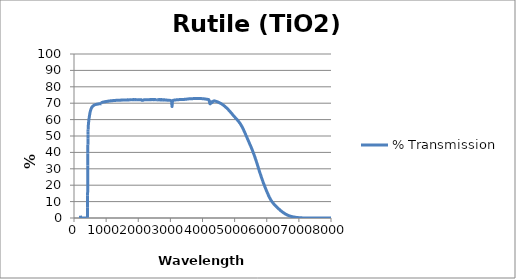
| Category | % Transmission |
|---|---|
| 200.0 | 1.432 |
| 202.0 | 0.986 |
| 204.0 | 0.728 |
| 206.0 | 0.485 |
| 208.0 | 0.356 |
| 210.0 | 0.247 |
| 212.0 | 0.213 |
| 214.0 | 0.172 |
| 216.0 | 0.12 |
| 218.0 | 0.092 |
| 220.0 | 0.074 |
| 222.0 | 0.062 |
| 224.0 | 0.046 |
| 226.0 | 0.031 |
| 228.0 | 0.032 |
| 230.0 | 0.025 |
| 232.0 | 0.013 |
| 234.0 | 0.014 |
| 236.0 | 0.012 |
| 238.0 | 0.01 |
| 240.0 | 0.006 |
| 242.0 | 0.01 |
| 244.0 | 0.007 |
| 246.0 | 0.003 |
| 248.0 | 0.007 |
| 250.0 | 0.006 |
| 252.0 | 0 |
| 254.0 | 0.005 |
| 256.0 | 0.006 |
| 258.0 | 0.005 |
| 260.0 | 0.005 |
| 262.0 | 0.005 |
| 264.0 | 0.001 |
| 266.0 | 0 |
| 268.0 | 0.002 |
| 270.0 | 0.004 |
| 272.0 | 0.002 |
| 274.0 | 0.005 |
| 276.0 | 0.005 |
| 278.0 | 0.005 |
| 280.0 | 0.005 |
| 282.0 | 0.001 |
| 284.0 | 0.004 |
| 286.0 | 0.004 |
| 288.0 | 0 |
| 290.0 | 0.002 |
| 292.0 | 0.003 |
| 294.0 | 0.006 |
| 296.0 | 0.002 |
| 298.0 | 0.004 |
| 300.0 | 0.001 |
| 302.0 | 0.003 |
| 304.0 | 0.005 |
| 306.0 | 0.003 |
| 308.0 | 0.002 |
| 310.0 | 0.002 |
| 312.0 | 0.002 |
| 314.0 | 0.003 |
| 316.0 | 0.002 |
| 318.0 | 0.003 |
| 320.0 | 0.003 |
| 322.0 | 0 |
| 324.0 | 0.002 |
| 326.0 | 0.005 |
| 328.0 | 0.001 |
| 330.0 | 0.004 |
| 332.0 | 0.002 |
| 334.0 | 0.002 |
| 336.0 | 0.001 |
| 338.0 | 0.002 |
| 340.0 | 0.003 |
| 342.0 | 0.001 |
| 344.0 | 0.002 |
| 346.0 | 0.002 |
| 348.0 | 0.002 |
| 350.0 | 0.003 |
| 352.0 | 0.001 |
| 354.0 | 0.002 |
| 356.0 | 0 |
| 358.0 | 0 |
| 360.0 | 0.004 |
| 362.0 | 0.002 |
| 364.0 | 0.001 |
| 366.0 | 0.002 |
| 368.0 | 0 |
| 370.0 | 0 |
| 372.0 | 0.002 |
| 374.0 | 0.003 |
| 376.0 | 0.002 |
| 378.0 | 0.001 |
| 380.0 | 0.001 |
| 382.0 | 0 |
| 384.0 | 0.004 |
| 386.0 | 0.001 |
| 388.0 | 0 |
| 390.0 | 0 |
| 392.0 | 0.002 |
| 394.0 | 0.001 |
| 396.0 | 0.001 |
| 398.0 | 0.004 |
| 400.0 | 0.004 |
| 402.0 | 0.002 |
| 404.0 | 0.005 |
| 406.0 | 0 |
| 408.0 | 0.002 |
| 410.0 | 0.001 |
| 412.0 | 0.003 |
| 414.0 | 0.003 |
| 416.0 | 0.023 |
| 418.0 | 0.297 |
| 420.0 | 1.832 |
| 422.0 | 6.296 |
| 424.0 | 13.903 |
| 426.0 | 23.111 |
| 428.0 | 32.044 |
| 430.0 | 39.349 |
| 432.0 | 44.659 |
| 434.0 | 48.385 |
| 436.0 | 50.975 |
| 438.0 | 52.831 |
| 440.0 | 54.158 |
| 442.0 | 55.135 |
| 444.0 | 55.863 |
| 446.0 | 56.455 |
| 448.0 | 56.992 |
| 450.0 | 57.442 |
| 452.0 | 57.876 |
| 454.0 | 58.243 |
| 456.0 | 58.602 |
| 458.0 | 58.931 |
| 460.0 | 59.29 |
| 462.0 | 59.622 |
| 464.0 | 59.935 |
| 466.0 | 60.234 |
| 468.0 | 60.539 |
| 470.0 | 60.837 |
| 472.0 | 61.133 |
| 474.0 | 61.404 |
| 476.0 | 61.669 |
| 478.0 | 61.948 |
| 480.0 | 62.198 |
| 482.0 | 62.438 |
| 484.0 | 62.661 |
| 486.0 | 62.878 |
| 488.0 | 63.123 |
| 490.0 | 63.337 |
| 492.0 | 63.55 |
| 494.0 | 63.749 |
| 496.0 | 63.918 |
| 498.0 | 64.12 |
| 500.0 | 64.334 |
| 502.0 | 64.513 |
| 504.0 | 64.687 |
| 506.0 | 64.823 |
| 508.0 | 64.968 |
| 510.0 | 65.136 |
| 512.0 | 65.325 |
| 514.0 | 65.462 |
| 516.0 | 65.601 |
| 518.0 | 65.727 |
| 520.0 | 65.842 |
| 522.0 | 65.982 |
| 524.0 | 66.118 |
| 526.0 | 66.231 |
| 528.0 | 66.335 |
| 530.0 | 66.429 |
| 532.0 | 66.52 |
| 534.0 | 66.614 |
| 536.0 | 66.728 |
| 538.0 | 66.821 |
| 540.0 | 66.917 |
| 542.0 | 66.991 |
| 544.0 | 67.04 |
| 546.0 | 67.121 |
| 548.0 | 67.212 |
| 550.0 | 67.283 |
| 552.0 | 67.371 |
| 554.0 | 67.415 |
| 556.0 | 67.451 |
| 558.0 | 67.521 |
| 560.0 | 67.599 |
| 562.0 | 67.662 |
| 564.0 | 67.727 |
| 566.0 | 67.758 |
| 568.0 | 67.813 |
| 570.0 | 67.865 |
| 572.0 | 67.913 |
| 574.0 | 67.962 |
| 576.0 | 68.007 |
| 578.0 | 68.041 |
| 580.0 | 68.087 |
| 582.0 | 68.13 |
| 584.0 | 68.161 |
| 586.0 | 68.194 |
| 588.0 | 68.258 |
| 590.0 | 68.283 |
| 592.0 | 68.287 |
| 594.0 | 68.308 |
| 596.0 | 68.367 |
| 598.0 | 68.399 |
| 600.0 | 68.434 |
| 602.0 | 68.455 |
| 604.0 | 68.49 |
| 606.0 | 68.518 |
| 608.0 | 68.544 |
| 610.0 | 68.577 |
| 612.0 | 68.596 |
| 614.0 | 68.621 |
| 616.0 | 68.659 |
| 618.0 | 68.691 |
| 620.0 | 68.72 |
| 622.0 | 68.738 |
| 624.0 | 68.764 |
| 626.0 | 68.771 |
| 628.0 | 68.799 |
| 630.0 | 68.835 |
| 632.0 | 68.859 |
| 634.0 | 68.88 |
| 636.0 | 68.89 |
| 638.0 | 68.903 |
| 640.0 | 68.949 |
| 642.0 | 68.953 |
| 644.0 | 68.954 |
| 646.0 | 68.978 |
| 648.0 | 69.017 |
| 650.0 | 69.022 |
| 652.0 | 69.038 |
| 654.0 | 69.055 |
| 656.0 | 69.064 |
| 658.0 | 69.099 |
| 660.0 | 69.121 |
| 662.0 | 69.122 |
| 664.0 | 69.128 |
| 666.0 | 69.128 |
| 668.0 | 69.157 |
| 670.0 | 69.185 |
| 672.0 | 69.192 |
| 674.0 | 69.181 |
| 676.0 | 69.198 |
| 678.0 | 69.213 |
| 680.0 | 69.224 |
| 682.0 | 69.252 |
| 684.0 | 69.254 |
| 686.0 | 69.234 |
| 688.0 | 69.259 |
| 690.0 | 69.292 |
| 692.0 | 69.296 |
| 694.0 | 69.308 |
| 696.0 | 69.312 |
| 698.0 | 69.302 |
| 700.0 | 69.325 |
| 702.0 | 69.332 |
| 704.0 | 69.326 |
| 706.0 | 69.358 |
| 708.0 | 69.376 |
| 710.0 | 69.356 |
| 712.0 | 69.367 |
| 714.0 | 69.382 |
| 716.0 | 69.385 |
| 718.0 | 69.408 |
| 720.0 | 69.411 |
| 722.0 | 69.397 |
| 724.0 | 69.402 |
| 726.0 | 69.415 |
| 728.0 | 69.425 |
| 730.0 | 69.456 |
| 732.0 | 69.449 |
| 734.0 | 69.442 |
| 736.0 | 69.473 |
| 738.0 | 69.48 |
| 740.0 | 69.476 |
| 742.0 | 69.492 |
| 744.0 | 69.487 |
| 746.0 | 69.478 |
| 748.0 | 69.501 |
| 750.0 | 69.513 |
| 752.0 | 69.508 |
| 754.0 | 69.52 |
| 756.0 | 69.526 |
| 758.0 | 69.537 |
| 760.0 | 69.553 |
| 762.0 | 69.546 |
| 764.0 | 69.536 |
| 766.0 | 69.571 |
| 768.0 | 69.584 |
| 770.0 | 69.578 |
| 772.0 | 69.581 |
| 774.0 | 69.58 |
| 776.0 | 69.588 |
| 778.0 | 69.624 |
| 780.0 | 69.629 |
| 782.0 | 69.627 |
| 784.0 | 69.636 |
| 786.0 | 69.639 |
| 788.0 | 69.632 |
| 790.0 | 69.648 |
| 792.0 | 69.661 |
| 794.0 | 69.666 |
| 796.0 | 69.672 |
| 798.0 | 69.689 |
| 800.0 | 69.686 |
| 802.0 | 69.701 |
| 804.0 | 69.701 |
| 806.0 | 69.718 |
| 808.0 | 69.72 |
| 810.0 | 69.691 |
| 812.0 | 69.7 |
| 814.0 | 69.702 |
| 816.0 | 69.696 |
| 818.0 | 69.723 |
| 820.0 | 69.702 |
| 822.0 | 69.693 |
| 824.0 | 69.721 |
| 826.0 | 69.742 |
| 828.0 | 69.722 |
| 830.0 | 69.715 |
| 832.0 | 69.683 |
| 834.0 | 69.703 |
| 836.0 | 69.693 |
| 838.0 | 69.678 |
| 840.0 | 69.664 |
| 842.0 | 69.663 |
| 844.0 | 69.666 |
| 846.0 | 69.687 |
| 848.0 | 69.667 |
| 850.0 | 69.643 |
| 852.0 | 69.608 |
| 854.0 | 69.667 |
| 856.0 | 69.663 |
| 858.0 | 69.665 |
| 860.0 | 70.148 |
| 862.0 | 70.385 |
| 864.0 | 70.407 |
| 866.0 | 70.45 |
| 868.0 | 70.442 |
| 870.0 | 70.448 |
| 872.0 | 70.468 |
| 874.0 | 70.494 |
| 876.0 | 70.495 |
| 878.0 | 70.504 |
| 880.0 | 70.511 |
| 882.0 | 70.515 |
| 884.0 | 70.537 |
| 886.0 | 70.558 |
| 888.0 | 70.576 |
| 890.0 | 70.593 |
| 892.0 | 70.598 |
| 894.0 | 70.585 |
| 896.0 | 70.598 |
| 898.0 | 70.614 |
| 900.0 | 70.632 |
| 902.0 | 70.651 |
| 904.0 | 70.654 |
| 906.0 | 70.659 |
| 908.0 | 70.681 |
| 910.0 | 70.671 |
| 912.0 | 70.693 |
| 914.0 | 70.696 |
| 916.0 | 70.693 |
| 918.0 | 70.713 |
| 920.0 | 70.738 |
| 922.0 | 70.741 |
| 924.0 | 70.739 |
| 926.0 | 70.743 |
| 928.0 | 70.755 |
| 930.0 | 70.776 |
| 932.0 | 70.792 |
| 934.0 | 70.781 |
| 936.0 | 70.794 |
| 938.0 | 70.783 |
| 940.0 | 70.792 |
| 942.0 | 70.816 |
| 944.0 | 70.831 |
| 946.0 | 70.862 |
| 948.0 | 70.852 |
| 950.0 | 70.856 |
| 952.0 | 70.85 |
| 954.0 | 70.84 |
| 956.0 | 70.85 |
| 958.0 | 70.868 |
| 960.0 | 70.873 |
| 962.0 | 70.872 |
| 964.0 | 70.888 |
| 966.0 | 70.909 |
| 968.0 | 70.904 |
| 970.0 | 70.915 |
| 972.0 | 70.924 |
| 974.0 | 70.926 |
| 976.0 | 70.937 |
| 978.0 | 70.94 |
| 980.0 | 70.959 |
| 982.0 | 70.962 |
| 984.0 | 70.981 |
| 986.0 | 70.985 |
| 988.0 | 70.951 |
| 990.0 | 70.953 |
| 992.0 | 70.988 |
| 994.0 | 70.992 |
| 996.0 | 70.99 |
| 998.0 | 70.97 |
| 1000.0 | 70.978 |
| 1002.0 | 71.033 |
| 1004.0 | 71.029 |
| 1006.0 | 71.009 |
| 1008.0 | 71.042 |
| 1010.0 | 71.069 |
| 1012.0 | 71.065 |
| 1014.0 | 71.056 |
| 1016.0 | 71.053 |
| 1018.0 | 71.064 |
| 1020.0 | 71.054 |
| 1022.0 | 71.092 |
| 1024.0 | 71.119 |
| 1026.0 | 71.093 |
| 1028.0 | 71.072 |
| 1030.0 | 71.079 |
| 1032.0 | 71.116 |
| 1034.0 | 71.117 |
| 1036.0 | 71.12 |
| 1038.0 | 71.179 |
| 1040.0 | 71.145 |
| 1042.0 | 71.145 |
| 1044.0 | 71.161 |
| 1046.0 | 71.161 |
| 1048.0 | 71.167 |
| 1050.0 | 71.202 |
| 1052.0 | 71.192 |
| 1054.0 | 71.156 |
| 1056.0 | 71.183 |
| 1058.0 | 71.199 |
| 1060.0 | 71.227 |
| 1062.0 | 71.212 |
| 1064.0 | 71.221 |
| 1066.0 | 71.211 |
| 1068.0 | 71.207 |
| 1070.0 | 71.231 |
| 1072.0 | 71.216 |
| 1074.0 | 71.241 |
| 1076.0 | 71.228 |
| 1078.0 | 71.283 |
| 1080.0 | 71.268 |
| 1082.0 | 71.283 |
| 1084.0 | 71.288 |
| 1086.0 | 71.313 |
| 1088.0 | 71.28 |
| 1090.0 | 71.28 |
| 1092.0 | 71.297 |
| 1094.0 | 71.313 |
| 1096.0 | 71.35 |
| 1098.0 | 71.327 |
| 1100.0 | 71.325 |
| 1102.0 | 71.32 |
| 1104.0 | 71.341 |
| 1106.0 | 71.33 |
| 1108.0 | 71.335 |
| 1110.0 | 71.354 |
| 1112.0 | 71.37 |
| 1114.0 | 71.372 |
| 1116.0 | 71.393 |
| 1118.0 | 71.377 |
| 1120.0 | 71.388 |
| 1122.0 | 71.382 |
| 1124.0 | 71.379 |
| 1126.0 | 71.39 |
| 1128.0 | 71.39 |
| 1130.0 | 71.383 |
| 1132.0 | 71.41 |
| 1134.0 | 71.452 |
| 1136.0 | 71.43 |
| 1138.0 | 71.447 |
| 1140.0 | 71.433 |
| 1142.0 | 71.432 |
| 1144.0 | 71.44 |
| 1146.0 | 71.45 |
| 1148.0 | 71.448 |
| 1150.0 | 71.448 |
| 1152.0 | 71.431 |
| 1154.0 | 71.417 |
| 1156.0 | 71.468 |
| 1158.0 | 71.466 |
| 1160.0 | 71.522 |
| 1162.0 | 71.471 |
| 1164.0 | 71.486 |
| 1166.0 | 71.484 |
| 1168.0 | 71.507 |
| 1170.0 | 71.475 |
| 1172.0 | 71.476 |
| 1174.0 | 71.461 |
| 1176.0 | 71.458 |
| 1178.0 | 71.467 |
| 1180.0 | 71.52 |
| 1182.0 | 71.535 |
| 1184.0 | 71.535 |
| 1186.0 | 71.542 |
| 1188.0 | 71.551 |
| 1190.0 | 71.524 |
| 1192.0 | 71.534 |
| 1194.0 | 71.562 |
| 1196.0 | 71.582 |
| 1198.0 | 71.558 |
| 1200.0 | 71.546 |
| 1202.0 | 71.569 |
| 1204.0 | 71.584 |
| 1206.0 | 71.592 |
| 1208.0 | 71.585 |
| 1210.0 | 71.58 |
| 1212.0 | 71.557 |
| 1214.0 | 71.592 |
| 1216.0 | 71.601 |
| 1218.0 | 71.606 |
| 1220.0 | 71.589 |
| 1222.0 | 71.602 |
| 1224.0 | 71.629 |
| 1226.0 | 71.587 |
| 1228.0 | 71.604 |
| 1230.0 | 71.608 |
| 1232.0 | 71.622 |
| 1234.0 | 71.624 |
| 1236.0 | 71.618 |
| 1238.0 | 71.608 |
| 1240.0 | 71.634 |
| 1242.0 | 71.662 |
| 1244.0 | 71.657 |
| 1246.0 | 71.635 |
| 1248.0 | 71.664 |
| 1250.0 | 71.666 |
| 1252.0 | 71.637 |
| 1254.0 | 71.659 |
| 1256.0 | 71.697 |
| 1258.0 | 71.675 |
| 1260.0 | 71.614 |
| 1262.0 | 71.608 |
| 1264.0 | 71.638 |
| 1266.0 | 71.659 |
| 1268.0 | 71.701 |
| 1270.0 | 71.707 |
| 1272.0 | 71.704 |
| 1274.0 | 71.707 |
| 1276.0 | 71.692 |
| 1278.0 | 71.702 |
| 1280.0 | 71.705 |
| 1282.0 | 71.705 |
| 1284.0 | 71.677 |
| 1286.0 | 71.675 |
| 1288.0 | 71.68 |
| 1290.0 | 71.692 |
| 1292.0 | 71.7 |
| 1294.0 | 71.693 |
| 1296.0 | 71.727 |
| 1298.0 | 71.733 |
| 1300.0 | 71.71 |
| 1302.0 | 71.723 |
| 1304.0 | 71.76 |
| 1306.0 | 71.754 |
| 1308.0 | 71.717 |
| 1310.0 | 71.733 |
| 1312.0 | 71.741 |
| 1314.0 | 71.736 |
| 1316.0 | 71.748 |
| 1318.0 | 71.75 |
| 1320.0 | 71.767 |
| 1322.0 | 71.775 |
| 1324.0 | 71.764 |
| 1326.0 | 71.747 |
| 1328.0 | 71.741 |
| 1330.0 | 71.759 |
| 1332.0 | 71.764 |
| 1334.0 | 71.749 |
| 1336.0 | 71.751 |
| 1338.0 | 71.786 |
| 1340.0 | 71.807 |
| 1342.0 | 71.801 |
| 1344.0 | 71.776 |
| 1346.0 | 71.776 |
| 1348.0 | 71.745 |
| 1350.0 | 71.735 |
| 1352.0 | 71.745 |
| 1354.0 | 71.76 |
| 1356.0 | 71.749 |
| 1358.0 | 71.735 |
| 1360.0 | 71.744 |
| 1362.0 | 71.742 |
| 1364.0 | 71.748 |
| 1366.0 | 71.766 |
| 1368.0 | 71.788 |
| 1370.0 | 71.798 |
| 1372.0 | 71.788 |
| 1374.0 | 71.754 |
| 1376.0 | 71.747 |
| 1378.0 | 71.727 |
| 1380.0 | 71.759 |
| 1382.0 | 71.78 |
| 1384.0 | 71.783 |
| 1386.0 | 71.796 |
| 1388.0 | 71.786 |
| 1390.0 | 71.776 |
| 1392.0 | 71.785 |
| 1394.0 | 71.774 |
| 1396.0 | 71.783 |
| 1398.0 | 71.805 |
| 1400.0 | 71.827 |
| 1402.0 | 71.797 |
| 1404.0 | 71.78 |
| 1406.0 | 71.808 |
| 1408.0 | 71.815 |
| 1410.0 | 71.822 |
| 1412.0 | 71.835 |
| 1414.0 | 71.819 |
| 1416.0 | 71.811 |
| 1418.0 | 71.845 |
| 1420.0 | 71.861 |
| 1422.0 | 71.854 |
| 1424.0 | 71.852 |
| 1426.0 | 71.846 |
| 1428.0 | 71.843 |
| 1430.0 | 71.837 |
| 1432.0 | 71.833 |
| 1434.0 | 71.816 |
| 1436.0 | 71.816 |
| 1438.0 | 71.827 |
| 1440.0 | 71.845 |
| 1442.0 | 71.87 |
| 1444.0 | 71.879 |
| 1446.0 | 71.88 |
| 1448.0 | 71.861 |
| 1450.0 | 71.849 |
| 1452.0 | 71.863 |
| 1454.0 | 71.851 |
| 1456.0 | 71.849 |
| 1458.0 | 71.846 |
| 1460.0 | 71.859 |
| 1462.0 | 71.861 |
| 1464.0 | 71.848 |
| 1466.0 | 71.855 |
| 1468.0 | 71.872 |
| 1470.0 | 71.872 |
| 1472.0 | 71.861 |
| 1474.0 | 71.876 |
| 1476.0 | 71.892 |
| 1478.0 | 71.9 |
| 1480.0 | 71.924 |
| 1482.0 | 71.911 |
| 1484.0 | 71.877 |
| 1486.0 | 71.879 |
| 1488.0 | 71.895 |
| 1490.0 | 71.901 |
| 1492.0 | 71.902 |
| 1494.0 | 71.906 |
| 1496.0 | 71.908 |
| 1498.0 | 71.884 |
| 1500.0 | 71.868 |
| 1502.0 | 71.897 |
| 1504.0 | 71.898 |
| 1506.0 | 71.893 |
| 1508.0 | 71.902 |
| 1510.0 | 71.914 |
| 1512.0 | 71.888 |
| 1514.0 | 71.876 |
| 1516.0 | 71.889 |
| 1518.0 | 71.883 |
| 1520.0 | 71.893 |
| 1522.0 | 71.917 |
| 1524.0 | 71.901 |
| 1526.0 | 71.884 |
| 1528.0 | 71.903 |
| 1530.0 | 71.943 |
| 1532.0 | 71.922 |
| 1534.0 | 71.912 |
| 1536.0 | 71.929 |
| 1538.0 | 71.93 |
| 1540.0 | 71.931 |
| 1542.0 | 71.954 |
| 1544.0 | 71.945 |
| 1546.0 | 71.939 |
| 1548.0 | 71.938 |
| 1550.0 | 71.937 |
| 1552.0 | 71.951 |
| 1554.0 | 71.953 |
| 1556.0 | 71.934 |
| 1558.0 | 71.937 |
| 1560.0 | 71.939 |
| 1562.0 | 71.92 |
| 1564.0 | 71.932 |
| 1566.0 | 71.957 |
| 1568.0 | 71.934 |
| 1570.0 | 71.946 |
| 1572.0 | 71.928 |
| 1574.0 | 71.914 |
| 1576.0 | 71.929 |
| 1578.0 | 71.948 |
| 1580.0 | 71.939 |
| 1582.0 | 71.927 |
| 1584.0 | 71.934 |
| 1586.0 | 71.931 |
| 1588.0 | 71.933 |
| 1590.0 | 71.951 |
| 1592.0 | 71.971 |
| 1594.0 | 71.967 |
| 1596.0 | 71.959 |
| 1598.0 | 71.967 |
| 1600.0 | 71.975 |
| 1602.0 | 71.994 |
| 1604.0 | 71.985 |
| 1606.0 | 71.966 |
| 1608.0 | 71.97 |
| 1610.0 | 72.002 |
| 1612.0 | 71.986 |
| 1614.0 | 71.97 |
| 1616.0 | 71.958 |
| 1618.0 | 71.979 |
| 1620.0 | 71.994 |
| 1622.0 | 72.004 |
| 1624.0 | 72 |
| 1626.0 | 72.017 |
| 1628.0 | 71.979 |
| 1630.0 | 71.993 |
| 1632.0 | 71.996 |
| 1634.0 | 71.995 |
| 1636.0 | 72.023 |
| 1638.0 | 72.013 |
| 1640.0 | 72.024 |
| 1642.0 | 72.003 |
| 1644.0 | 72.013 |
| 1646.0 | 71.995 |
| 1648.0 | 72.014 |
| 1650.0 | 71.99 |
| 1652.0 | 72.019 |
| 1654.0 | 72.02 |
| 1656.0 | 72.009 |
| 1658.0 | 72.031 |
| 1660.0 | 72.022 |
| 1662.0 | 72.013 |
| 1664.0 | 71.998 |
| 1666.548 | 72.083 |
| 1667.834 | 72.071 |
| 1669.12 | 72.075 |
| 1670.406 | 72.034 |
| 1671.692 | 72.077 |
| 1672.978 | 72.072 |
| 1674.264 | 72.047 |
| 1675.5500000000002 | 72.059 |
| 1676.836 | 72.054 |
| 1678.1219999999998 | 72.048 |
| 1679.408 | 72.037 |
| 1680.693 | 72.046 |
| 1681.9789999999998 | 72.026 |
| 1683.265 | 72.026 |
| 1684.551 | 72.045 |
| 1685.837 | 72.012 |
| 1687.1229999999998 | 72.015 |
| 1688.409 | 71.995 |
| 1689.695 | 72.015 |
| 1690.981 | 72.028 |
| 1692.267 | 71.999 |
| 1693.553 | 72.03 |
| 1694.839 | 72.001 |
| 1696.124 | 72.008 |
| 1697.41 | 72.02 |
| 1698.696 | 72.008 |
| 1699.9820000000002 | 71.992 |
| 1701.268 | 71.987 |
| 1702.5539999999999 | 71.996 |
| 1703.84 | 71.978 |
| 1705.126 | 71.993 |
| 1706.412 | 71.971 |
| 1707.6979999999999 | 71.979 |
| 1708.9840000000002 | 71.957 |
| 1710.27 | 71.981 |
| 1711.5549999999998 | 71.976 |
| 1712.8410000000001 | 71.981 |
| 1714.127 | 72.015 |
| 1715.413 | 72.004 |
| 1716.699 | 72.008 |
| 1717.9850000000001 | 72.011 |
| 1719.271 | 72.024 |
| 1720.5569999999998 | 72.022 |
| 1721.843 | 72.019 |
| 1723.129 | 72.023 |
| 1724.415 | 72.053 |
| 1725.701 | 72.037 |
| 1726.9859999999999 | 72.053 |
| 1728.272 | 72.059 |
| 1729.558 | 72.04 |
| 1730.844 | 72.036 |
| 1732.1299999999999 | 72.058 |
| 1733.4160000000002 | 72.047 |
| 1734.702 | 72.052 |
| 1735.988 | 72.058 |
| 1737.274 | 72.05 |
| 1738.5600000000002 | 72.044 |
| 1739.846 | 72.032 |
| 1741.1319999999998 | 72.035 |
| 1742.4170000000001 | 72.083 |
| 1743.703 | 72.04 |
| 1744.9889999999998 | 72.041 |
| 1746.275 | 72.036 |
| 1747.561 | 72.049 |
| 1748.847 | 72.045 |
| 1750.133 | 72.029 |
| 1751.419 | 72.035 |
| 1752.705 | 72.043 |
| 1753.991 | 72.059 |
| 1755.277 | 72.077 |
| 1756.563 | 72.081 |
| 1757.8480000000002 | 72.05 |
| 1759.134 | 72.081 |
| 1760.42 | 72.07 |
| 1761.706 | 72.096 |
| 1762.992 | 72.09 |
| 1764.278 | 72.086 |
| 1765.5639999999999 | 72.087 |
| 1766.8500000000001 | 72.099 |
| 1768.136 | 72.117 |
| 1769.422 | 72.066 |
| 1770.7079999999999 | 72.104 |
| 1771.9940000000001 | 72.092 |
| 1773.279 | 72.091 |
| 1774.565 | 72.093 |
| 1775.851 | 72.075 |
| 1777.137 | 72.093 |
| 1778.423 | 72.103 |
| 1779.709 | 72.094 |
| 1780.9950000000001 | 72.112 |
| 1782.281 | 72.101 |
| 1783.567 | 72.086 |
| 1784.853 | 72.07 |
| 1786.139 | 72.112 |
| 1787.425 | 72.101 |
| 1788.71 | 72.087 |
| 1789.9959999999999 | 72.096 |
| 1791.2820000000002 | 72.126 |
| 1792.568 | 72.106 |
| 1793.854 | 72.099 |
| 1795.1399999999999 | 72.109 |
| 1796.4260000000002 | 72.116 |
| 1797.712 | 72.102 |
| 1798.998 | 72.115 |
| 1800.284 | 72.108 |
| 1801.57 | 72.11 |
| 1802.856 | 72.106 |
| 1804.141 | 72.112 |
| 1805.427 | 72.119 |
| 1806.713 | 72.108 |
| 1807.999 | 72.106 |
| 1809.285 | 72.095 |
| 1810.571 | 72.118 |
| 1811.857 | 72.121 |
| 1813.143 | 72.101 |
| 1814.429 | 72.109 |
| 1815.715 | 72.147 |
| 1817.001 | 72.108 |
| 1818.287 | 72.123 |
| 1819.572 | 72.138 |
| 1820.8580000000002 | 72.156 |
| 1822.144 | 72.135 |
| 1823.43 | 72.102 |
| 1824.716 | 72.114 |
| 1826.002 | 72.18 |
| 1827.288 | 72.105 |
| 1828.5739999999998 | 72.137 |
| 1829.8600000000001 | 72.143 |
| 1831.146 | 72.163 |
| 1832.432 | 72.134 |
| 1833.7179999999998 | 72.117 |
| 1835.003 | 72.155 |
| 1836.289 | 72.179 |
| 1837.575 | 72.166 |
| 1838.861 | 72.104 |
| 1840.147 | 72.17 |
| 1841.433 | 72.181 |
| 1842.719 | 72.133 |
| 1844.0049999999999 | 72.132 |
| 1845.291 | 72.131 |
| 1846.577 | 72.189 |
| 1847.863 | 72.183 |
| 1849.149 | 72.122 |
| 1850.434 | 72.139 |
| 1851.72 | 72.119 |
| 1853.0059999999999 | 72.169 |
| 1854.2920000000001 | 72.166 |
| 1855.578 | 72.105 |
| 1856.864 | 72.158 |
| 1858.1499999999999 | 72.114 |
| 1859.4360000000001 | 72.173 |
| 1860.722 | 72.135 |
| 1862.008 | 72.118 |
| 1863.294 | 72.123 |
| 1864.58 | 72.156 |
| 1865.865 | 72.112 |
| 1867.151 | 72.148 |
| 1868.437 | 72.146 |
| 1869.723 | 72.154 |
| 1871.009 | 72.249 |
| 1872.295 | 72.12 |
| 1873.581 | 72.205 |
| 1874.867 | 72.141 |
| 1876.153 | 72.128 |
| 1877.439 | 72.155 |
| 1878.725 | 72.111 |
| 1880.0110000000002 | 72.121 |
| 1881.296 | 72.123 |
| 1882.5819999999999 | 72.123 |
| 1883.8680000000002 | 72.157 |
| 1885.154 | 72.132 |
| 1886.4399999999998 | 72.144 |
| 1887.726 | 72.112 |
| 1889.012 | 72.118 |
| 1890.298 | 72.159 |
| 1891.5839999999998 | 72.135 |
| 1892.8700000000001 | 72.117 |
| 1894.156 | 72.132 |
| 1895.442 | 72.114 |
| 1896.727 | 72.12 |
| 1898.013 | 72.131 |
| 1899.299 | 72.188 |
| 1900.585 | 72.167 |
| 1901.871 | 72.117 |
| 1903.157 | 72.173 |
| 1904.4430000000002 | 72.15 |
| 1905.729 | 72.175 |
| 1907.0149999999999 | 72.145 |
| 1908.301 | 72.125 |
| 1909.587 | 72.12 |
| 1910.873 | 72.153 |
| 1912.1589999999999 | 72.128 |
| 1913.444 | 72.184 |
| 1914.73 | 72.126 |
| 1916.0159999999998 | 72.146 |
| 1917.3020000000001 | 72.125 |
| 1918.588 | 72.131 |
| 1919.874 | 72.181 |
| 1921.16 | 72.169 |
| 1922.4460000000001 | 72.142 |
| 1923.732 | 72.161 |
| 1925.0179999999998 | 72.125 |
| 1926.304 | 72.121 |
| 1927.59 | 72.126 |
| 1928.875 | 72.143 |
| 1930.161 | 72.126 |
| 1931.447 | 72.139 |
| 1932.733 | 72.116 |
| 1934.019 | 72.13 |
| 1935.305 | 72.114 |
| 1936.591 | 72.146 |
| 1937.8770000000002 | 72.127 |
| 1939.163 | 72.146 |
| 1940.449 | 72.121 |
| 1941.735 | 72.127 |
| 1943.0210000000002 | 72.135 |
| 1944.306 | 72.124 |
| 1945.592 | 72.118 |
| 1946.8780000000002 | 72.133 |
| 1948.164 | 72.119 |
| 1949.4499999999998 | 72.123 |
| 1950.736 | 72.13 |
| 1952.022 | 72.131 |
| 1953.308 | 72.146 |
| 1954.594 | 72.126 |
| 1955.88 | 72.136 |
| 1957.166 | 72.129 |
| 1958.452 | 72.127 |
| 1959.737 | 72.124 |
| 1961.023 | 72.126 |
| 1962.309 | 72.125 |
| 1963.595 | 72.128 |
| 1964.881 | 72.145 |
| 1966.167 | 72.14 |
| 1967.453 | 72.133 |
| 1968.739 | 72.134 |
| 1970.0249999999999 | 72.136 |
| 1971.3110000000001 | 72.147 |
| 1972.597 | 72.119 |
| 1973.883 | 72.128 |
| 1975.1680000000001 | 72.133 |
| 1976.454 | 72.134 |
| 1977.74 | 72.135 |
| 1979.0259999999998 | 72.123 |
| 1980.3120000000001 | 72.12 |
| 1981.598 | 72.13 |
| 1982.884 | 72.123 |
| 1984.17 | 72.142 |
| 1985.4560000000001 | 72.138 |
| 1986.742 | 72.117 |
| 1988.0279999999998 | 72.126 |
| 1989.314 | 72.132 |
| 1990.599 | 72.128 |
| 1991.885 | 72.128 |
| 1993.171 | 72.134 |
| 1994.4569999999999 | 72.145 |
| 1995.743 | 72.141 |
| 1997.029 | 72.141 |
| 1998.315 | 72.133 |
| 1999.6009999999999 | 72.119 |
| 2000.8870000000002 | 72.124 |
| 2002.173 | 72.143 |
| 2003.4589999999998 | 72.15 |
| 2004.7450000000001 | 72.137 |
| 2006.03 | 72.132 |
| 2007.3159999999998 | 72.142 |
| 2008.6020000000003 | 72.133 |
| 2009.8880000000001 | 72.122 |
| 2011.174 | 72.132 |
| 2012.4599999999998 | 72.136 |
| 2013.7459999999999 | 72.129 |
| 2015.0320000000002 | 72.137 |
| 2016.318 | 72.135 |
| 2017.604 | 72.136 |
| 2018.8899999999999 | 72.144 |
| 2020.1760000000002 | 72.127 |
| 2021.461 | 72.13 |
| 2022.7469999999998 | 72.134 |
| 2024.0330000000001 | 72.134 |
| 2025.3190000000002 | 72.139 |
| 2026.605 | 72.142 |
| 2027.8909999999998 | 72.145 |
| 2029.1769999999997 | 72.154 |
| 2030.4630000000002 | 72.139 |
| 2031.749 | 72.14 |
| 2033.0349999999999 | 72.155 |
| 2034.321 | 72.146 |
| 2035.6070000000002 | 72.141 |
| 2036.8919999999998 | 72.144 |
| 2038.1779999999999 | 72.146 |
| 2039.4640000000002 | 72.15 |
| 2040.75 | 72.138 |
| 2042.036 | 72.144 |
| 2043.322 | 72.132 |
| 2044.6080000000002 | 72.13 |
| 2045.894 | 72.139 |
| 2047.18 | 72.149 |
| 2048.466 | 72.141 |
| 2049.752 | 72.145 |
| 2051.038 | 72.147 |
| 2052.323 | 72.136 |
| 2053.609 | 72.135 |
| 2054.895 | 72.142 |
| 2056.181 | 72.137 |
| 2057.467 | 72.152 |
| 2058.7529999999997 | 72.16 |
| 2060.039 | 72.141 |
| 2061.3250000000003 | 72.144 |
| 2062.611 | 72.147 |
| 2063.897 | 72.154 |
| 2065.183 | 72.141 |
| 2066.469 | 72.143 |
| 2067.754 | 72.144 |
| 2069.0400000000004 | 72.15 |
| 2070.326 | 72.143 |
| 2071.612 | 72.15 |
| 2072.8979999999997 | 72.155 |
| 2074.1839999999997 | 72.157 |
| 2075.4700000000003 | 72.144 |
| 2076.756 | 72.136 |
| 2078.042 | 72.146 |
| 2079.328 | 72.152 |
| 2080.614 | 72.147 |
| 2081.9 | 72.148 |
| 2083.185 | 72.154 |
| 2084.471 | 72.152 |
| 2085.757 | 72.147 |
| 2087.043 | 72.147 |
| 2088.3289999999997 | 72.139 |
| 2089.615 | 72.149 |
| 2090.9010000000003 | 72.144 |
| 2092.187 | 72.15 |
| 2093.473 | 72.129 |
| 2094.759 | 72.121 |
| 2096.045 | 72.12 |
| 2097.331 | 72.072 |
| 2098.616 | 72.042 |
| 2099.902 | 71.998 |
| 2101.188 | 71.952 |
| 2102.474 | 71.917 |
| 2103.7599999999998 | 71.876 |
| 2105.0460000000003 | 71.838 |
| 2106.332 | 71.817 |
| 2107.618 | 71.774 |
| 2108.904 | 71.77 |
| 2110.1899999999996 | 71.755 |
| 2111.476 | 71.75 |
| 2112.762 | 71.739 |
| 2114.0469999999996 | 71.727 |
| 2115.333 | 71.727 |
| 2116.619 | 71.731 |
| 2117.9049999999997 | 71.725 |
| 2119.191 | 71.719 |
| 2120.4770000000003 | 71.728 |
| 2121.763 | 71.723 |
| 2123.049 | 71.736 |
| 2124.335 | 71.759 |
| 2125.621 | 71.769 |
| 2126.907 | 71.799 |
| 2128.193 | 71.821 |
| 2129.478 | 71.835 |
| 2130.764 | 71.799 |
| 2132.05 | 71.777 |
| 2133.336 | 71.767 |
| 2134.622 | 71.763 |
| 2135.9080000000004 | 71.758 |
| 2137.194 | 71.771 |
| 2138.48 | 71.774 |
| 2139.7659999999996 | 71.78 |
| 2141.052 | 71.781 |
| 2142.338 | 71.782 |
| 2143.624 | 71.776 |
| 2144.909 | 71.794 |
| 2146.195 | 71.797 |
| 2147.4809999999998 | 71.798 |
| 2148.767 | 71.786 |
| 2150.0530000000003 | 71.814 |
| 2151.339 | 71.802 |
| 2152.625 | 71.794 |
| 2153.911 | 71.812 |
| 2155.1969999999997 | 71.855 |
| 2156.483 | 71.853 |
| 2157.7690000000002 | 71.864 |
| 2159.055 | 71.894 |
| 2160.34 | 71.903 |
| 2161.626 | 71.902 |
| 2162.912 | 71.93 |
| 2164.198 | 71.916 |
| 2165.4840000000004 | 71.924 |
| 2166.77 | 71.965 |
| 2168.056 | 71.971 |
| 2169.342 | 71.992 |
| 2170.6279999999997 | 72.02 |
| 2171.914 | 71.996 |
| 2173.2 | 72.021 |
| 2174.486 | 72.049 |
| 2175.771 | 72.044 |
| 2177.0570000000002 | 72.065 |
| 2178.343 | 72.074 |
| 2179.629 | 72.071 |
| 2180.915 | 72.097 |
| 2182.201 | 72.09 |
| 2183.487 | 72.101 |
| 2184.7729999999997 | 72.1 |
| 2186.059 | 72.124 |
| 2187.3450000000003 | 72.126 |
| 2188.631 | 72.132 |
| 2189.917 | 72.146 |
| 2191.202 | 72.142 |
| 2192.488 | 72.145 |
| 2193.774 | 72.144 |
| 2195.06 | 72.134 |
| 2196.346 | 72.136 |
| 2197.632 | 72.131 |
| 2198.918 | 72.13 |
| 2200.2039999999997 | 72.134 |
| 2201.4900000000002 | 72.133 |
| 2202.776 | 72.135 |
| 2204.062 | 72.138 |
| 2205.348 | 72.135 |
| 2206.6330000000003 | 72.134 |
| 2207.919 | 72.122 |
| 2209.205 | 72.125 |
| 2210.491 | 72.153 |
| 2211.777 | 72.134 |
| 2213.063 | 72.134 |
| 2214.3489999999997 | 72.147 |
| 2215.6349999999998 | 72.143 |
| 2216.9210000000003 | 72.143 |
| 2218.207 | 72.155 |
| 2219.493 | 72.156 |
| 2220.779 | 72.144 |
| 2222.064 | 72.139 |
| 2223.35 | 72.156 |
| 2224.636 | 72.145 |
| 2225.922 | 72.152 |
| 2227.208 | 72.154 |
| 2228.494 | 72.163 |
| 2229.7799999999997 | 72.162 |
| 2231.0660000000003 | 72.16 |
| 2232.3520000000003 | 72.162 |
| 2233.638 | 72.159 |
| 2234.924 | 72.167 |
| 2236.21 | 72.173 |
| 2237.495 | 72.168 |
| 2238.781 | 72.166 |
| 2240.067 | 72.166 |
| 2241.353 | 72.161 |
| 2242.639 | 72.162 |
| 2243.9249999999997 | 72.156 |
| 2245.211 | 72.155 |
| 2246.4970000000003 | 72.153 |
| 2247.783 | 72.158 |
| 2249.069 | 72.167 |
| 2250.355 | 72.167 |
| 2251.6409999999996 | 72.162 |
| 2252.926 | 72.168 |
| 2254.212 | 72.17 |
| 2255.4979999999996 | 72.161 |
| 2256.784 | 72.158 |
| 2258.07 | 72.164 |
| 2259.3559999999998 | 72.168 |
| 2260.642 | 72.165 |
| 2261.9280000000003 | 72.167 |
| 2263.214 | 72.181 |
| 2264.5 | 72.166 |
| 2265.786 | 72.162 |
| 2267.072 | 72.167 |
| 2268.357 | 72.161 |
| 2269.643 | 72.16 |
| 2270.929 | 72.159 |
| 2272.215 | 72.161 |
| 2273.501 | 72.161 |
| 2274.787 | 72.172 |
| 2276.073 | 72.168 |
| 2277.359 | 72.163 |
| 2278.645 | 72.161 |
| 2279.931 | 72.166 |
| 2281.2169999999996 | 72.161 |
| 2282.503 | 72.16 |
| 2283.788 | 72.156 |
| 2285.0739999999996 | 72.156 |
| 2286.36 | 72.156 |
| 2287.646 | 72.165 |
| 2288.932 | 72.161 |
| 2290.218 | 72.153 |
| 2291.5040000000004 | 72.149 |
| 2292.79 | 72.161 |
| 2294.076 | 72.159 |
| 2295.362 | 72.156 |
| 2296.6479999999997 | 72.152 |
| 2297.934 | 72.14 |
| 2299.2200000000003 | 72.151 |
| 2300.5049999999997 | 72.146 |
| 2301.791 | 72.143 |
| 2303.077 | 72.151 |
| 2304.363 | 72.149 |
| 2305.649 | 72.145 |
| 2306.9350000000004 | 72.156 |
| 2308.221 | 72.151 |
| 2309.507 | 72.149 |
| 2310.7929999999997 | 72.158 |
| 2312.079 | 72.165 |
| 2313.3650000000002 | 72.167 |
| 2314.651 | 72.17 |
| 2315.936 | 72.168 |
| 2317.222 | 72.166 |
| 2318.508 | 72.167 |
| 2319.794 | 72.169 |
| 2321.08 | 72.163 |
| 2322.366 | 72.166 |
| 2323.652 | 72.174 |
| 2324.938 | 72.179 |
| 2326.2239999999997 | 72.178 |
| 2327.51 | 72.173 |
| 2328.7960000000003 | 72.167 |
| 2330.082 | 72.172 |
| 2331.367 | 72.165 |
| 2332.6530000000002 | 72.164 |
| 2333.939 | 72.169 |
| 2335.225 | 72.159 |
| 2336.511 | 72.163 |
| 2337.797 | 72.166 |
| 2339.083 | 72.164 |
| 2340.369 | 72.161 |
| 2341.6549999999997 | 72.162 |
| 2342.9410000000003 | 72.171 |
| 2344.227 | 72.166 |
| 2345.513 | 72.168 |
| 2346.7980000000002 | 72.17 |
| 2348.084 | 72.159 |
| 2349.37 | 72.172 |
| 2350.656 | 72.175 |
| 2351.942 | 72.166 |
| 2353.228 | 72.161 |
| 2354.514 | 72.178 |
| 2355.7999999999997 | 72.18 |
| 2357.086 | 72.184 |
| 2358.3720000000003 | 72.178 |
| 2359.658 | 72.178 |
| 2360.944 | 72.18 |
| 2362.2290000000003 | 72.182 |
| 2363.515 | 72.185 |
| 2364.801 | 72.184 |
| 2366.087 | 72.185 |
| 2367.373 | 72.188 |
| 2368.659 | 72.183 |
| 2369.945 | 72.185 |
| 2371.2309999999998 | 72.175 |
| 2372.5170000000003 | 72.171 |
| 2373.803 | 72.177 |
| 2375.089 | 72.174 |
| 2376.375 | 72.171 |
| 2377.6600000000003 | 72.177 |
| 2378.946 | 72.182 |
| 2380.232 | 72.178 |
| 2381.518 | 72.175 |
| 2382.804 | 72.182 |
| 2384.09 | 72.194 |
| 2385.3759999999997 | 72.185 |
| 2386.662 | 72.184 |
| 2387.9480000000003 | 72.191 |
| 2389.234 | 72.193 |
| 2390.52 | 72.183 |
| 2391.806 | 72.166 |
| 2393.091 | 72.17 |
| 2394.377 | 72.183 |
| 2395.663 | 72.18 |
| 2396.949 | 72.189 |
| 2398.235 | 72.189 |
| 2399.521 | 72.185 |
| 2400.807 | 72.187 |
| 2402.093 | 72.179 |
| 2403.3790000000004 | 72.18 |
| 2404.665 | 72.18 |
| 2405.951 | 72.185 |
| 2407.2369999999996 | 72.178 |
| 2408.522 | 72.176 |
| 2409.808 | 72.181 |
| 2411.094 | 72.179 |
| 2412.38 | 72.175 |
| 2413.666 | 72.178 |
| 2414.9519999999998 | 72.187 |
| 2416.238 | 72.187 |
| 2417.524 | 72.189 |
| 2418.81 | 72.187 |
| 2420.096 | 72.178 |
| 2421.382 | 72.163 |
| 2422.6679999999997 | 72.174 |
| 2423.953 | 72.179 |
| 2425.239 | 72.181 |
| 2426.5249999999996 | 72.185 |
| 2427.811 | 72.187 |
| 2429.097 | 72.194 |
| 2430.383 | 72.19 |
| 2431.669 | 72.195 |
| 2432.9550000000004 | 72.193 |
| 2434.241 | 72.186 |
| 2435.527 | 72.182 |
| 2436.813 | 72.18 |
| 2438.0989999999997 | 72.185 |
| 2439.384 | 72.184 |
| 2440.67 | 72.182 |
| 2441.9559999999997 | 72.183 |
| 2443.242 | 72.183 |
| 2444.5280000000002 | 72.19 |
| 2445.814 | 72.187 |
| 2447.1 | 72.177 |
| 2448.386 | 72.177 |
| 2449.672 | 72.17 |
| 2450.958 | 72.186 |
| 2452.2439999999997 | 72.183 |
| 2453.53 | 72.182 |
| 2454.815 | 72.177 |
| 2456.1009999999997 | 72.184 |
| 2457.387 | 72.193 |
| 2458.6730000000002 | 72.189 |
| 2459.959 | 72.185 |
| 2461.245 | 72.189 |
| 2462.531 | 72.181 |
| 2463.817 | 72.174 |
| 2465.103 | 72.181 |
| 2466.389 | 72.189 |
| 2467.6749999999997 | 72.188 |
| 2468.9610000000002 | 72.187 |
| 2470.246 | 72.184 |
| 2471.5319999999997 | 72.184 |
| 2472.818 | 72.178 |
| 2474.1040000000003 | 72.184 |
| 2475.39 | 72.189 |
| 2476.676 | 72.182 |
| 2477.9620000000004 | 72.167 |
| 2479.248 | 72.157 |
| 2480.534 | 72.187 |
| 2481.8199999999997 | 72.192 |
| 2483.1059999999998 | 72.187 |
| 2484.3920000000003 | 72.179 |
| 2485.677 | 72.19 |
| 2486.9629999999997 | 72.196 |
| 2488.2490000000003 | 72.186 |
| 2489.535 | 72.189 |
| 2490.821 | 72.195 |
| 2492.107 | 72.192 |
| 2493.393 | 72.193 |
| 2494.679 | 72.188 |
| 2495.965 | 72.192 |
| 2497.2509999999997 | 72.196 |
| 2498.537 | 72.195 |
| 2499.8230000000003 | 72.198 |
| 2501.1079999999997 | 72.195 |
| 2502.394 | 72.197 |
| 2503.6800000000003 | 72.193 |
| 2504.966 | 72.202 |
| 2506.252 | 72.198 |
| 2507.538 | 72.182 |
| 2508.824 | 72.163 |
| 2510.11 | 72.138 |
| 2511.396 | 72.168 |
| 2512.682 | 72.197 |
| 2513.9680000000003 | 72.19 |
| 2515.254 | 72.18 |
| 2516.5389999999998 | 72.185 |
| 2517.8250000000003 | 72.189 |
| 2519.111 | 72.201 |
| 2520.397 | 72.192 |
| 2521.683 | 72.206 |
| 2522.9689999999996 | 72.211 |
| 2524.255 | 72.202 |
| 2525.541 | 72.191 |
| 2526.8269999999998 | 72.196 |
| 2528.113 | 72.19 |
| 2529.3990000000003 | 72.192 |
| 2530.685 | 72.195 |
| 2531.97 | 72.198 |
| 2533.2560000000003 | 72.178 |
| 2534.542 | 72.187 |
| 2535.828 | 72.208 |
| 2537.114 | 72.165 |
| 2538.4 | 72.197 |
| 2539.686 | 72.201 |
| 2540.972 | 72.175 |
| 2542.258 | 72.167 |
| 2543.544 | 72.165 |
| 2544.83 | 72.163 |
| 2546.116 | 72.185 |
| 2547.401 | 72.225 |
| 2548.6870000000004 | 72.167 |
| 2549.973 | 72.193 |
| 2551.259 | 72.212 |
| 2552.5449999999996 | 72.222 |
| 2553.831 | 72.169 |
| 2555.117 | 72.185 |
| 2556.403 | 72.2 |
| 2557.689 | 72.207 |
| 2558.9750000000004 | 72.227 |
| 2560.261 | 72.255 |
| 2561.547 | 72.209 |
| 2562.8320000000003 | 72.183 |
| 2564.118 | 72.199 |
| 2565.404 | 72.146 |
| 2566.69 | 72.178 |
| 2567.9759999999997 | 72.203 |
| 2569.262 | 72.181 |
| 2570.5480000000002 | 72.12 |
| 2571.834 | 72.187 |
| 2573.12 | 72.205 |
| 2574.4060000000004 | 72.075 |
| 2575.692 | 72.159 |
| 2576.978 | 72.207 |
| 2578.2630000000004 | 72.154 |
| 2579.549 | 72.214 |
| 2580.835 | 72.234 |
| 2582.121 | 72.169 |
| 2583.4069999999997 | 72.248 |
| 2584.693 | 72.157 |
| 2585.979 | 72.179 |
| 2587.265 | 72.215 |
| 2588.551 | 72.144 |
| 2589.837 | 72.155 |
| 2591.123 | 72.195 |
| 2592.409 | 72.218 |
| 2593.694 | 72.266 |
| 2594.98 | 72.399 |
| 2596.266 | 72.175 |
| 2597.5519999999997 | 72.127 |
| 2598.838 | 72.148 |
| 2600.1240000000003 | 72.155 |
| 2601.41 | 72.156 |
| 2602.696 | 72.176 |
| 2603.982 | 72.209 |
| 2605.268 | 72.178 |
| 2606.554 | 72.051 |
| 2607.84 | 72.059 |
| 2609.125 | 72.159 |
| 2610.411 | 72.15 |
| 2611.697 | 72.18 |
| 2612.9829999999997 | 72.189 |
| 2614.2690000000002 | 72.152 |
| 2615.5550000000003 | 72.209 |
| 2616.841 | 72.216 |
| 2618.127 | 72.03 |
| 2619.413 | 72.149 |
| 2620.699 | 72.142 |
| 2621.985 | 72.118 |
| 2623.2709999999997 | 72.189 |
| 2624.556 | 72.211 |
| 2625.842 | 72.25 |
| 2627.1279999999997 | 72.184 |
| 2628.4139999999998 | 72.163 |
| 2629.7000000000003 | 72.239 |
| 2630.986 | 72.131 |
| 2632.272 | 72.108 |
| 2633.558 | 72.165 |
| 2634.844 | 72.127 |
| 2636.13 | 72.188 |
| 2637.416 | 72.2 |
| 2638.7019999999998 | 72.186 |
| 2639.987 | 72.208 |
| 2641.273 | 72.209 |
| 2642.5589999999997 | 72.164 |
| 2643.845 | 72.189 |
| 2645.1310000000003 | 72.201 |
| 2646.417 | 72.087 |
| 2647.703 | 72.146 |
| 2648.989 | 72.208 |
| 2650.275 | 72.224 |
| 2651.561 | 72.234 |
| 2652.8469999999998 | 72.154 |
| 2654.133 | 72.167 |
| 2655.418 | 72.202 |
| 2656.704 | 72.165 |
| 2657.99 | 72.21 |
| 2659.2760000000003 | 72.232 |
| 2660.562 | 72.137 |
| 2661.848 | 72.149 |
| 2663.134 | 72.167 |
| 2664.4199999999996 | 72.235 |
| 2665.706 | 72.185 |
| 2666.992 | 72.112 |
| 2668.278 | 72.077 |
| 2669.564 | 72.178 |
| 2670.849 | 72.174 |
| 2672.1349999999998 | 72.064 |
| 2673.421 | 72.04 |
| 2674.7070000000003 | 72.013 |
| 2675.993 | 72.004 |
| 2677.279 | 71.954 |
| 2678.565 | 71.955 |
| 2679.851 | 71.951 |
| 2681.137 | 72.002 |
| 2682.423 | 72.071 |
| 2683.709 | 72.051 |
| 2684.995 | 72.035 |
| 2686.281 | 72.041 |
| 2687.566 | 72.042 |
| 2688.852 | 72.094 |
| 2690.138 | 72.115 |
| 2691.424 | 72.172 |
| 2692.71 | 72.205 |
| 2693.9959999999996 | 72.158 |
| 2695.282 | 72.043 |
| 2696.568 | 72.024 |
| 2697.854 | 72.077 |
| 2699.14 | 72.101 |
| 2700.4260000000004 | 72.134 |
| 2701.712 | 72.101 |
| 2702.997 | 72.087 |
| 2704.2830000000004 | 72.125 |
| 2705.569 | 72.101 |
| 2706.855 | 72.104 |
| 2708.141 | 72.126 |
| 2709.4269999999997 | 72.048 |
| 2710.713 | 71.937 |
| 2711.9990000000003 | 71.936 |
| 2713.285 | 72.074 |
| 2714.571 | 72.136 |
| 2715.857 | 72.174 |
| 2717.143 | 72.188 |
| 2718.428 | 72.14 |
| 2719.7140000000004 | 72.181 |
| 2721.0 | 72.074 |
| 2722.286 | 72.043 |
| 2723.5719999999997 | 72.173 |
| 2724.8579999999997 | 72.116 |
| 2726.1440000000002 | 72.051 |
| 2727.43 | 72.136 |
| 2728.716 | 72.189 |
| 2730.002 | 72.193 |
| 2731.288 | 72.165 |
| 2732.574 | 72.133 |
| 2733.859 | 72.158 |
| 2735.145 | 72.138 |
| 2736.431 | 72.128 |
| 2737.717 | 72.196 |
| 2739.0029999999997 | 72.125 |
| 2740.289 | 71.974 |
| 2741.5750000000003 | 72.002 |
| 2742.861 | 72.012 |
| 2744.147 | 72.107 |
| 2745.433 | 72.137 |
| 2746.719 | 72.136 |
| 2748.005 | 72.151 |
| 2749.29 | 72.13 |
| 2750.576 | 72.137 |
| 2751.862 | 72.102 |
| 2753.148 | 72.073 |
| 2754.4339999999997 | 72.114 |
| 2755.7200000000003 | 72.021 |
| 2757.006 | 71.952 |
| 2758.292 | 71.996 |
| 2759.578 | 72.038 |
| 2760.864 | 72.061 |
| 2762.15 | 72.051 |
| 2763.436 | 72.017 |
| 2764.721 | 72.014 |
| 2766.007 | 72.05 |
| 2767.293 | 72.045 |
| 2768.5789999999997 | 72.026 |
| 2769.865 | 72.072 |
| 2771.1510000000003 | 72.051 |
| 2772.437 | 71.996 |
| 2773.723 | 72.007 |
| 2775.009 | 72.046 |
| 2776.295 | 72.035 |
| 2777.581 | 71.984 |
| 2778.867 | 71.963 |
| 2780.152 | 72.008 |
| 2781.438 | 72.005 |
| 2782.724 | 71.973 |
| 2784.0099999999998 | 71.984 |
| 2785.2960000000003 | 72.038 |
| 2786.5820000000003 | 72.037 |
| 2787.868 | 71.918 |
| 2789.154 | 71.902 |
| 2790.4399999999996 | 71.974 |
| 2791.726 | 72.014 |
| 2793.012 | 72.039 |
| 2794.298 | 72.052 |
| 2795.583 | 72.062 |
| 2796.869 | 72.057 |
| 2798.1549999999997 | 72.05 |
| 2799.441 | 72.062 |
| 2800.7270000000003 | 72.064 |
| 2802.013 | 72.049 |
| 2803.299 | 71.985 |
| 2804.585 | 71.915 |
| 2805.8709999999996 | 71.959 |
| 2807.157 | 71.993 |
| 2808.443 | 72.008 |
| 2809.729 | 72.021 |
| 2811.014 | 72.045 |
| 2812.3 | 72.054 |
| 2813.586 | 72.055 |
| 2814.872 | 72.015 |
| 2816.1580000000004 | 71.987 |
| 2817.444 | 72.021 |
| 2818.73 | 72.011 |
| 2820.016 | 71.952 |
| 2821.302 | 71.919 |
| 2822.588 | 71.943 |
| 2823.874 | 71.994 |
| 2825.16 | 72.026 |
| 2826.445 | 72.021 |
| 2827.7309999999998 | 71.989 |
| 2829.017 | 71.985 |
| 2830.303 | 72.023 |
| 2831.589 | 72.025 |
| 2832.875 | 71.997 |
| 2834.161 | 71.962 |
| 2835.4469999999997 | 71.941 |
| 2836.733 | 71.944 |
| 2838.0190000000002 | 71.924 |
| 2839.305 | 71.922 |
| 2840.591 | 71.968 |
| 2841.876 | 71.98 |
| 2843.162 | 71.978 |
| 2844.448 | 71.98 |
| 2845.7340000000004 | 71.967 |
| 2847.02 | 71.96 |
| 2848.306 | 71.964 |
| 2849.592 | 71.941 |
| 2850.8779999999997 | 71.934 |
| 2852.164 | 71.951 |
| 2853.45 | 71.929 |
| 2854.736 | 71.884 |
| 2856.022 | 71.889 |
| 2857.3070000000002 | 71.92 |
| 2858.593 | 71.931 |
| 2859.879 | 71.923 |
| 2861.165 | 71.915 |
| 2862.451 | 71.924 |
| 2863.737 | 71.936 |
| 2865.0229999999997 | 71.938 |
| 2866.309 | 71.921 |
| 2867.5950000000003 | 71.9 |
| 2868.881 | 71.909 |
| 2870.167 | 71.922 |
| 2871.453 | 71.914 |
| 2872.738 | 71.886 |
| 2874.024 | 71.881 |
| 2875.31 | 71.899 |
| 2876.596 | 71.908 |
| 2877.882 | 71.896 |
| 2879.168 | 71.894 |
| 2880.4539999999997 | 71.903 |
| 2881.7400000000002 | 71.897 |
| 2883.0260000000003 | 71.887 |
| 2884.312 | 71.879 |
| 2885.598 | 71.875 |
| 2886.8839999999996 | 71.88 |
| 2888.169 | 71.869 |
| 2889.455 | 71.858 |
| 2890.741 | 71.866 |
| 2892.027 | 71.88 |
| 2893.313 | 71.883 |
| 2894.5989999999997 | 71.877 |
| 2895.8849999999998 | 71.872 |
| 2897.1710000000003 | 71.874 |
| 2898.457 | 71.876 |
| 2899.743 | 71.861 |
| 2901.029 | 71.825 |
| 2902.315 | 71.823 |
| 2903.6 | 71.846 |
| 2904.886 | 71.84 |
| 2906.172 | 71.833 |
| 2907.458 | 71.839 |
| 2908.744 | 71.837 |
| 2910.0299999999997 | 71.832 |
| 2911.316 | 71.83 |
| 2912.6020000000003 | 71.83 |
| 2913.888 | 71.831 |
| 2915.174 | 71.83 |
| 2916.46 | 71.829 |
| 2917.746 | 71.83 |
| 2919.031 | 71.834 |
| 2920.317 | 71.832 |
| 2921.603 | 71.818 |
| 2922.889 | 71.799 |
| 2924.175 | 71.792 |
| 2925.461 | 71.808 |
| 2926.7470000000003 | 71.821 |
| 2928.033 | 71.818 |
| 2929.319 | 71.813 |
| 2930.605 | 71.812 |
| 2931.8909999999996 | 71.811 |
| 2933.177 | 71.808 |
| 2934.462 | 71.805 |
| 2935.7479999999996 | 71.804 |
| 2937.034 | 71.801 |
| 2938.32 | 71.793 |
| 2939.6059999999998 | 71.788 |
| 2940.892 | 71.794 |
| 2942.1780000000003 | 71.8 |
| 2943.464 | 71.79 |
| 2944.75 | 71.784 |
| 2946.036 | 71.787 |
| 2947.322 | 71.771 |
| 2948.608 | 71.76 |
| 2949.893 | 71.771 |
| 2951.179 | 71.779 |
| 2952.465 | 71.777 |
| 2953.751 | 71.769 |
| 2955.037 | 71.762 |
| 2956.323 | 71.765 |
| 2957.6090000000004 | 71.771 |
| 2958.895 | 71.765 |
| 2960.181 | 71.757 |
| 2961.4669999999996 | 71.754 |
| 2962.753 | 71.753 |
| 2964.039 | 71.753 |
| 2965.324 | 71.755 |
| 2966.61 | 71.755 |
| 2967.896 | 71.754 |
| 2969.182 | 71.747 |
| 2970.468 | 71.735 |
| 2971.754 | 71.727 |
| 2973.04 | 71.726 |
| 2974.326 | 71.731 |
| 2975.612 | 71.738 |
| 2976.8979999999997 | 71.739 |
| 2978.184 | 71.733 |
| 2979.4700000000003 | 71.728 |
| 2980.7549999999997 | 71.726 |
| 2982.041 | 71.727 |
| 2983.327 | 71.73 |
| 2984.613 | 71.734 |
| 2985.899 | 71.731 |
| 2987.1850000000004 | 71.724 |
| 2988.471 | 71.719 |
| 2989.757 | 71.718 |
| 2991.043 | 71.716 |
| 2992.3289999999997 | 71.714 |
| 2993.6150000000002 | 71.717 |
| 2994.901 | 71.72 |
| 2996.1859999999997 | 71.714 |
| 2997.472 | 71.698 |
| 2998.758 | 71.689 |
| 3000.044 | 71.687 |
| 3001.33 | 71.685 |
| 3002.616 | 71.682 |
| 3003.902 | 71.677 |
| 3005.188 | 71.671 |
| 3006.4739999999997 | 71.661 |
| 3007.76 | 71.653 |
| 3009.0460000000003 | 71.647 |
| 3010.332 | 71.644 |
| 3011.617 | 71.641 |
| 3012.9030000000002 | 71.631 |
| 3014.189 | 71.618 |
| 3015.475 | 71.61 |
| 3016.761 | 71.603 |
| 3018.047 | 71.587 |
| 3019.333 | 71.571 |
| 3020.619 | 71.563 |
| 3021.9049999999997 | 71.548 |
| 3023.1910000000003 | 71.527 |
| 3024.477 | 71.512 |
| 3025.763 | 71.492 |
| 3027.0480000000002 | 71.456 |
| 3028.3340000000003 | 71.412 |
| 3029.62 | 71.371 |
| 3030.906 | 71.325 |
| 3032.192 | 71.269 |
| 3033.478 | 71.205 |
| 3034.764 | 71.132 |
| 3036.0499999999997 | 71.042 |
| 3037.336 | 70.923 |
| 3038.6220000000003 | 70.777 |
| 3039.908 | 70.601 |
| 3041.194 | 70.391 |
| 3042.4790000000003 | 70.134 |
| 3043.765 | 69.827 |
| 3045.051 | 69.462 |
| 3046.337 | 69.054 |
| 3047.623 | 68.646 |
| 3048.909 | 68.287 |
| 3050.195 | 68.033 |
| 3051.4809999999998 | 67.976 |
| 3052.767 | 68.111 |
| 3054.0530000000003 | 68.413 |
| 3055.339 | 68.812 |
| 3056.625 | 69.237 |
| 3057.9109999999996 | 69.63 |
| 3059.196 | 69.974 |
| 3060.482 | 70.259 |
| 3061.768 | 70.497 |
| 3063.054 | 70.695 |
| 3064.34 | 70.853 |
| 3065.6259999999997 | 70.983 |
| 3066.912 | 71.093 |
| 3068.1980000000003 | 71.19 |
| 3069.484 | 71.272 |
| 3070.77 | 71.344 |
| 3072.056 | 71.402 |
| 3073.3419999999996 | 71.44 |
| 3074.627 | 71.479 |
| 3075.913 | 71.522 |
| 3077.1989999999996 | 71.561 |
| 3078.485 | 71.598 |
| 3079.771 | 71.629 |
| 3081.057 | 71.644 |
| 3082.343 | 71.648 |
| 3083.6290000000004 | 71.665 |
| 3084.915 | 71.689 |
| 3086.201 | 71.702 |
| 3087.487 | 71.713 |
| 3088.773 | 71.731 |
| 3090.058 | 71.748 |
| 3091.344 | 71.764 |
| 3092.63 | 71.776 |
| 3093.916 | 71.781 |
| 3095.202 | 71.784 |
| 3096.488 | 71.79 |
| 3097.774 | 71.795 |
| 3099.06 | 71.795 |
| 3100.346 | 71.801 |
| 3101.632 | 71.813 |
| 3102.9179999999997 | 71.822 |
| 3104.204 | 71.827 |
| 3105.489 | 71.829 |
| 3106.7749999999996 | 71.832 |
| 3108.061 | 71.838 |
| 3109.347 | 71.843 |
| 3110.633 | 71.848 |
| 3111.919 | 71.848 |
| 3113.205 | 71.853 |
| 3114.491 | 71.861 |
| 3115.777 | 71.862 |
| 3117.063 | 71.865 |
| 3118.3489999999997 | 71.876 |
| 3119.635 | 71.883 |
| 3120.92 | 71.886 |
| 3122.2059999999997 | 71.889 |
| 3123.492 | 71.888 |
| 3124.7780000000002 | 71.885 |
| 3126.064 | 71.885 |
| 3127.35 | 71.883 |
| 3128.6360000000004 | 71.883 |
| 3129.922 | 71.89 |
| 3131.208 | 71.901 |
| 3132.4939999999997 | 71.91 |
| 3133.7799999999997 | 71.911 |
| 3135.0660000000003 | 71.912 |
| 3136.351 | 71.918 |
| 3137.6369999999997 | 71.92 |
| 3138.9230000000002 | 71.915 |
| 3140.209 | 71.911 |
| 3141.495 | 71.914 |
| 3142.781 | 71.922 |
| 3144.067 | 71.928 |
| 3145.353 | 71.929 |
| 3146.639 | 71.925 |
| 3147.9249999999997 | 71.926 |
| 3149.2110000000002 | 71.934 |
| 3150.4970000000003 | 71.941 |
| 3151.7819999999997 | 71.947 |
| 3153.068 | 71.949 |
| 3154.3540000000003 | 71.949 |
| 3155.64 | 71.951 |
| 3156.926 | 71.954 |
| 3158.212 | 71.96 |
| 3159.498 | 71.966 |
| 3160.784 | 71.97 |
| 3162.0699999999997 | 71.971 |
| 3163.3559999999998 | 71.971 |
| 3164.6420000000003 | 71.976 |
| 3165.928 | 71.983 |
| 3167.2129999999997 | 71.991 |
| 3168.4990000000003 | 72.002 |
| 3169.785 | 72.011 |
| 3171.071 | 72.015 |
| 3172.357 | 72.017 |
| 3173.643 | 72.019 |
| 3174.929 | 72.02 |
| 3176.215 | 72.02 |
| 3177.5009999999997 | 72.02 |
| 3178.787 | 72.021 |
| 3180.0730000000003 | 72.022 |
| 3181.359 | 72.027 |
| 3182.644 | 72.036 |
| 3183.9300000000003 | 72.046 |
| 3185.216 | 72.054 |
| 3186.502 | 72.056 |
| 3187.788 | 72.05 |
| 3189.074 | 72.042 |
| 3190.36 | 72.04 |
| 3191.646 | 72.039 |
| 3192.932 | 72.045 |
| 3194.218 | 72.059 |
| 3195.504 | 72.067 |
| 3196.79 | 72.066 |
| 3198.075 | 72.058 |
| 3199.3610000000003 | 72.056 |
| 3200.647 | 72.065 |
| 3201.933 | 72.071 |
| 3203.2189999999996 | 72.075 |
| 3204.505 | 72.087 |
| 3205.791 | 72.098 |
| 3207.0769999999998 | 72.098 |
| 3208.363 | 72.096 |
| 3209.6490000000003 | 72.094 |
| 3210.935 | 72.094 |
| 3212.221 | 72.093 |
| 3213.5060000000003 | 72.091 |
| 3214.792 | 72.095 |
| 3216.078 | 72.106 |
| 3217.364 | 72.114 |
| 3218.6499999999996 | 72.113 |
| 3219.936 | 72.104 |
| 3221.222 | 72.095 |
| 3222.508 | 72.09 |
| 3223.794 | 72.095 |
| 3225.0800000000004 | 72.106 |
| 3226.366 | 72.113 |
| 3227.652 | 72.112 |
| 3228.9370000000004 | 72.106 |
| 3230.223 | 72.096 |
| 3231.509 | 72.093 |
| 3232.795 | 72.102 |
| 3234.081 | 72.119 |
| 3235.367 | 72.132 |
| 3236.653 | 72.136 |
| 3237.939 | 72.133 |
| 3239.225 | 72.134 |
| 3240.511 | 72.136 |
| 3241.797 | 72.139 |
| 3243.083 | 72.143 |
| 3244.368 | 72.143 |
| 3245.654 | 72.142 |
| 3246.94 | 72.14 |
| 3248.2259999999997 | 72.143 |
| 3249.512 | 72.148 |
| 3250.7980000000002 | 72.151 |
| 3252.084 | 72.148 |
| 3253.37 | 72.144 |
| 3254.6560000000004 | 72.143 |
| 3255.942 | 72.145 |
| 3257.228 | 72.145 |
| 3258.514 | 72.147 |
| 3259.799 | 72.153 |
| 3261.085 | 72.155 |
| 3262.371 | 72.149 |
| 3263.6569999999997 | 72.145 |
| 3264.943 | 72.146 |
| 3266.2290000000003 | 72.149 |
| 3267.515 | 72.151 |
| 3268.801 | 72.159 |
| 3270.087 | 72.17 |
| 3271.373 | 72.176 |
| 3272.659 | 72.176 |
| 3273.9449999999997 | 72.18 |
| 3275.23 | 72.185 |
| 3276.516 | 72.193 |
| 3277.8019999999997 | 72.201 |
| 3279.0879999999997 | 72.201 |
| 3280.3740000000003 | 72.198 |
| 3281.66 | 72.203 |
| 3282.946 | 72.214 |
| 3284.232 | 72.224 |
| 3285.518 | 72.229 |
| 3286.804 | 72.232 |
| 3288.09 | 72.233 |
| 3289.3759999999997 | 72.228 |
| 3290.661 | 72.223 |
| 3291.947 | 72.221 |
| 3293.2329999999997 | 72.225 |
| 3294.5190000000002 | 72.23 |
| 3295.8050000000003 | 72.231 |
| 3297.091 | 72.228 |
| 3298.377 | 72.221 |
| 3299.663 | 72.216 |
| 3300.949 | 72.221 |
| 3302.235 | 72.225 |
| 3303.5209999999997 | 72.226 |
| 3304.807 | 72.229 |
| 3306.092 | 72.235 |
| 3307.3779999999997 | 72.236 |
| 3308.6639999999998 | 72.235 |
| 3309.9500000000003 | 72.236 |
| 3311.236 | 72.245 |
| 3312.522 | 72.256 |
| 3313.808 | 72.264 |
| 3315.094 | 72.269 |
| 3316.38 | 72.272 |
| 3317.666 | 72.277 |
| 3318.9519999999998 | 72.282 |
| 3320.238 | 72.286 |
| 3321.523 | 72.288 |
| 3322.8089999999997 | 72.287 |
| 3324.095 | 72.286 |
| 3325.3810000000003 | 72.285 |
| 3326.667 | 72.281 |
| 3327.953 | 72.28 |
| 3329.239 | 72.283 |
| 3330.525 | 72.288 |
| 3331.811 | 72.292 |
| 3333.0969999999998 | 72.299 |
| 3334.383 | 72.309 |
| 3335.6690000000003 | 72.319 |
| 3336.954 | 72.322 |
| 3338.24 | 72.316 |
| 3339.5260000000003 | 72.311 |
| 3340.812 | 72.312 |
| 3342.098 | 72.313 |
| 3343.384 | 72.306 |
| 3344.6699999999996 | 72.296 |
| 3345.956 | 72.289 |
| 3347.242 | 72.284 |
| 3348.528 | 72.282 |
| 3349.814 | 72.285 |
| 3351.1000000000004 | 72.29 |
| 3352.3849999999998 | 72.298 |
| 3353.671 | 72.31 |
| 3354.9570000000003 | 72.322 |
| 3356.243 | 72.327 |
| 3357.529 | 72.323 |
| 3358.815 | 72.316 |
| 3360.1009999999997 | 72.312 |
| 3361.387 | 72.311 |
| 3362.6730000000002 | 72.306 |
| 3363.959 | 72.298 |
| 3365.245 | 72.291 |
| 3366.531 | 72.286 |
| 3367.816 | 72.282 |
| 3369.102 | 72.276 |
| 3370.3880000000004 | 72.269 |
| 3371.674 | 72.263 |
| 3372.96 | 72.262 |
| 3374.2459999999996 | 72.263 |
| 3375.532 | 72.261 |
| 3376.818 | 72.256 |
| 3378.104 | 72.252 |
| 3379.39 | 72.251 |
| 3380.676 | 72.25 |
| 3381.962 | 72.251 |
| 3383.247 | 72.257 |
| 3384.533 | 72.268 |
| 3385.819 | 72.281 |
| 3387.105 | 72.288 |
| 3388.391 | 72.29 |
| 3389.6769999999997 | 72.294 |
| 3390.963 | 72.301 |
| 3392.2490000000003 | 72.309 |
| 3393.535 | 72.313 |
| 3394.821 | 72.312 |
| 3396.1070000000004 | 72.307 |
| 3397.393 | 72.3 |
| 3398.678 | 72.286 |
| 3399.9640000000004 | 72.271 |
| 3401.25 | 72.261 |
| 3402.536 | 72.255 |
| 3403.822 | 72.25 |
| 3405.1079999999997 | 72.247 |
| 3406.3940000000002 | 72.246 |
| 3407.68 | 72.243 |
| 3408.966 | 72.238 |
| 3410.252 | 72.235 |
| 3411.538 | 72.238 |
| 3412.824 | 72.242 |
| 3414.109 | 72.242 |
| 3415.395 | 72.236 |
| 3416.681 | 72.226 |
| 3417.967 | 72.218 |
| 3419.2529999999997 | 72.218 |
| 3420.539 | 72.221 |
| 3421.8250000000003 | 72.224 |
| 3423.111 | 72.228 |
| 3424.397 | 72.239 |
| 3425.683 | 72.257 |
| 3426.969 | 72.274 |
| 3428.255 | 72.286 |
| 3429.54 | 72.295 |
| 3430.826 | 72.307 |
| 3432.112 | 72.324 |
| 3433.398 | 72.339 |
| 3434.6839999999997 | 72.349 |
| 3435.9700000000003 | 72.356 |
| 3437.2560000000003 | 72.36 |
| 3438.542 | 72.362 |
| 3439.828 | 72.364 |
| 3441.1139999999996 | 72.369 |
| 3442.4 | 72.38 |
| 3443.686 | 72.388 |
| 3444.9719999999998 | 72.389 |
| 3446.257 | 72.387 |
| 3447.543 | 72.389 |
| 3448.8289999999997 | 72.394 |
| 3450.115 | 72.404 |
| 3451.4010000000003 | 72.416 |
| 3452.687 | 72.427 |
| 3453.973 | 72.432 |
| 3455.259 | 72.432 |
| 3456.545 | 72.43 |
| 3457.831 | 72.429 |
| 3459.117 | 72.429 |
| 3460.403 | 72.431 |
| 3461.688 | 72.435 |
| 3462.974 | 72.44 |
| 3464.2599999999998 | 72.446 |
| 3465.546 | 72.452 |
| 3466.8320000000003 | 72.455 |
| 3468.118 | 72.456 |
| 3469.404 | 72.456 |
| 3470.69 | 72.455 |
| 3471.976 | 72.454 |
| 3473.262 | 72.453 |
| 3474.548 | 72.454 |
| 3475.834 | 72.456 |
| 3477.119 | 72.459 |
| 3478.4049999999997 | 72.465 |
| 3479.691 | 72.471 |
| 3480.9770000000003 | 72.473 |
| 3482.263 | 72.467 |
| 3483.549 | 72.457 |
| 3484.835 | 72.449 |
| 3486.1209999999996 | 72.446 |
| 3487.407 | 72.445 |
| 3488.693 | 72.443 |
| 3489.979 | 72.443 |
| 3491.265 | 72.441 |
| 3492.55 | 72.438 |
| 3493.836 | 72.436 |
| 3495.122 | 72.441 |
| 3496.4080000000004 | 72.448 |
| 3497.694 | 72.449 |
| 3498.98 | 72.444 |
| 3500.266 | 72.441 |
| 3501.552 | 72.443 |
| 3502.838 | 72.445 |
| 3504.124 | 72.445 |
| 3505.41 | 72.445 |
| 3506.696 | 72.446 |
| 3507.981 | 72.447 |
| 3509.267 | 72.452 |
| 3510.553 | 72.462 |
| 3511.839 | 72.475 |
| 3513.125 | 72.485 |
| 3514.411 | 72.493 |
| 3515.6969999999997 | 72.501 |
| 3516.983 | 72.51 |
| 3518.2690000000002 | 72.521 |
| 3519.555 | 72.535 |
| 3520.841 | 72.551 |
| 3522.127 | 72.565 |
| 3523.412 | 72.573 |
| 3524.698 | 72.574 |
| 3525.984 | 72.574 |
| 3527.27 | 72.577 |
| 3528.556 | 72.58 |
| 3529.842 | 72.58 |
| 3531.1279999999997 | 72.578 |
| 3532.414 | 72.575 |
| 3533.7000000000003 | 72.573 |
| 3534.986 | 72.575 |
| 3536.272 | 72.58 |
| 3537.558 | 72.584 |
| 3538.843 | 72.586 |
| 3540.129 | 72.59 |
| 3541.4150000000004 | 72.593 |
| 3542.701 | 72.595 |
| 3543.987 | 72.595 |
| 3545.2729999999997 | 72.598 |
| 3546.5589999999997 | 72.604 |
| 3547.8450000000003 | 72.609 |
| 3549.131 | 72.613 |
| 3550.417 | 72.613 |
| 3551.703 | 72.611 |
| 3552.989 | 72.612 |
| 3554.274 | 72.618 |
| 3555.56 | 72.625 |
| 3556.846 | 72.631 |
| 3558.132 | 72.636 |
| 3559.418 | 72.637 |
| 3560.7039999999997 | 72.635 |
| 3561.9900000000002 | 72.633 |
| 3563.2760000000003 | 72.632 |
| 3564.562 | 72.632 |
| 3565.848 | 72.632 |
| 3567.134 | 72.634 |
| 3568.42 | 72.637 |
| 3569.705 | 72.642 |
| 3570.991 | 72.646 |
| 3572.277 | 72.651 |
| 3573.563 | 72.656 |
| 3574.849 | 72.658 |
| 3576.1349999999998 | 72.66 |
| 3577.4210000000003 | 72.663 |
| 3578.707 | 72.665 |
| 3579.993 | 72.666 |
| 3581.279 | 72.667 |
| 3582.565 | 72.669 |
| 3583.851 | 72.673 |
| 3585.136 | 72.676 |
| 3586.422 | 72.676 |
| 3587.708 | 72.671 |
| 3588.994 | 72.665 |
| 3590.2799999999997 | 72.663 |
| 3591.566 | 72.664 |
| 3592.8520000000003 | 72.667 |
| 3594.138 | 72.671 |
| 3595.424 | 72.674 |
| 3596.71 | 72.676 |
| 3597.996 | 72.677 |
| 3599.282 | 72.678 |
| 3600.567 | 72.681 |
| 3601.853 | 72.687 |
| 3603.139 | 72.695 |
| 3604.425 | 72.7 |
| 3605.711 | 72.701 |
| 3606.997 | 72.697 |
| 3608.2830000000004 | 72.691 |
| 3609.569 | 72.687 |
| 3610.855 | 72.687 |
| 3612.1409999999996 | 72.69 |
| 3613.427 | 72.691 |
| 3614.713 | 72.692 |
| 3615.998 | 72.693 |
| 3617.284 | 72.695 |
| 3618.57 | 72.698 |
| 3619.8559999999998 | 72.703 |
| 3621.142 | 72.707 |
| 3622.4280000000003 | 72.71 |
| 3623.714 | 72.711 |
| 3625.0 | 72.712 |
| 3626.286 | 72.713 |
| 3627.5719999999997 | 72.713 |
| 3628.858 | 72.712 |
| 3630.1440000000002 | 72.712 |
| 3631.4289999999996 | 72.715 |
| 3632.715 | 72.719 |
| 3634.001 | 72.725 |
| 3635.287 | 72.732 |
| 3636.573 | 72.737 |
| 3637.8590000000004 | 72.739 |
| 3639.145 | 72.741 |
| 3640.431 | 72.741 |
| 3641.7169999999996 | 72.738 |
| 3643.003 | 72.733 |
| 3644.289 | 72.73 |
| 3645.575 | 72.73 |
| 3646.86 | 72.732 |
| 3648.146 | 72.733 |
| 3649.432 | 72.735 |
| 3650.718 | 72.74 |
| 3652.004 | 72.746 |
| 3653.29 | 72.75 |
| 3654.576 | 72.75 |
| 3655.862 | 72.749 |
| 3657.1479999999997 | 72.748 |
| 3658.434 | 72.749 |
| 3659.7200000000003 | 72.75 |
| 3661.006 | 72.75 |
| 3662.291 | 72.749 |
| 3663.577 | 72.75 |
| 3664.863 | 72.755 |
| 3666.149 | 72.762 |
| 3667.435 | 72.77 |
| 3668.721 | 72.775 |
| 3670.007 | 72.774 |
| 3671.293 | 72.77 |
| 3672.5789999999997 | 72.768 |
| 3673.8650000000002 | 72.767 |
| 3675.151 | 72.765 |
| 3676.437 | 72.761 |
| 3677.722 | 72.76 |
| 3679.0080000000003 | 72.762 |
| 3680.294 | 72.764 |
| 3681.58 | 72.766 |
| 3682.866 | 72.767 |
| 3684.152 | 72.765 |
| 3685.438 | 72.763 |
| 3686.7239999999997 | 72.763 |
| 3688.0099999999998 | 72.767 |
| 3689.2960000000003 | 72.773 |
| 3690.582 | 72.778 |
| 3691.868 | 72.78 |
| 3693.1530000000002 | 72.779 |
| 3694.439 | 72.776 |
| 3695.725 | 72.775 |
| 3697.011 | 72.775 |
| 3698.297 | 72.777 |
| 3699.583 | 72.779 |
| 3700.869 | 72.781 |
| 3702.1549999999997 | 72.784 |
| 3703.4410000000003 | 72.787 |
| 3704.7270000000003 | 72.79 |
| 3706.013 | 72.792 |
| 3707.299 | 72.792 |
| 3708.5840000000003 | 72.792 |
| 3709.87 | 72.792 |
| 3711.156 | 72.792 |
| 3712.442 | 72.793 |
| 3713.728 | 72.794 |
| 3715.014 | 72.796 |
| 3716.2999999999997 | 72.798 |
| 3717.586 | 72.8 |
| 3718.8720000000003 | 72.8 |
| 3720.158 | 72.802 |
| 3721.444 | 72.804 |
| 3722.73 | 72.805 |
| 3724.015 | 72.805 |
| 3725.301 | 72.807 |
| 3726.587 | 72.81 |
| 3727.873 | 72.814 |
| 3729.159 | 72.819 |
| 3730.445 | 72.822 |
| 3731.7309999999998 | 72.824 |
| 3733.017 | 72.827 |
| 3734.3030000000003 | 72.829 |
| 3735.589 | 72.828 |
| 3736.875 | 72.824 |
| 3738.161 | 72.821 |
| 3739.446 | 72.82 |
| 3740.732 | 72.821 |
| 3742.018 | 72.821 |
| 3743.304 | 72.819 |
| 3744.59 | 72.819 |
| 3745.876 | 72.82 |
| 3747.162 | 72.822 |
| 3748.448 | 72.821 |
| 3749.734 | 72.82 |
| 3751.02 | 72.818 |
| 3752.306 | 72.818 |
| 3753.5919999999996 | 72.821 |
| 3754.877 | 72.825 |
| 3756.163 | 72.829 |
| 3757.4489999999996 | 72.829 |
| 3758.735 | 72.826 |
| 3760.021 | 72.822 |
| 3761.307 | 72.821 |
| 3762.593 | 72.823 |
| 3763.8790000000004 | 72.829 |
| 3765.165 | 72.833 |
| 3766.451 | 72.836 |
| 3767.737 | 72.836 |
| 3769.0229999999997 | 72.835 |
| 3770.308 | 72.833 |
| 3771.594 | 72.833 |
| 3772.8799999999997 | 72.834 |
| 3774.166 | 72.837 |
| 3775.452 | 72.838 |
| 3776.738 | 72.838 |
| 3778.024 | 72.837 |
| 3779.31 | 72.838 |
| 3780.596 | 72.838 |
| 3781.882 | 72.84 |
| 3783.1679999999997 | 72.843 |
| 3784.454 | 72.845 |
| 3785.739 | 72.847 |
| 3787.0249999999996 | 72.848 |
| 3788.311 | 72.851 |
| 3789.597 | 72.855 |
| 3790.883 | 72.857 |
| 3792.169 | 72.855 |
| 3793.455 | 72.852 |
| 3794.741 | 72.853 |
| 3796.027 | 72.858 |
| 3797.313 | 72.861 |
| 3798.5989999999997 | 72.857 |
| 3799.885 | 72.852 |
| 3801.17 | 72.849 |
| 3802.4559999999997 | 72.849 |
| 3803.742 | 72.852 |
| 3805.0280000000002 | 72.855 |
| 3806.314 | 72.857 |
| 3807.6 | 72.857 |
| 3808.8860000000004 | 72.857 |
| 3810.172 | 72.856 |
| 3811.458 | 72.854 |
| 3812.7439999999997 | 72.853 |
| 3814.0299999999997 | 72.853 |
| 3815.3160000000003 | 72.855 |
| 3816.601 | 72.858 |
| 3817.8869999999997 | 72.861 |
| 3819.1730000000002 | 72.864 |
| 3820.459 | 72.865 |
| 3821.745 | 72.865 |
| 3823.031 | 72.865 |
| 3824.317 | 72.864 |
| 3825.603 | 72.863 |
| 3826.889 | 72.861 |
| 3828.1749999999997 | 72.859 |
| 3829.461 | 72.858 |
| 3830.7470000000003 | 72.859 |
| 3832.033 | 72.859 |
| 3833.3179999999998 | 72.859 |
| 3834.6040000000003 | 72.859 |
| 3835.89 | 72.859 |
| 3837.176 | 72.859 |
| 3838.462 | 72.86 |
| 3839.748 | 72.859 |
| 3841.034 | 72.856 |
| 3842.32 | 72.854 |
| 3843.6059999999998 | 72.855 |
| 3844.8920000000003 | 72.858 |
| 3846.178 | 72.862 |
| 3847.464 | 72.864 |
| 3848.7490000000003 | 72.866 |
| 3850.0350000000003 | 72.865 |
| 3851.321 | 72.863 |
| 3852.607 | 72.86 |
| 3853.8929999999996 | 72.861 |
| 3855.179 | 72.864 |
| 3856.465 | 72.865 |
| 3857.7509999999997 | 72.863 |
| 3859.037 | 72.859 |
| 3860.3230000000003 | 72.856 |
| 3861.609 | 72.854 |
| 3862.895 | 72.855 |
| 3864.1800000000003 | 72.857 |
| 3865.466 | 72.859 |
| 3866.752 | 72.859 |
| 3868.038 | 72.858 |
| 3869.324 | 72.857 |
| 3870.61 | 72.856 |
| 3871.896 | 72.856 |
| 3873.182 | 72.857 |
| 3874.468 | 72.859 |
| 3875.7540000000004 | 72.861 |
| 3877.04 | 72.861 |
| 3878.326 | 72.859 |
| 3879.6110000000003 | 72.857 |
| 3880.897 | 72.857 |
| 3882.183 | 72.858 |
| 3883.469 | 72.859 |
| 3884.755 | 72.859 |
| 3886.041 | 72.858 |
| 3887.3269999999998 | 72.857 |
| 3888.613 | 72.857 |
| 3889.8990000000003 | 72.857 |
| 3891.185 | 72.858 |
| 3892.471 | 72.858 |
| 3893.757 | 72.858 |
| 3895.042 | 72.858 |
| 3896.328 | 72.858 |
| 3897.614 | 72.858 |
| 3898.8999999999996 | 72.858 |
| 3900.186 | 72.856 |
| 3901.472 | 72.855 |
| 3902.758 | 72.855 |
| 3904.044 | 72.856 |
| 3905.3300000000004 | 72.856 |
| 3906.616 | 72.855 |
| 3907.902 | 72.854 |
| 3909.188 | 72.854 |
| 3910.473 | 72.855 |
| 3911.759 | 72.856 |
| 3913.045 | 72.856 |
| 3914.3309999999997 | 72.856 |
| 3915.617 | 72.856 |
| 3916.9030000000002 | 72.857 |
| 3918.189 | 72.856 |
| 3919.475 | 72.854 |
| 3920.761 | 72.851 |
| 3922.047 | 72.848 |
| 3923.333 | 72.846 |
| 3924.6189999999997 | 72.845 |
| 3925.904 | 72.845 |
| 3927.19 | 72.845 |
| 3928.4759999999997 | 72.844 |
| 3929.762 | 72.844 |
| 3931.0480000000002 | 72.842 |
| 3932.334 | 72.84 |
| 3933.62 | 72.837 |
| 3934.906 | 72.836 |
| 3936.192 | 72.835 |
| 3937.478 | 72.836 |
| 3938.764 | 72.837 |
| 3940.0499999999997 | 72.837 |
| 3941.335 | 72.836 |
| 3942.621 | 72.834 |
| 3943.9069999999997 | 72.83 |
| 3945.193 | 72.825 |
| 3946.4790000000003 | 72.82 |
| 3947.765 | 72.818 |
| 3949.051 | 72.818 |
| 3950.337 | 72.817 |
| 3951.623 | 72.816 |
| 3952.909 | 72.816 |
| 3954.1949999999997 | 72.816 |
| 3955.4809999999998 | 72.817 |
| 3956.766 | 72.818 |
| 3958.0519999999997 | 72.817 |
| 3959.3379999999997 | 72.815 |
| 3960.6240000000003 | 72.814 |
| 3961.91 | 72.813 |
| 3963.196 | 72.813 |
| 3964.482 | 72.814 |
| 3965.768 | 72.814 |
| 3967.054 | 72.812 |
| 3968.34 | 72.806 |
| 3969.6259999999997 | 72.8 |
| 3970.9120000000003 | 72.795 |
| 3972.197 | 72.793 |
| 3973.4829999999997 | 72.792 |
| 3974.7690000000002 | 72.792 |
| 3976.0550000000003 | 72.792 |
| 3977.341 | 72.79 |
| 3978.627 | 72.788 |
| 3979.913 | 72.785 |
| 3981.199 | 72.783 |
| 3982.485 | 72.781 |
| 3983.7709999999997 | 72.779 |
| 3985.057 | 72.776 |
| 3986.3430000000003 | 72.774 |
| 3987.628 | 72.772 |
| 3988.9139999999998 | 72.77 |
| 3990.2000000000003 | 72.768 |
| 3991.486 | 72.765 |
| 3992.772 | 72.763 |
| 3994.058 | 72.761 |
| 3995.3439999999996 | 72.758 |
| 3996.63 | 72.756 |
| 3997.916 | 72.755 |
| 3999.2019999999998 | 72.756 |
| 4000.488 | 72.757 |
| 4001.7740000000003 | 72.756 |
| 4003.059 | 72.754 |
| 4004.345 | 72.751 |
| 4005.6310000000003 | 72.747 |
| 4006.9169999999995 | 72.745 |
| 4008.203 | 72.743 |
| 4009.4890000000005 | 72.741 |
| 4010.7749999999996 | 72.739 |
| 4012.061 | 72.737 |
| 4013.3470000000007 | 72.734 |
| 4014.633 | 72.731 |
| 4015.9190000000003 | 72.731 |
| 4017.2049999999995 | 72.732 |
| 4018.49 | 72.732 |
| 4019.7760000000003 | 72.731 |
| 4021.062 | 72.726 |
| 4022.348 | 72.722 |
| 4023.6340000000005 | 72.718 |
| 4024.9199999999996 | 72.715 |
| 4026.206 | 72.712 |
| 4027.4919999999997 | 72.709 |
| 4028.778 | 72.706 |
| 4030.0640000000003 | 72.702 |
| 4031.35 | 72.699 |
| 4032.636 | 72.694 |
| 4033.9210000000003 | 72.69 |
| 4035.207 | 72.688 |
| 4036.493 | 72.686 |
| 4037.7789999999995 | 72.684 |
| 4039.065 | 72.681 |
| 4040.351 | 72.678 |
| 4041.6369999999997 | 72.675 |
| 4042.9230000000002 | 72.67 |
| 4044.2090000000003 | 72.666 |
| 4045.495 | 72.661 |
| 4046.7810000000004 | 72.658 |
| 4048.0669999999996 | 72.655 |
| 4049.352 | 72.653 |
| 4050.6380000000004 | 72.651 |
| 4051.9239999999995 | 72.649 |
| 4053.21 | 72.647 |
| 4054.496 | 72.644 |
| 4055.7819999999997 | 72.642 |
| 4057.068 | 72.638 |
| 4058.3539999999994 | 72.633 |
| 4059.64 | 72.628 |
| 4060.9260000000004 | 72.622 |
| 4062.2119999999995 | 72.616 |
| 4063.498 | 72.611 |
| 4064.7830000000004 | 72.609 |
| 4066.0689999999995 | 72.608 |
| 4067.355 | 72.608 |
| 4068.6410000000005 | 72.605 |
| 4069.9269999999997 | 72.601 |
| 4071.213 | 72.596 |
| 4072.499 | 72.591 |
| 4073.785 | 72.585 |
| 4075.0710000000004 | 72.58 |
| 4076.357 | 72.575 |
| 4077.643 | 72.571 |
| 4078.9289999999996 | 72.567 |
| 4080.214 | 72.564 |
| 4081.5 | 72.561 |
| 4082.7859999999996 | 72.559 |
| 4084.072 | 72.558 |
| 4085.358 | 72.555 |
| 4086.644 | 72.551 |
| 4087.9300000000003 | 72.546 |
| 4089.2160000000003 | 72.54 |
| 4090.502 | 72.535 |
| 4091.788 | 72.531 |
| 4093.0739999999996 | 72.529 |
| 4094.36 | 72.528 |
| 4095.645 | 72.524 |
| 4096.931 | 72.518 |
| 4098.217 | 72.512 |
| 4099.503000000001 | 72.506 |
| 4100.789 | 72.5 |
| 4102.075 | 72.498 |
| 4103.361 | 72.496 |
| 4104.647 | 72.495 |
| 4105.933 | 72.494 |
| 4107.219 | 72.491 |
| 4108.505 | 72.487 |
| 4109.791 | 72.482 |
| 4111.076 | 72.477 |
| 4112.362 | 72.471 |
| 4113.648 | 72.465 |
| 4114.934 | 72.46 |
| 4116.22 | 72.457 |
| 4117.505999999999 | 72.454 |
| 4118.792 | 72.451 |
| 4120.078 | 72.448 |
| 4121.364 | 72.445 |
| 4122.650000000001 | 72.442 |
| 4123.936 | 72.439 |
| 4125.222 | 72.437 |
| 4126.5070000000005 | 72.433 |
| 4127.793 | 72.43 |
| 4129.079 | 72.425 |
| 4130.365000000001 | 72.421 |
| 4131.651 | 72.416 |
| 4132.937 | 72.412 |
| 4134.223000000001 | 72.408 |
| 4135.509 | 72.404 |
| 4136.795 | 72.4 |
| 4138.081 | 72.397 |
| 4139.367 | 72.394 |
| 4140.653 | 72.39 |
| 4141.938 | 72.385 |
| 4143.224 | 72.38 |
| 4144.51 | 72.375 |
| 4145.795999999999 | 72.371 |
| 4147.082 | 72.368 |
| 4148.3679999999995 | 72.366 |
| 4149.6539999999995 | 72.363 |
| 4150.9400000000005 | 72.359 |
| 4152.226 | 72.355 |
| 4153.512 | 72.35 |
| 4154.798000000001 | 72.348 |
| 4156.084 | 72.346 |
| 4157.369 | 72.344 |
| 4158.655000000001 | 72.342 |
| 4159.941 | 72.339 |
| 4161.227 | 72.335 |
| 4162.513 | 72.332 |
| 4163.799 | 72.329 |
| 4165.085 | 72.325 |
| 4166.371 | 72.321 |
| 4167.657 | 72.315 |
| 4168.942999999999 | 72.31 |
| 4170.229 | 72.305 |
| 4171.515 | 72.301 |
| 4172.799999999999 | 72.299 |
| 4174.086 | 72.298 |
| 4175.372 | 72.297 |
| 4176.657999999999 | 72.296 |
| 4177.944 | 72.294 |
| 4179.23 | 72.291 |
| 4180.516 | 72.287 |
| 4181.802000000001 | 72.284 |
| 4183.088 | 72.281 |
| 4184.374 | 72.278 |
| 4185.660000000001 | 72.273 |
| 4186.946 | 72.266 |
| 4188.231 | 72.255 |
| 4189.517000000001 | 72.239 |
| 4190.803 | 72.218 |
| 4192.089 | 72.193 |
| 4193.375 | 72.16 |
| 4194.661 | 72.121 |
| 4195.947 | 72.076 |
| 4197.233 | 72.026 |
| 4198.519 | 71.972 |
| 4199.804999999999 | 71.916 |
| 4201.091 | 71.857 |
| 4202.377 | 71.794 |
| 4203.661999999999 | 71.728 |
| 4204.948 | 71.659 |
| 4206.234 | 71.59 |
| 4207.5199999999995 | 71.518 |
| 4208.8060000000005 | 71.441 |
| 4210.092000000001 | 71.356 |
| 4211.378 | 71.266 |
| 4212.664 | 71.171 |
| 4213.95 | 71.071 |
| 4215.236 | 70.968 |
| 4216.522 | 70.86 |
| 4217.808 | 70.748 |
| 4219.094 | 70.633 |
| 4220.379 | 70.519 |
| 4221.665 | 70.406 |
| 4222.951 | 70.295 |
| 4224.236999999999 | 70.188 |
| 4225.523 | 70.09 |
| 4226.809 | 69.998 |
| 4228.094999999999 | 69.913 |
| 4229.381 | 69.828 |
| 4230.667 | 69.747 |
| 4231.9529999999995 | 69.678 |
| 4233.2390000000005 | 69.624 |
| 4234.525 | 69.594 |
| 4235.8099999999995 | 69.578 |
| 4237.0960000000005 | 69.573 |
| 4238.382 | 69.579 |
| 4239.668 | 69.599 |
| 4240.954000000001 | 69.632 |
| 4242.24 | 69.68 |
| 4243.526 | 69.747 |
| 4244.812 | 69.848 |
| 4246.098 | 69.959 |
| 4247.384 | 70.071 |
| 4248.67 | 70.177 |
| 4249.956 | 70.285 |
| 4251.241 | 70.404 |
| 4252.527 | 70.532 |
| 4253.813 | 70.668 |
| 4255.099 | 70.793 |
| 4256.385 | 70.889 |
| 4257.671 | 70.948 |
| 4258.956999999999 | 70.945 |
| 4260.243 | 70.862 |
| 4261.529 | 70.741 |
| 4262.815 | 70.597 |
| 4264.101000000001 | 70.462 |
| 4265.387 | 70.357 |
| 4266.672 | 70.275 |
| 4267.9580000000005 | 70.212 |
| 4269.244 | 70.175 |
| 4270.53 | 70.158 |
| 4271.816000000001 | 70.159 |
| 4273.102 | 70.178 |
| 4274.388 | 70.21 |
| 4275.674 | 70.235 |
| 4276.96 | 70.252 |
| 4278.246 | 70.255 |
| 4279.531999999999 | 70.258 |
| 4280.818 | 70.268 |
| 4282.103 | 70.285 |
| 4283.388999999999 | 70.303 |
| 4284.675 | 70.312 |
| 4285.961 | 70.313 |
| 4287.246999999999 | 70.306 |
| 4288.533 | 70.299 |
| 4289.8189999999995 | 70.299 |
| 4291.105 | 70.306 |
| 4292.3910000000005 | 70.327 |
| 4293.677 | 70.354 |
| 4294.963 | 70.385 |
| 4296.249000000001 | 70.416 |
| 4297.534 | 70.449 |
| 4298.82 | 70.483 |
| 4300.106000000001 | 70.515 |
| 4301.392 | 70.545 |
| 4302.678 | 70.57 |
| 4303.964 | 70.594 |
| 4305.25 | 70.618 |
| 4306.536 | 70.646 |
| 4307.822 | 70.681 |
| 4309.108 | 70.721 |
| 4310.393999999999 | 70.766 |
| 4311.68 | 70.812 |
| 4312.965 | 70.856 |
| 4314.250999999999 | 70.898 |
| 4315.537 | 70.938 |
| 4316.823 | 70.973 |
| 4318.1089999999995 | 71.004 |
| 4319.395 | 71.031 |
| 4320.6810000000005 | 71.049 |
| 4321.967 | 71.063 |
| 4323.253000000001 | 71.072 |
| 4324.539 | 71.078 |
| 4325.825 | 71.085 |
| 4327.111000000001 | 71.095 |
| 4328.396 | 71.108 |
| 4329.682 | 71.123 |
| 4330.968000000001 | 71.142 |
| 4332.254 | 71.164 |
| 4333.54 | 71.191 |
| 4334.826 | 71.219 |
| 4336.112 | 71.247 |
| 4337.398 | 71.272 |
| 4338.684 | 71.291 |
| 4339.97 | 71.306 |
| 4341.255999999999 | 71.316 |
| 4342.5419999999995 | 71.321 |
| 4343.827 | 71.324 |
| 4345.112999999999 | 71.326 |
| 4346.399 | 71.328 |
| 4347.685 | 71.333 |
| 4348.971 | 71.34 |
| 4350.257 | 71.348 |
| 4351.543000000001 | 71.357 |
| 4352.829 | 71.362 |
| 4354.115 | 71.365 |
| 4355.401 | 71.366 |
| 4356.687 | 71.367 |
| 4357.973 | 71.369 |
| 4359.258 | 71.373 |
| 4360.544 | 71.379 |
| 4361.83 | 71.385 |
| 4363.116 | 71.39 |
| 4364.402 | 71.393 |
| 4365.687999999999 | 71.395 |
| 4366.974 | 71.398 |
| 4368.26 | 71.401 |
| 4369.545999999999 | 71.407 |
| 4370.832 | 71.413 |
| 4372.118 | 71.419 |
| 4373.4039999999995 | 71.424 |
| 4374.689 | 71.427 |
| 4375.975 | 71.43 |
| 4377.2609999999995 | 71.429 |
| 4378.5470000000005 | 71.425 |
| 4379.833 | 71.42 |
| 4381.119 | 71.412 |
| 4382.405000000001 | 71.402 |
| 4383.691 | 71.391 |
| 4384.977 | 71.379 |
| 4386.263 | 71.366 |
| 4387.549 | 71.352 |
| 4388.835 | 71.339 |
| 4390.12 | 71.328 |
| 4391.406 | 71.318 |
| 4392.692 | 71.309 |
| 4393.978 | 71.301 |
| 4395.264 | 71.293 |
| 4396.55 | 71.283 |
| 4397.836 | 71.273 |
| 4399.122 | 71.263 |
| 4400.407999999999 | 71.253 |
| 4401.694 | 71.245 |
| 4402.9800000000005 | 71.236 |
| 4404.266 | 71.228 |
| 4405.551 | 71.218 |
| 4406.837 | 71.209 |
| 4408.123 | 71.201 |
| 4409.409000000001 | 71.194 |
| 4410.695 | 71.188 |
| 4411.981 | 71.183 |
| 4413.267 | 71.177 |
| 4414.553 | 71.172 |
| 4415.839 | 71.165 |
| 4417.125 | 71.158 |
| 4418.411 | 71.149 |
| 4419.697 | 71.14 |
| 4420.982 | 71.13 |
| 4422.268 | 71.122 |
| 4423.554 | 71.113 |
| 4424.839999999999 | 71.105 |
| 4426.126 | 71.096 |
| 4427.412 | 71.088 |
| 4428.697999999999 | 71.08 |
| 4429.984 | 71.072 |
| 4431.2699999999995 | 71.065 |
| 4432.556 | 71.058 |
| 4433.842000000001 | 71.051 |
| 4435.128 | 71.045 |
| 4436.413 | 71.038 |
| 4437.6990000000005 | 71.032 |
| 4438.985 | 71.026 |
| 4440.271 | 71.019 |
| 4441.557000000001 | 71.012 |
| 4442.843 | 71.005 |
| 4444.129 | 70.997 |
| 4445.415 | 70.989 |
| 4446.701 | 70.98 |
| 4447.987 | 70.97 |
| 4449.273 | 70.959 |
| 4450.559 | 70.949 |
| 4451.844 | 70.939 |
| 4453.13 | 70.929 |
| 4454.416 | 70.919 |
| 4455.701999999999 | 70.91 |
| 4456.988 | 70.9 |
| 4458.274 | 70.89 |
| 4459.5599999999995 | 70.88 |
| 4460.8460000000005 | 70.87 |
| 4462.1320000000005 | 70.861 |
| 4463.418 | 70.852 |
| 4464.704000000001 | 70.843 |
| 4465.99 | 70.832 |
| 4467.275 | 70.82 |
| 4468.561000000001 | 70.808 |
| 4469.847 | 70.795 |
| 4471.133 | 70.784 |
| 4472.419000000001 | 70.773 |
| 4473.705 | 70.765 |
| 4474.991 | 70.756 |
| 4476.277 | 70.747 |
| 4477.563 | 70.736 |
| 4478.849 | 70.724 |
| 4480.134999999999 | 70.71 |
| 4481.421 | 70.697 |
| 4482.706 | 70.685 |
| 4483.992 | 70.674 |
| 4485.278 | 70.663 |
| 4486.564 | 70.653 |
| 4487.849999999999 | 70.642 |
| 4489.136 | 70.631 |
| 4490.422 | 70.619 |
| 4491.708 | 70.606 |
| 4492.994000000001 | 70.594 |
| 4494.28 | 70.582 |
| 4495.566 | 70.571 |
| 4496.852 | 70.56 |
| 4498.137 | 70.549 |
| 4499.423 | 70.538 |
| 4500.709 | 70.527 |
| 4501.995 | 70.516 |
| 4503.281 | 70.506 |
| 4504.567 | 70.495 |
| 4505.853 | 70.483 |
| 4507.138999999999 | 70.471 |
| 4508.425 | 70.458 |
| 4509.711 | 70.444 |
| 4510.996999999999 | 70.431 |
| 4512.283 | 70.418 |
| 4513.568 | 70.404 |
| 4514.853999999999 | 70.39 |
| 4516.14 | 70.376 |
| 4517.426 | 70.363 |
| 4518.7119999999995 | 70.35 |
| 4519.9980000000005 | 70.338 |
| 4521.284 | 70.327 |
| 4522.57 | 70.315 |
| 4523.856000000001 | 70.304 |
| 4525.142 | 70.293 |
| 4526.428 | 70.28 |
| 4527.714 | 70.267 |
| 4528.999 | 70.253 |
| 4530.285 | 70.239 |
| 4531.571 | 70.226 |
| 4532.857 | 70.213 |
| 4534.143 | 70.201 |
| 4535.429 | 70.188 |
| 4536.715 | 70.175 |
| 4538.001 | 70.161 |
| 4539.287 | 70.147 |
| 4540.573 | 70.134 |
| 4541.8589999999995 | 70.122 |
| 4543.145 | 70.11 |
| 4544.43 | 70.098 |
| 4545.715999999999 | 70.085 |
| 4547.002 | 70.073 |
| 4548.2880000000005 | 70.059 |
| 4549.574 | 70.046 |
| 4550.860000000001 | 70.032 |
| 4552.146 | 70.019 |
| 4553.432 | 70.005 |
| 4554.718 | 69.991 |
| 4556.004 | 69.977 |
| 4557.29 | 69.963 |
| 4558.576 | 69.948 |
| 4559.861 | 69.935 |
| 4561.147 | 69.921 |
| 4562.433 | 69.907 |
| 4563.719 | 69.893 |
| 4565.005 | 69.878 |
| 4566.290999999999 | 69.862 |
| 4567.577 | 69.847 |
| 4568.863 | 69.832 |
| 4570.148999999999 | 69.819 |
| 4571.435 | 69.806 |
| 4572.721 | 69.793 |
| 4574.007 | 69.779 |
| 4575.292 | 69.764 |
| 4576.5779999999995 | 69.749 |
| 4577.864 | 69.735 |
| 4579.150000000001 | 69.72 |
| 4580.436 | 69.705 |
| 4581.722 | 69.691 |
| 4583.008000000001 | 69.676 |
| 4584.294 | 69.66 |
| 4585.58 | 69.644 |
| 4586.866 | 69.628 |
| 4588.152 | 69.611 |
| 4589.438 | 69.595 |
| 4590.724 | 69.579 |
| 4592.009 | 69.563 |
| 4593.295 | 69.548 |
| 4594.581 | 69.532 |
| 4595.867 | 69.517 |
| 4597.152999999999 | 69.502 |
| 4598.439 | 69.487 |
| 4599.725 | 69.471 |
| 4601.0109999999995 | 69.455 |
| 4602.2970000000005 | 69.438 |
| 4603.5830000000005 | 69.421 |
| 4604.869 | 69.405 |
| 4606.155000000001 | 69.388 |
| 4607.4400000000005 | 69.371 |
| 4608.726 | 69.353 |
| 4610.012000000001 | 69.336 |
| 4611.298 | 69.318 |
| 4612.584 | 69.302 |
| 4613.870000000001 | 69.286 |
| 4615.156 | 69.27 |
| 4616.442 | 69.253 |
| 4617.727999999999 | 69.235 |
| 4619.014 | 69.216 |
| 4620.3 | 69.198 |
| 4621.585999999999 | 69.179 |
| 4622.871 | 69.161 |
| 4624.157 | 69.143 |
| 4625.442999999999 | 69.126 |
| 4626.729 | 69.111 |
| 4628.015 | 69.095 |
| 4629.3009999999995 | 69.08 |
| 4630.587 | 69.064 |
| 4631.873 | 69.047 |
| 4633.159 | 69.03 |
| 4634.445000000001 | 69.012 |
| 4635.731 | 68.994 |
| 4637.017 | 68.976 |
| 4638.302000000001 | 68.957 |
| 4639.588 | 68.939 |
| 4640.874 | 68.92 |
| 4642.16 | 68.902 |
| 4643.446 | 68.884 |
| 4644.732 | 68.865 |
| 4646.018 | 68.847 |
| 4647.304 | 68.829 |
| 4648.59 | 68.81 |
| 4649.876 | 68.792 |
| 4651.162 | 68.773 |
| 4652.447999999999 | 68.755 |
| 4653.733 | 68.736 |
| 4655.019 | 68.717 |
| 4656.304999999999 | 68.697 |
| 4657.591 | 68.676 |
| 4658.877 | 68.655 |
| 4660.163 | 68.635 |
| 4661.4490000000005 | 68.614 |
| 4662.735 | 68.595 |
| 4664.021 | 68.575 |
| 4665.307000000001 | 68.556 |
| 4666.593 | 68.536 |
| 4667.879 | 68.516 |
| 4669.164000000001 | 68.496 |
| 4670.45 | 68.477 |
| 4671.736 | 68.458 |
| 4673.022 | 68.44 |
| 4674.308 | 68.42 |
| 4675.594 | 68.4 |
| 4676.88 | 68.379 |
| 4678.166 | 68.358 |
| 4679.452 | 68.336 |
| 4680.738 | 68.314 |
| 4682.024 | 68.293 |
| 4683.3099999999995 | 68.271 |
| 4684.595 | 68.249 |
| 4685.881 | 68.228 |
| 4687.1669999999995 | 68.206 |
| 4688.453 | 68.183 |
| 4689.7390000000005 | 68.161 |
| 4691.025 | 68.138 |
| 4692.311 | 68.117 |
| 4693.597 | 68.098 |
| 4694.883 | 68.079 |
| 4696.169 | 68.059 |
| 4697.455 | 68.038 |
| 4698.741 | 68.016 |
| 4700.026 | 67.994 |
| 4701.312 | 67.97 |
| 4702.598 | 67.948 |
| 4703.884 | 67.925 |
| 4705.17 | 67.903 |
| 4706.456 | 67.88 |
| 4707.741999999999 | 67.857 |
| 4709.028 | 67.835 |
| 4710.314 | 67.812 |
| 4711.599999999999 | 67.79 |
| 4712.886 | 67.767 |
| 4714.172 | 67.743 |
| 4715.456999999999 | 67.719 |
| 4716.743 | 67.694 |
| 4718.0289999999995 | 67.67 |
| 4719.315 | 67.647 |
| 4720.601000000001 | 67.624 |
| 4721.887 | 67.601 |
| 4723.173 | 67.578 |
| 4724.459000000001 | 67.556 |
| 4725.745 | 67.534 |
| 4727.031 | 67.512 |
| 4728.317 | 67.489 |
| 4729.603 | 67.467 |
| 4730.888 | 67.445 |
| 4732.174 | 67.422 |
| 4733.46 | 67.398 |
| 4734.746 | 67.374 |
| 4736.032 | 67.351 |
| 4737.318 | 67.329 |
| 4738.603999999999 | 67.309 |
| 4739.89 | 67.289 |
| 4741.176 | 67.27 |
| 4742.4619999999995 | 67.249 |
| 4743.7480000000005 | 67.227 |
| 4745.034000000001 | 67.203 |
| 4746.3189999999995 | 67.178 |
| 4747.6050000000005 | 67.154 |
| 4748.8910000000005 | 67.129 |
| 4750.177 | 67.105 |
| 4751.463000000001 | 67.082 |
| 4752.749 | 67.058 |
| 4754.035 | 67.036 |
| 4755.321 | 67.013 |
| 4756.607 | 66.99 |
| 4757.893 | 66.965 |
| 4759.178999999999 | 66.94 |
| 4760.465 | 66.913 |
| 4761.75 | 66.886 |
| 4763.036 | 66.86 |
| 4764.322 | 66.835 |
| 4765.608 | 66.811 |
| 4766.893999999999 | 66.788 |
| 4768.18 | 66.765 |
| 4769.466 | 66.741 |
| 4770.7519999999995 | 66.716 |
| 4772.0380000000005 | 66.691 |
| 4773.324 | 66.665 |
| 4774.61 | 66.638 |
| 4775.896000000001 | 66.611 |
| 4777.181 | 66.584 |
| 4778.467 | 66.557 |
| 4779.753000000001 | 66.53 |
| 4781.039 | 66.504 |
| 4782.325 | 66.476 |
| 4783.611 | 66.449 |
| 4784.897 | 66.422 |
| 4786.183 | 66.396 |
| 4787.469 | 66.371 |
| 4788.755 | 66.347 |
| 4790.041 | 66.323 |
| 4791.327 | 66.298 |
| 4792.612 | 66.274 |
| 4793.898 | 66.249 |
| 4795.184 | 66.224 |
| 4796.47 | 66.199 |
| 4797.755999999999 | 66.173 |
| 4799.042 | 66.147 |
| 4800.328 | 66.12 |
| 4801.614 | 66.094 |
| 4802.900000000001 | 66.067 |
| 4804.186 | 66.04 |
| 4805.472 | 66.013 |
| 4806.758000000001 | 65.985 |
| 4808.043 | 65.957 |
| 4809.329 | 65.93 |
| 4810.615000000001 | 65.904 |
| 4811.901 | 65.878 |
| 4813.187 | 65.853 |
| 4814.473 | 65.827 |
| 4815.759 | 65.8 |
| 4817.045 | 65.773 |
| 4818.331 | 65.744 |
| 4819.617 | 65.715 |
| 4820.903 | 65.686 |
| 4822.188999999999 | 65.658 |
| 4823.474 | 65.631 |
| 4824.76 | 65.605 |
| 4826.046 | 65.578 |
| 4827.332 | 65.551 |
| 4828.6179999999995 | 65.524 |
| 4829.9039999999995 | 65.496 |
| 4831.1900000000005 | 65.468 |
| 4832.476 | 65.439 |
| 4833.762 | 65.41 |
| 4835.048 | 65.382 |
| 4836.334 | 65.353 |
| 4837.62 | 65.324 |
| 4838.905 | 65.294 |
| 4840.191 | 65.263 |
| 4841.477 | 65.232 |
| 4842.763 | 65.202 |
| 4844.049 | 65.173 |
| 4845.335 | 65.148 |
| 4846.621 | 65.123 |
| 4847.907 | 65.1 |
| 4849.192999999999 | 65.075 |
| 4850.479 | 65.049 |
| 4851.765 | 65.02 |
| 4853.0509999999995 | 64.991 |
| 4854.336 | 64.961 |
| 4855.622 | 64.931 |
| 4856.907999999999 | 64.9 |
| 4858.194 | 64.869 |
| 4859.48 | 64.838 |
| 4860.766 | 64.809 |
| 4862.052000000001 | 64.78 |
| 4863.338 | 64.752 |
| 4864.624 | 64.725 |
| 4865.910000000001 | 64.697 |
| 4867.196 | 64.669 |
| 4868.482 | 64.64 |
| 4869.767000000001 | 64.61 |
| 4871.053 | 64.58 |
| 4872.339 | 64.55 |
| 4873.625 | 64.521 |
| 4874.911 | 64.493 |
| 4876.197 | 64.465 |
| 4877.483 | 64.437 |
| 4878.769 | 64.409 |
| 4880.054999999999 | 64.38 |
| 4881.341 | 64.351 |
| 4882.627 | 64.322 |
| 4883.913 | 64.293 |
| 4885.198 | 64.263 |
| 4886.484 | 64.234 |
| 4887.7699999999995 | 64.204 |
| 4889.0560000000005 | 64.174 |
| 4890.342000000001 | 64.144 |
| 4891.628 | 64.114 |
| 4892.914 | 64.082 |
| 4894.2 | 64.051 |
| 4895.486 | 64.019 |
| 4896.772 | 63.987 |
| 4898.058 | 63.955 |
| 4899.344 | 63.923 |
| 4900.629 | 63.892 |
| 4901.915 | 63.863 |
| 4903.201 | 63.835 |
| 4904.486999999999 | 63.807 |
| 4905.773 | 63.78 |
| 4907.059 | 63.752 |
| 4908.344999999999 | 63.724 |
| 4909.631 | 63.696 |
| 4910.917 | 63.667 |
| 4912.2029999999995 | 63.639 |
| 4913.4890000000005 | 63.61 |
| 4914.775 | 63.58 |
| 4916.0599999999995 | 63.55 |
| 4917.3460000000005 | 63.519 |
| 4918.632 | 63.488 |
| 4919.918 | 63.457 |
| 4921.204000000001 | 63.426 |
| 4922.49 | 63.397 |
| 4923.776 | 63.368 |
| 4925.062 | 63.339 |
| 4926.348 | 63.31 |
| 4927.634 | 63.28 |
| 4928.92 | 63.25 |
| 4930.206 | 63.218 |
| 4931.491 | 63.187 |
| 4932.777 | 63.155 |
| 4934.063 | 63.124 |
| 4935.349 | 63.095 |
| 4936.635 | 63.066 |
| 4937.921 | 63.038 |
| 4939.206999999999 | 63.01 |
| 4940.493 | 62.981 |
| 4941.779 | 62.952 |
| 4943.065 | 62.922 |
| 4944.351000000001 | 62.892 |
| 4945.637 | 62.861 |
| 4946.922 | 62.831 |
| 4948.2080000000005 | 62.8 |
| 4949.494 | 62.769 |
| 4950.78 | 62.738 |
| 4952.066000000001 | 62.706 |
| 4953.352 | 62.673 |
| 4954.638 | 62.639 |
| 4955.924000000001 | 62.607 |
| 4957.21 | 62.574 |
| 4958.496 | 62.544 |
| 4959.781999999999 | 62.514 |
| 4961.068 | 62.49 |
| 4962.353 | 62.465 |
| 4963.639 | 62.442 |
| 4964.925 | 62.417 |
| 4966.211 | 62.391 |
| 4967.496999999999 | 62.363 |
| 4968.783 | 62.334 |
| 4970.0689999999995 | 62.305 |
| 4971.355 | 62.276 |
| 4972.6410000000005 | 62.247 |
| 4973.927 | 62.218 |
| 4975.213 | 62.189 |
| 4976.499 | 62.16 |
| 4977.785 | 62.131 |
| 4979.07 | 62.101 |
| 4980.356 | 62.072 |
| 4981.642 | 62.043 |
| 4982.928 | 62.015 |
| 4984.214 | 61.987 |
| 4985.5 | 61.959 |
| 4986.786 | 61.932 |
| 4988.072 | 61.904 |
| 4989.358 | 61.876 |
| 4990.643999999999 | 61.848 |
| 4991.93 | 61.82 |
| 4993.216 | 61.792 |
| 4994.500999999999 | 61.764 |
| 4995.787 | 61.737 |
| 4997.073 | 61.709 |
| 4998.3589999999995 | 61.68 |
| 4999.645 | 61.651 |
| 5000.931 | 61.621 |
| 5002.217 | 61.591 |
| 5003.503000000001 | 61.561 |
| 5004.789 | 61.533 |
| 5006.075 | 61.505 |
| 5007.361000000001 | 61.479 |
| 5008.647 | 61.452 |
| 5009.932 | 61.426 |
| 5011.218000000001 | 61.398 |
| 5012.504 | 61.37 |
| 5013.79 | 61.34 |
| 5015.076 | 61.309 |
| 5016.362 | 61.275 |
| 5017.648 | 61.24 |
| 5018.934 | 61.203 |
| 5020.22 | 61.168 |
| 5021.505999999999 | 61.137 |
| 5022.792 | 61.11 |
| 5024.078 | 61.089 |
| 5025.362999999999 | 61.067 |
| 5026.649 | 61.045 |
| 5027.935 | 61.02 |
| 5029.221 | 60.992 |
| 5030.507 | 60.964 |
| 5031.793000000001 | 60.937 |
| 5033.079 | 60.912 |
| 5034.365 | 60.888 |
| 5035.651 | 60.864 |
| 5036.937 | 60.839 |
| 5038.223 | 60.812 |
| 5039.509 | 60.785 |
| 5040.794 | 60.757 |
| 5042.08 | 60.728 |
| 5043.366 | 60.7 |
| 5044.652 | 60.672 |
| 5045.937999999999 | 60.644 |
| 5047.224 | 60.616 |
| 5048.51 | 60.589 |
| 5049.795999999999 | 60.561 |
| 5051.082 | 60.534 |
| 5052.368 | 60.506 |
| 5053.6539999999995 | 60.479 |
| 5054.9400000000005 | 60.451 |
| 5056.225 | 60.422 |
| 5057.5109999999995 | 60.394 |
| 5058.7970000000005 | 60.365 |
| 5060.083 | 60.337 |
| 5061.369 | 60.308 |
| 5062.655000000001 | 60.28 |
| 5063.941 | 60.252 |
| 5065.227 | 60.223 |
| 5066.513 | 60.195 |
| 5067.799 | 60.165 |
| 5069.085 | 60.136 |
| 5070.371 | 60.106 |
| 5071.656 | 60.077 |
| 5072.942 | 60.048 |
| 5074.228 | 60.019 |
| 5075.514 | 59.991 |
| 5076.8 | 59.962 |
| 5078.086 | 59.932 |
| 5079.372 | 59.901 |
| 5080.657999999999 | 59.868 |
| 5081.944 | 59.833 |
| 5083.2300000000005 | 59.798 |
| 5084.516 | 59.764 |
| 5085.802000000001 | 59.733 |
| 5087.087 | 59.706 |
| 5088.373 | 59.681 |
| 5089.659000000001 | 59.657 |
| 5090.945 | 59.633 |
| 5092.231 | 59.609 |
| 5093.517000000001 | 59.584 |
| 5094.803 | 59.556 |
| 5096.089 | 59.528 |
| 5097.375 | 59.498 |
| 5098.661 | 59.467 |
| 5099.947 | 59.436 |
| 5101.232999999999 | 59.404 |
| 5102.518 | 59.374 |
| 5103.804 | 59.343 |
| 5105.089999999999 | 59.314 |
| 5106.376 | 59.285 |
| 5107.662 | 59.255 |
| 5108.947999999999 | 59.225 |
| 5110.234 | 59.194 |
| 5111.5199999999995 | 59.163 |
| 5112.806 | 59.13 |
| 5114.092000000001 | 59.098 |
| 5115.378 | 59.067 |
| 5116.664 | 59.036 |
| 5117.9490000000005 | 59.006 |
| 5119.235 | 58.977 |
| 5120.521 | 58.947 |
| 5121.807000000001 | 58.917 |
| 5123.093 | 58.886 |
| 5124.379 | 58.855 |
| 5125.665 | 58.823 |
| 5126.951 | 58.791 |
| 5128.237 | 58.759 |
| 5129.523 | 58.727 |
| 5130.809 | 58.695 |
| 5132.094999999999 | 58.661 |
| 5133.38 | 58.627 |
| 5134.666 | 58.592 |
| 5135.951999999999 | 58.555 |
| 5137.238 | 58.518 |
| 5138.524 | 58.481 |
| 5139.8099999999995 | 58.445 |
| 5141.0960000000005 | 58.411 |
| 5142.382 | 58.378 |
| 5143.668 | 58.345 |
| 5144.954000000001 | 58.307 |
| 5146.24 | 58.265 |
| 5147.526 | 58.221 |
| 5148.811000000001 | 58.176 |
| 5150.097 | 58.138 |
| 5151.383 | 58.106 |
| 5152.669000000001 | 58.079 |
| 5153.955 | 58.056 |
| 5155.241 | 58.031 |
| 5156.527 | 58.004 |
| 5157.813 | 57.973 |
| 5159.099 | 57.94 |
| 5160.385 | 57.905 |
| 5161.671 | 57.87 |
| 5162.956999999999 | 57.834 |
| 5164.242 | 57.798 |
| 5165.528 | 57.762 |
| 5166.813999999999 | 57.726 |
| 5168.1 | 57.689 |
| 5169.386 | 57.651 |
| 5170.672 | 57.613 |
| 5171.958 | 57.573 |
| 5173.244000000001 | 57.534 |
| 5174.53 | 57.494 |
| 5175.816 | 57.455 |
| 5177.102 | 57.417 |
| 5178.388 | 57.378 |
| 5179.673 | 57.339 |
| 5180.959 | 57.3 |
| 5182.245 | 57.261 |
| 5183.531 | 57.222 |
| 5184.817 | 57.184 |
| 5186.103 | 57.146 |
| 5187.388999999999 | 57.108 |
| 5188.675 | 57.069 |
| 5189.961 | 57.029 |
| 5191.246999999999 | 56.99 |
| 5192.533 | 56.95 |
| 5193.819 | 56.909 |
| 5195.103999999999 | 56.868 |
| 5196.39 | 56.824 |
| 5197.676 | 56.776 |
| 5198.9619999999995 | 56.725 |
| 5200.2480000000005 | 56.67 |
| 5201.534 | 56.617 |
| 5202.82 | 56.57 |
| 5204.106000000001 | 56.527 |
| 5205.392 | 56.494 |
| 5206.678 | 56.46 |
| 5207.964 | 56.427 |
| 5209.25 | 56.391 |
| 5210.535 | 56.347 |
| 5211.821 | 56.299 |
| 5213.107 | 56.242 |
| 5214.393 | 56.186 |
| 5215.679 | 56.134 |
| 5216.965 | 56.086 |
| 5218.251 | 56.049 |
| 5219.537 | 56.012 |
| 5220.823 | 55.976 |
| 5222.1089999999995 | 55.94 |
| 5223.395 | 55.898 |
| 5224.6810000000005 | 55.855 |
| 5225.965999999999 | 55.81 |
| 5227.252 | 55.765 |
| 5228.5380000000005 | 55.719 |
| 5229.824 | 55.674 |
| 5231.110000000001 | 55.625 |
| 5232.396 | 55.576 |
| 5233.682 | 55.523 |
| 5234.968 | 55.469 |
| 5236.254 | 55.414 |
| 5237.54 | 55.359 |
| 5238.826 | 55.308 |
| 5240.112 | 55.259 |
| 5241.397 | 55.213 |
| 5242.683 | 55.168 |
| 5243.969 | 55.123 |
| 5245.255 | 55.079 |
| 5246.540999999999 | 55.033 |
| 5247.827 | 54.986 |
| 5249.113 | 54.937 |
| 5250.398999999999 | 54.887 |
| 5251.685 | 54.837 |
| 5252.971 | 54.786 |
| 5254.257 | 54.736 |
| 5255.543000000001 | 54.687 |
| 5256.8279999999995 | 54.638 |
| 5258.114 | 54.588 |
| 5259.400000000001 | 54.537 |
| 5260.686 | 54.486 |
| 5261.972 | 54.434 |
| 5263.258000000001 | 54.382 |
| 5264.544 | 54.33 |
| 5265.83 | 54.278 |
| 5267.116 | 54.226 |
| 5268.402 | 54.175 |
| 5269.688 | 54.123 |
| 5270.974 | 54.071 |
| 5272.259 | 54.019 |
| 5273.545 | 53.962 |
| 5274.831 | 53.904 |
| 5276.117 | 53.843 |
| 5277.402999999999 | 53.781 |
| 5278.689 | 53.724 |
| 5279.975 | 53.669 |
| 5281.2609999999995 | 53.617 |
| 5282.5470000000005 | 53.569 |
| 5283.833 | 53.52 |
| 5285.119 | 53.472 |
| 5286.405000000001 | 53.421 |
| 5287.69 | 53.367 |
| 5288.976 | 53.31 |
| 5290.262000000001 | 53.245 |
| 5291.548 | 53.179 |
| 5292.834 | 53.11 |
| 5294.120000000001 | 53.043 |
| 5295.406 | 52.989 |
| 5296.692 | 52.935 |
| 5297.978 | 52.891 |
| 5299.264 | 52.846 |
| 5300.55 | 52.797 |
| 5301.835999999999 | 52.748 |
| 5303.121 | 52.692 |
| 5304.407 | 52.635 |
| 5305.693 | 52.576 |
| 5306.979 | 52.517 |
| 5308.264999999999 | 52.459 |
| 5309.5509999999995 | 52.403 |
| 5310.837 | 52.348 |
| 5312.123 | 52.293 |
| 5313.409 | 52.239 |
| 5314.695000000001 | 52.184 |
| 5315.981 | 52.129 |
| 5317.267 | 52.073 |
| 5318.552000000001 | 52.016 |
| 5319.838 | 51.959 |
| 5321.124 | 51.901 |
| 5322.41 | 51.842 |
| 5323.696 | 51.784 |
| 5324.982 | 51.725 |
| 5326.268 | 51.667 |
| 5327.554 | 51.609 |
| 5328.839999999999 | 51.551 |
| 5330.126 | 51.493 |
| 5331.412 | 51.435 |
| 5332.697999999999 | 51.376 |
| 5333.983 | 51.318 |
| 5335.269 | 51.26 |
| 5336.554999999999 | 51.202 |
| 5337.841 | 51.145 |
| 5339.127 | 51.088 |
| 5340.413 | 51.032 |
| 5341.6990000000005 | 50.977 |
| 5342.985 | 50.921 |
| 5344.271 | 50.863 |
| 5345.557000000001 | 50.804 |
| 5346.843 | 50.734 |
| 5348.129 | 50.661 |
| 5349.414000000001 | 50.581 |
| 5350.7 | 50.496 |
| 5351.986 | 50.417 |
| 5353.272 | 50.345 |
| 5354.558 | 50.28 |
| 5355.844 | 50.229 |
| 5357.13 | 50.18 |
| 5358.416 | 50.136 |
| 5359.702 | 50.093 |
| 5360.988 | 50.048 |
| 5362.274 | 50.003 |
| 5363.5599999999995 | 49.954 |
| 5364.846 | 49.904 |
| 5366.131 | 49.85 |
| 5367.4169999999995 | 49.794 |
| 5368.703 | 49.737 |
| 5369.9890000000005 | 49.679 |
| 5371.275 | 49.62 |
| 5372.561 | 49.561 |
| 5373.847 | 49.503 |
| 5375.133 | 49.444 |
| 5376.419 | 49.385 |
| 5377.705 | 49.325 |
| 5378.991 | 49.266 |
| 5380.277 | 49.207 |
| 5381.562 | 49.148 |
| 5382.848 | 49.091 |
| 5384.134 | 49.035 |
| 5385.42 | 48.979 |
| 5386.706 | 48.924 |
| 5387.991999999999 | 48.868 |
| 5389.278 | 48.81 |
| 5390.564 | 48.752 |
| 5391.849999999999 | 48.694 |
| 5393.136 | 48.635 |
| 5394.422 | 48.578 |
| 5395.708 | 48.52 |
| 5396.993 | 48.463 |
| 5398.2789999999995 | 48.407 |
| 5399.565 | 48.35 |
| 5400.851000000001 | 48.293 |
| 5402.137 | 48.237 |
| 5403.423 | 48.18 |
| 5404.709000000001 | 48.123 |
| 5405.995 | 48.065 |
| 5407.281 | 48.007 |
| 5408.567 | 47.944 |
| 5409.853 | 47.881 |
| 5411.139 | 47.817 |
| 5412.424 | 47.753 |
| 5413.71 | 47.696 |
| 5414.996 | 47.641 |
| 5416.282 | 47.589 |
| 5417.568 | 47.539 |
| 5418.853999999999 | 47.482 |
| 5420.14 | 47.413 |
| 5421.426 | 47.342 |
| 5422.7119999999995 | 47.258 |
| 5423.9980000000005 | 47.174 |
| 5425.284000000001 | 47.113 |
| 5426.57 | 47.056 |
| 5427.8550000000005 | 47.009 |
| 5429.1410000000005 | 46.968 |
| 5430.427 | 46.925 |
| 5431.713000000001 | 46.88 |
| 5432.999 | 46.833 |
| 5434.285 | 46.781 |
| 5435.571000000001 | 46.73 |
| 5436.857 | 46.676 |
| 5438.143 | 46.622 |
| 5439.428999999999 | 46.564 |
| 5440.715 | 46.505 |
| 5442.001 | 46.444 |
| 5443.286 | 46.38 |
| 5444.572 | 46.319 |
| 5445.858 | 46.259 |
| 5447.143999999999 | 46.201 |
| 5448.43 | 46.148 |
| 5449.715999999999 | 46.096 |
| 5451.0019999999995 | 46.043 |
| 5452.2880000000005 | 45.99 |
| 5453.574 | 45.935 |
| 5454.86 | 45.88 |
| 5456.146000000001 | 45.826 |
| 5457.432 | 45.772 |
| 5458.717 | 45.717 |
| 5460.003000000001 | 45.661 |
| 5461.289 | 45.604 |
| 5462.575 | 45.529 |
| 5463.861 | 45.453 |
| 5465.147 | 45.37 |
| 5466.433 | 45.284 |
| 5467.719 | 45.215 |
| 5469.005 | 45.16 |
| 5470.290999999999 | 45.11 |
| 5471.577 | 45.074 |
| 5472.863 | 45.038 |
| 5474.147999999999 | 44.993 |
| 5475.434 | 44.948 |
| 5476.72 | 44.885 |
| 5478.005999999999 | 44.818 |
| 5479.292 | 44.748 |
| 5480.578 | 44.676 |
| 5481.864 | 44.61 |
| 5483.150000000001 | 44.555 |
| 5484.436 | 44.501 |
| 5485.722 | 44.453 |
| 5487.008000000001 | 44.405 |
| 5488.294 | 44.353 |
| 5489.579 | 44.3 |
| 5490.865000000001 | 44.246 |
| 5492.151 | 44.19 |
| 5493.437 | 44.134 |
| 5494.723 | 44.078 |
| 5496.009 | 44.021 |
| 5497.295 | 43.963 |
| 5498.581 | 43.905 |
| 5499.867 | 43.844 |
| 5501.153 | 43.783 |
| 5502.439 | 43.721 |
| 5503.725 | 43.658 |
| 5505.01 | 43.596 |
| 5506.296 | 43.537 |
| 5507.582 | 43.477 |
| 5508.8679999999995 | 43.419 |
| 5510.154 | 43.361 |
| 5511.4400000000005 | 43.303 |
| 5512.726 | 43.245 |
| 5514.012 | 43.186 |
| 5515.298 | 43.126 |
| 5516.584 | 43.066 |
| 5517.87 | 43.002 |
| 5519.156 | 42.938 |
| 5520.441 | 42.87 |
| 5521.727 | 42.8 |
| 5523.013 | 42.732 |
| 5524.299 | 42.664 |
| 5525.585 | 42.599 |
| 5526.871 | 42.541 |
| 5528.157 | 42.484 |
| 5529.442999999999 | 42.428 |
| 5530.729 | 42.372 |
| 5532.015 | 42.313 |
| 5533.3009999999995 | 42.253 |
| 5534.587 | 42.192 |
| 5535.872 | 42.131 |
| 5537.157999999999 | 42.071 |
| 5538.444 | 42.011 |
| 5539.73 | 41.952 |
| 5541.016 | 41.893 |
| 5542.302000000001 | 41.835 |
| 5543.588 | 41.775 |
| 5544.874 | 41.714 |
| 5546.160000000001 | 41.651 |
| 5547.446 | 41.583 |
| 5548.732 | 41.514 |
| 5550.018 | 41.443 |
| 5551.303 | 41.372 |
| 5552.589 | 41.301 |
| 5553.875 | 41.231 |
| 5555.161 | 41.16 |
| 5556.447 | 41.088 |
| 5557.733 | 41.016 |
| 5559.019 | 40.952 |
| 5560.304999999999 | 40.889 |
| 5561.591 | 40.83 |
| 5562.877 | 40.774 |
| 5564.163 | 40.717 |
| 5565.4490000000005 | 40.654 |
| 5566.734 | 40.591 |
| 5568.0199999999995 | 40.523 |
| 5569.3060000000005 | 40.454 |
| 5570.592000000001 | 40.392 |
| 5571.878 | 40.333 |
| 5573.164000000001 | 40.274 |
| 5574.45 | 40.215 |
| 5575.736 | 40.156 |
| 5577.022 | 40.073 |
| 5578.308 | 39.99 |
| 5579.594 | 39.899 |
| 5580.879999999999 | 39.803 |
| 5582.165 | 39.715 |
| 5583.451 | 39.645 |
| 5584.736999999999 | 39.574 |
| 5586.023 | 39.52 |
| 5587.309 | 39.466 |
| 5588.594999999999 | 39.413 |
| 5589.881 | 39.36 |
| 5591.167 | 39.305 |
| 5592.4529999999995 | 39.247 |
| 5593.7390000000005 | 39.189 |
| 5595.025 | 39.127 |
| 5596.311 | 39.065 |
| 5597.5960000000005 | 39 |
| 5598.882 | 38.933 |
| 5600.168 | 38.864 |
| 5601.454000000001 | 38.787 |
| 5602.74 | 38.71 |
| 5604.026 | 38.633 |
| 5605.312 | 38.556 |
| 5606.598 | 38.485 |
| 5607.884 | 38.42 |
| 5609.17 | 38.354 |
| 5610.456 | 38.291 |
| 5611.741999999999 | 38.227 |
| 5613.027 | 38.154 |
| 5614.313 | 38.077 |
| 5615.598999999999 | 37.997 |
| 5616.885 | 37.913 |
| 5618.171 | 37.83 |
| 5619.456999999999 | 37.757 |
| 5620.743 | 37.683 |
| 5622.029 | 37.618 |
| 5623.315 | 37.556 |
| 5624.601000000001 | 37.493 |
| 5625.887 | 37.431 |
| 5627.173 | 37.368 |
| 5628.4580000000005 | 37.296 |
| 5629.744 | 37.225 |
| 5631.03 | 37.15 |
| 5632.316000000001 | 37.073 |
| 5633.602 | 36.998 |
| 5634.888 | 36.931 |
| 5636.174 | 36.863 |
| 5637.46 | 36.793 |
| 5638.746 | 36.722 |
| 5640.032 | 36.636 |
| 5641.318 | 36.531 |
| 5642.604 | 36.426 |
| 5643.889 | 36.317 |
| 5645.175 | 36.209 |
| 5646.461 | 36.133 |
| 5647.747 | 36.072 |
| 5649.033 | 36.014 |
| 5650.3189999999995 | 35.967 |
| 5651.605 | 35.919 |
| 5652.8910000000005 | 35.852 |
| 5654.177 | 35.783 |
| 5655.463 | 35.705 |
| 5656.749 | 35.619 |
| 5658.035 | 35.533 |
| 5659.32 | 35.459 |
| 5660.606 | 35.386 |
| 5661.892 | 35.319 |
| 5663.178 | 35.257 |
| 5664.464 | 35.193 |
| 5665.75 | 35.127 |
| 5667.036 | 35.062 |
| 5668.322 | 34.994 |
| 5669.608 | 34.925 |
| 5670.893999999999 | 34.852 |
| 5672.18 | 34.772 |
| 5673.466 | 34.691 |
| 5674.750999999999 | 34.589 |
| 5676.037 | 34.486 |
| 5677.323 | 34.388 |
| 5678.6089999999995 | 34.294 |
| 5679.895 | 34.206 |
| 5681.181 | 34.14 |
| 5682.467 | 34.075 |
| 5683.753000000001 | 34.014 |
| 5685.039 | 33.955 |
| 5686.325 | 33.89 |
| 5687.611000000001 | 33.817 |
| 5688.897 | 33.745 |
| 5690.182 | 33.653 |
| 5691.468000000001 | 33.56 |
| 5692.754 | 33.467 |
| 5694.04 | 33.374 |
| 5695.326 | 33.284 |
| 5696.612 | 33.21 |
| 5697.898 | 33.137 |
| 5699.184 | 33.071 |
| 5700.47 | 33.008 |
| 5701.755999999999 | 32.945 |
| 5703.042 | 32.881 |
| 5704.328 | 32.818 |
| 5705.612999999999 | 32.744 |
| 5706.899 | 32.667 |
| 5708.185 | 32.583 |
| 5709.471 | 32.482 |
| 5710.7570000000005 | 32.382 |
| 5712.043000000001 | 32.284 |
| 5713.329 | 32.186 |
| 5714.615 | 32.096 |
| 5715.901 | 32.015 |
| 5717.187 | 31.933 |
| 5718.473 | 31.846 |
| 5719.759 | 31.759 |
| 5721.044 | 31.671 |
| 5722.33 | 31.582 |
| 5723.616 | 31.494 |
| 5724.902 | 31.418 |
| 5726.187999999999 | 31.342 |
| 5727.474 | 31.272 |
| 5728.76 | 31.205 |
| 5730.045999999999 | 31.137 |
| 5731.332 | 31.065 |
| 5732.618 | 30.993 |
| 5733.9039999999995 | 30.909 |
| 5735.1900000000005 | 30.821 |
| 5736.476 | 30.734 |
| 5737.7609999999995 | 30.65 |
| 5739.0470000000005 | 30.565 |
| 5740.333 | 30.496 |
| 5741.619 | 30.43 |
| 5742.905000000001 | 30.361 |
| 5744.191 | 30.286 |
| 5745.477 | 30.212 |
| 5746.763 | 30.111 |
| 5748.049 | 30.005 |
| 5749.335 | 29.903 |
| 5750.621 | 29.806 |
| 5751.907 | 29.71 |
| 5753.192 | 29.641 |
| 5754.478 | 29.575 |
| 5755.764 | 29.514 |
| 5757.049999999999 | 29.46 |
| 5758.336 | 29.406 |
| 5759.622 | 29.352 |
| 5760.907999999999 | 29.298 |
| 5762.194 | 29.231 |
| 5763.4800000000005 | 29.148 |
| 5764.766 | 29.065 |
| 5766.052000000001 | 28.918 |
| 5767.338 | 28.768 |
| 5768.623 | 28.637 |
| 5769.909000000001 | 28.529 |
| 5771.195 | 28.42 |
| 5772.481 | 28.369 |
| 5773.767000000001 | 28.32 |
| 5775.053 | 28.268 |
| 5776.339 | 28.213 |
| 5777.625 | 28.158 |
| 5778.911 | 28.078 |
| 5780.197 | 27.996 |
| 5781.482999999999 | 27.913 |
| 5782.769 | 27.828 |
| 5784.054 | 27.742 |
| 5785.34 | 27.672 |
| 5786.626 | 27.602 |
| 5787.912 | 27.533 |
| 5789.197999999999 | 27.466 |
| 5790.484 | 27.398 |
| 5791.7699999999995 | 27.326 |
| 5793.056 | 27.253 |
| 5794.342000000001 | 27.18 |
| 5795.628 | 27.106 |
| 5796.914 | 27.032 |
| 5798.2 | 26.954 |
| 5799.485 | 26.875 |
| 5800.771 | 26.795 |
| 5802.057 | 26.71 |
| 5803.343 | 26.626 |
| 5804.629 | 26.544 |
| 5805.915 | 26.464 |
| 5807.201 | 26.387 |
| 5808.487 | 26.318 |
| 5809.773 | 26.249 |
| 5811.059 | 26.188 |
| 5812.344999999999 | 26.129 |
| 5813.631 | 26.07 |
| 5814.916 | 26.01 |
| 5816.201999999999 | 25.951 |
| 5817.488 | 25.868 |
| 5818.774 | 25.777 |
| 5820.0599999999995 | 25.679 |
| 5821.3460000000005 | 25.551 |
| 5822.632 | 25.422 |
| 5823.918 | 25.32 |
| 5825.204000000001 | 25.231 |
| 5826.49 | 25.145 |
| 5827.776 | 25.08 |
| 5829.062000000001 | 25.014 |
| 5830.347 | 24.942 |
| 5831.633 | 24.865 |
| 5832.919000000001 | 24.788 |
| 5834.205 | 24.716 |
| 5835.491 | 24.645 |
| 5836.777 | 24.58 |
| 5838.063 | 24.523 |
| 5839.349 | 24.466 |
| 5840.635 | 24.41 |
| 5841.921 | 24.353 |
| 5843.206999999999 | 24.292 |
| 5844.493 | 24.223 |
| 5845.778 | 24.153 |
| 5847.063999999999 | 24.079 |
| 5848.35 | 24.002 |
| 5849.636 | 23.928 |
| 5850.922 | 23.86 |
| 5852.208 | 23.793 |
| 5853.494000000001 | 23.73 |
| 5854.78 | 23.669 |
| 5856.066 | 23.608 |
| 5857.352 | 23.534 |
| 5858.638 | 23.461 |
| 5859.924 | 23.379 |
| 5861.209 | 23.289 |
| 5862.495 | 23.199 |
| 5863.781 | 23.112 |
| 5865.067 | 23.025 |
| 5866.353 | 22.945 |
| 5867.638999999999 | 22.875 |
| 5868.925 | 22.805 |
| 5870.211 | 22.75 |
| 5871.496999999999 | 22.7 |
| 5872.783 | 22.653 |
| 5874.069 | 22.615 |
| 5875.355 | 22.578 |
| 5876.64 | 22.527 |
| 5877.926 | 22.468 |
| 5879.2119999999995 | 22.408 |
| 5880.4980000000005 | 22.271 |
| 5881.784 | 22.134 |
| 5883.07 | 22.011 |
| 5884.356000000001 | 21.91 |
| 5885.642 | 21.809 |
| 5886.928 | 21.76 |
| 5888.214 | 21.723 |
| 5889.5 | 21.685 |
| 5890.786 | 21.645 |
| 5892.071 | 21.604 |
| 5893.357 | 21.536 |
| 5894.643 | 21.452 |
| 5895.929 | 21.367 |
| 5897.215 | 21.262 |
| 5898.501 | 21.158 |
| 5899.787 | 21.071 |
| 5901.073 | 21.011 |
| 5902.3589999999995 | 20.952 |
| 5903.645 | 20.905 |
| 5904.9310000000005 | 20.862 |
| 5906.217 | 20.818 |
| 5907.502 | 20.769 |
| 5908.7880000000005 | 20.72 |
| 5910.074 | 20.666 |
| 5911.360000000001 | 20.608 |
| 5912.646 | 20.551 |
| 5913.932 | 20.486 |
| 5915.218000000001 | 20.42 |
| 5916.504 | 20.353 |
| 5917.79 | 20.281 |
| 5919.075999999999 | 20.209 |
| 5920.362 | 20.137 |
| 5921.648 | 20.066 |
| 5922.933 | 19.995 |
| 5924.219 | 19.934 |
| 5925.505 | 19.873 |
| 5926.790999999999 | 19.818 |
| 5928.077 | 19.771 |
| 5929.363 | 19.724 |
| 5930.648999999999 | 19.68 |
| 5931.935 | 19.636 |
| 5933.221 | 19.585 |
| 5934.507 | 19.498 |
| 5935.793000000001 | 19.41 |
| 5937.079 | 19.298 |
| 5938.364 | 19.16 |
| 5939.650000000001 | 19.023 |
| 5940.936 | 18.952 |
| 5942.222 | 18.892 |
| 5943.508 | 18.837 |
| 5944.794 | 18.805 |
| 5946.08 | 18.773 |
| 5947.366 | 18.732 |
| 5948.652 | 18.685 |
| 5949.938 | 18.638 |
| 5951.224 | 18.574 |
| 5952.51 | 18.508 |
| 5953.795 | 18.443 |
| 5955.081 | 18.38 |
| 5956.367 | 18.317 |
| 5957.652999999999 | 18.262 |
| 5958.939 | 18.213 |
| 5960.225 | 18.163 |
| 5961.5109999999995 | 18.117 |
| 5962.7970000000005 | 18.072 |
| 5964.083 | 18.021 |
| 5965.369 | 17.957 |
| 5966.655000000001 | 17.893 |
| 5967.941 | 17.812 |
| 5969.226 | 17.718 |
| 5970.512000000001 | 17.625 |
| 5971.798 | 17.551 |
| 5973.084 | 17.478 |
| 5974.370000000001 | 17.413 |
| 5975.656 | 17.369 |
| 5976.942 | 17.324 |
| 5978.228 | 17.278 |
| 5979.514 | 17.23 |
| 5980.8 | 17.182 |
| 5982.086 | 17.123 |
| 5983.372 | 17.063 |
| 5984.657 | 17.001 |
| 5985.943 | 16.934 |
| 5987.229 | 16.867 |
| 5988.514999999999 | 16.792 |
| 5989.8009999999995 | 16.711 |
| 5991.087 | 16.631 |
| 5992.373 | 16.554 |
| 5993.659 | 16.479 |
| 5994.945000000001 | 16.408 |
| 5996.231 | 16.357 |
| 5997.517 | 16.307 |
| 5998.803 | 16.259 |
| 6000.088 | 16.214 |
| 6001.374 | 16.169 |
| 6002.66 | 16.121 |
| 6003.946 | 16.072 |
| 6005.232 | 16.022 |
| 6006.518 | 15.97 |
| 6007.804 | 15.918 |
| 6009.089999999999 | 15.862 |
| 6010.376 | 15.799 |
| 6011.662 | 15.735 |
| 6012.947999999999 | 15.662 |
| 6014.234 | 15.582 |
| 6015.519 | 15.502 |
| 6016.804999999999 | 15.432 |
| 6018.091 | 15.363 |
| 6019.377 | 15.297 |
| 6020.663 | 15.246 |
| 6021.9490000000005 | 15.194 |
| 6023.235 | 15.143 |
| 6024.521 | 15.093 |
| 6025.807000000001 | 15.043 |
| 6027.093 | 14.99 |
| 6028.379 | 14.937 |
| 6029.665 | 14.883 |
| 6030.95 | 14.828 |
| 6032.236 | 14.774 |
| 6033.522 | 14.72 |
| 6034.808 | 14.669 |
| 6036.094 | 14.618 |
| 6037.38 | 14.572 |
| 6038.666 | 14.529 |
| 6039.952 | 14.485 |
| 6041.238 | 14.444 |
| 6042.524 | 14.404 |
| 6043.8099999999995 | 14.36 |
| 6045.0960000000005 | 14.287 |
| 6046.381 | 14.215 |
| 6047.6669999999995 | 14.116 |
| 6048.953 | 13.972 |
| 6050.2390000000005 | 13.828 |
| 6051.525 | 13.734 |
| 6052.811000000001 | 13.669 |
| 6054.097 | 13.604 |
| 6055.383 | 13.576 |
| 6056.669 | 13.553 |
| 6057.955 | 13.53 |
| 6059.241 | 13.506 |
| 6060.527 | 13.482 |
| 6061.812 | 13.455 |
| 6063.098 | 13.422 |
| 6064.384 | 13.388 |
| 6065.67 | 13.344 |
| 6066.956 | 13.294 |
| 6068.241999999999 | 13.243 |
| 6069.528 | 13.171 |
| 6070.814 | 13.095 |
| 6072.099999999999 | 13.018 |
| 6073.386 | 12.938 |
| 6074.672 | 12.858 |
| 6075.958 | 12.788 |
| 6077.243 | 12.736 |
| 6078.5289999999995 | 12.684 |
| 6079.815 | 12.642 |
| 6081.101000000001 | 12.607 |
| 6082.387 | 12.573 |
| 6083.673 | 12.537 |
| 6084.959 | 12.501 |
| 6086.245 | 12.465 |
| 6087.531 | 12.421 |
| 6088.817 | 12.378 |
| 6090.103 | 12.334 |
| 6091.389 | 12.287 |
| 6092.674 | 12.241 |
| 6093.96 | 12.195 |
| 6095.246 | 12.149 |
| 6096.532 | 12.104 |
| 6097.818 | 12.061 |
| 6099.103999999999 | 12.019 |
| 6100.39 | 11.977 |
| 6101.676 | 11.937 |
| 6102.9619999999995 | 11.897 |
| 6104.2480000000005 | 11.857 |
| 6105.534 | 11.815 |
| 6106.82 | 11.774 |
| 6108.1050000000005 | 11.73 |
| 6109.391 | 11.679 |
| 6110.677 | 11.629 |
| 6111.963000000001 | 11.567 |
| 6113.249 | 11.493 |
| 6114.535 | 11.42 |
| 6115.821000000001 | 11.355 |
| 6117.107 | 11.294 |
| 6118.393 | 11.233 |
| 6119.679 | 11.197 |
| 6120.965 | 11.165 |
| 6122.251 | 11.132 |
| 6123.536999999999 | 11.104 |
| 6124.822 | 11.075 |
| 6126.108 | 11.045 |
| 6127.394 | 11.011 |
| 6128.68 | 10.977 |
| 6129.965999999999 | 10.941 |
| 6131.2519999999995 | 10.904 |
| 6132.5380000000005 | 10.866 |
| 6133.824 | 10.829 |
| 6135.11 | 10.792 |
| 6136.396000000001 | 10.755 |
| 6137.682 | 10.716 |
| 6138.968 | 10.676 |
| 6140.253000000001 | 10.636 |
| 6141.539 | 10.59 |
| 6142.825 | 10.543 |
| 6144.111 | 10.497 |
| 6145.397 | 10.454 |
| 6146.683 | 10.411 |
| 6147.969 | 10.372 |
| 6149.255 | 10.34 |
| 6150.540999999999 | 10.309 |
| 6151.827 | 10.279 |
| 6153.113 | 10.25 |
| 6154.398999999999 | 10.221 |
| 6155.684 | 10.184 |
| 6156.97 | 10.144 |
| 6158.255999999999 | 10.103 |
| 6159.542 | 10.054 |
| 6160.828 | 10.004 |
| 6162.114 | 9.953 |
| 6163.400000000001 | 9.913 |
| 6164.686 | 9.875 |
| 6165.972 | 9.837 |
| 6167.258000000001 | 9.809 |
| 6168.544 | 9.781 |
| 6169.83 | 9.754 |
| 6171.115000000001 | 9.726 |
| 6172.401 | 9.698 |
| 6173.687 | 9.671 |
| 6174.973 | 9.643 |
| 6176.259 | 9.616 |
| 6177.545 | 9.588 |
| 6178.831 | 9.56 |
| 6180.117 | 9.532 |
| 6181.403 | 9.495 |
| 6182.689 | 9.453 |
| 6183.975 | 9.412 |
| 6185.2609999999995 | 9.361 |
| 6186.546 | 9.308 |
| 6187.832 | 9.255 |
| 6189.1179999999995 | 9.22 |
| 6190.404 | 9.187 |
| 6191.6900000000005 | 9.154 |
| 6192.976 | 9.131 |
| 6194.262 | 9.108 |
| 6195.548 | 9.085 |
| 6196.834 | 9.061 |
| 6198.12 | 9.036 |
| 6199.406 | 9.011 |
| 6200.692 | 8.984 |
| 6201.977 | 8.957 |
| 6203.263 | 8.929 |
| 6204.549 | 8.902 |
| 6205.835 | 8.874 |
| 6207.121 | 8.846 |
| 6208.407 | 8.817 |
| 6209.692999999999 | 8.787 |
| 6210.979 | 8.756 |
| 6212.265 | 8.724 |
| 6213.5509999999995 | 8.692 |
| 6214.837 | 8.66 |
| 6216.123 | 8.628 |
| 6217.407999999999 | 8.596 |
| 6218.694 | 8.566 |
| 6219.98 | 8.536 |
| 6221.266 | 8.506 |
| 6222.552000000001 | 8.476 |
| 6223.838 | 8.446 |
| 6225.124 | 8.416 |
| 6226.41 | 8.387 |
| 6227.696 | 8.359 |
| 6228.982 | 8.331 |
| 6230.268 | 8.304 |
| 6231.554 | 8.278 |
| 6232.839 | 8.251 |
| 6234.125 | 8.224 |
| 6235.411 | 8.197 |
| 6236.697 | 8.169 |
| 6237.983 | 8.141 |
| 6239.269 | 8.113 |
| 6240.554999999999 | 8.085 |
| 6241.841 | 8.058 |
| 6243.127 | 8.03 |
| 6244.413 | 8.003 |
| 6245.6990000000005 | 7.976 |
| 6246.985 | 7.949 |
| 6248.2699999999995 | 7.922 |
| 6249.5560000000005 | 7.896 |
| 6250.842 | 7.869 |
| 6252.128 | 7.843 |
| 6253.414000000001 | 7.816 |
| 6254.7 | 7.79 |
| 6255.986 | 7.763 |
| 6257.272000000001 | 7.737 |
| 6258.558 | 7.71 |
| 6259.844 | 7.684 |
| 6261.129999999999 | 7.657 |
| 6262.416 | 7.63 |
| 6263.701 | 7.603 |
| 6264.987 | 7.576 |
| 6266.273 | 7.549 |
| 6267.559 | 7.522 |
| 6268.844999999999 | 7.495 |
| 6270.131 | 7.468 |
| 6271.4169999999995 | 7.442 |
| 6272.7029999999995 | 7.416 |
| 6273.9890000000005 | 7.39 |
| 6275.275 | 7.366 |
| 6276.561 | 7.341 |
| 6277.847000000001 | 7.317 |
| 6279.132 | 7.293 |
| 6280.418 | 7.27 |
| 6281.704000000001 | 7.246 |
| 6282.99 | 7.221 |
| 6284.276 | 7.196 |
| 6285.562 | 7.172 |
| 6286.848 | 7.146 |
| 6288.134 | 7.12 |
| 6289.42 | 7.094 |
| 6290.706 | 7.068 |
| 6291.991999999999 | 7.042 |
| 6293.278 | 7.016 |
| 6294.563 | 6.991 |
| 6295.848999999999 | 6.967 |
| 6297.135 | 6.942 |
| 6298.421 | 6.918 |
| 6299.706999999999 | 6.894 |
| 6300.993 | 6.871 |
| 6302.279 | 6.848 |
| 6303.565 | 6.825 |
| 6304.851000000001 | 6.802 |
| 6306.137 | 6.778 |
| 6307.423 | 6.755 |
| 6308.709000000001 | 6.731 |
| 6309.994 | 6.707 |
| 6311.28 | 6.682 |
| 6312.566000000001 | 6.657 |
| 6313.852 | 6.632 |
| 6315.138 | 6.606 |
| 6316.424 | 6.581 |
| 6317.71 | 6.556 |
| 6318.996 | 6.531 |
| 6320.282 | 6.507 |
| 6321.568 | 6.483 |
| 6322.854 | 6.46 |
| 6324.139999999999 | 6.436 |
| 6325.425 | 6.413 |
| 6326.711 | 6.39 |
| 6327.997 | 6.367 |
| 6329.283 | 6.345 |
| 6330.5689999999995 | 6.322 |
| 6331.855 | 6.3 |
| 6333.1410000000005 | 6.278 |
| 6334.427 | 6.256 |
| 6335.713 | 6.235 |
| 6336.999 | 6.213 |
| 6338.285 | 6.191 |
| 6339.571 | 6.167 |
| 6340.856 | 6.137 |
| 6342.142 | 6.106 |
| 6343.428 | 6.074 |
| 6344.714 | 6.038 |
| 6346.0 | 6.002 |
| 6347.286 | 5.969 |
| 6348.572 | 5.947 |
| 6349.858 | 5.924 |
| 6351.143999999999 | 5.903 |
| 6352.43 | 5.887 |
| 6353.716 | 5.871 |
| 6355.0019999999995 | 5.854 |
| 6356.287 | 5.836 |
| 6357.573 | 5.819 |
| 6358.8589999999995 | 5.801 |
| 6360.145 | 5.783 |
| 6361.431 | 5.765 |
| 6362.717 | 5.746 |
| 6364.003000000001 | 5.727 |
| 6365.289 | 5.708 |
| 6366.575 | 5.688 |
| 6367.861000000001 | 5.66 |
| 6369.147 | 5.631 |
| 6370.433 | 5.603 |
| 6371.718000000001 | 5.568 |
| 6373.004 | 5.533 |
| 6374.29 | 5.499 |
| 6375.576 | 5.476 |
| 6376.862 | 5.454 |
| 6378.148 | 5.431 |
| 6379.434 | 5.416 |
| 6380.72 | 5.401 |
| 6382.005999999999 | 5.386 |
| 6383.292 | 5.369 |
| 6384.578 | 5.351 |
| 6385.864 | 5.334 |
| 6387.149 | 5.311 |
| 6388.435 | 5.287 |
| 6389.721 | 5.263 |
| 6391.0070000000005 | 5.238 |
| 6392.293 | 5.212 |
| 6393.579 | 5.187 |
| 6394.865000000001 | 5.166 |
| 6396.151 | 5.147 |
| 6397.437 | 5.128 |
| 6398.723 | 5.112 |
| 6400.009 | 5.098 |
| 6401.295 | 5.084 |
| 6402.58 | 5.07 |
| 6403.866 | 5.058 |
| 6405.152 | 5.045 |
| 6406.437999999999 | 5.029 |
| 6407.724 | 5.01 |
| 6409.01 | 4.992 |
| 6410.295999999999 | 4.962 |
| 6411.582 | 4.918 |
| 6412.8679999999995 | 4.875 |
| 6414.1539999999995 | 4.827 |
| 6415.4400000000005 | 4.772 |
| 6416.726 | 4.716 |
| 6418.0109999999995 | 4.672 |
| 6419.2970000000005 | 4.658 |
| 6420.583 | 4.643 |
| 6421.869 | 4.63 |
| 6423.155000000001 | 4.623 |
| 6424.441 | 4.616 |
| 6425.727 | 4.608 |
| 6427.013 | 4.596 |
| 6428.299 | 4.584 |
| 6429.585 | 4.572 |
| 6430.871 | 4.55 |
| 6432.157 | 4.528 |
| 6433.442 | 4.506 |
| 6434.728 | 4.482 |
| 6436.014 | 4.458 |
| 6437.299999999999 | 4.433 |
| 6438.586 | 4.415 |
| 6439.872 | 4.398 |
| 6441.157999999999 | 4.382 |
| 6442.444 | 4.366 |
| 6443.7300000000005 | 4.352 |
| 6445.016 | 4.337 |
| 6446.302000000001 | 4.319 |
| 6447.588 | 4.299 |
| 6448.873 | 4.279 |
| 6450.159000000001 | 4.256 |
| 6451.445 | 4.23 |
| 6452.731 | 4.204 |
| 6454.017000000001 | 4.18 |
| 6455.303 | 4.158 |
| 6456.589 | 4.136 |
| 6457.875 | 4.116 |
| 6459.161 | 4.1 |
| 6460.447 | 4.084 |
| 6461.733 | 4.068 |
| 6463.019 | 4.053 |
| 6464.304 | 4.039 |
| 6465.59 | 4.024 |
| 6466.876 | 4.005 |
| 6468.162 | 3.986 |
| 6469.448 | 3.968 |
| 6470.734 | 3.944 |
| 6472.0199999999995 | 3.92 |
| 6473.306 | 3.895 |
| 6474.592000000001 | 3.871 |
| 6475.878 | 3.848 |
| 6477.164 | 3.824 |
| 6478.45 | 3.802 |
| 6479.735 | 3.782 |
| 6481.021 | 3.761 |
| 6482.307 | 3.741 |
| 6483.593 | 3.72 |
| 6484.879 | 3.7 |
| 6486.165 | 3.679 |
| 6487.451 | 3.657 |
| 6488.737 | 3.636 |
| 6490.023 | 3.614 |
| 6491.309 | 3.584 |
| 6492.594999999999 | 3.553 |
| 6493.881 | 3.523 |
| 6495.166 | 3.494 |
| 6496.451999999999 | 3.464 |
| 6497.738 | 3.434 |
| 6499.024 | 3.419 |
| 6500.3099999999995 | 3.41 |
| 6501.5960000000005 | 3.4 |
| 6502.882 | 3.393 |
| 6504.168 | 3.387 |
| 6505.454000000001 | 3.381 |
| 6506.74 | 3.373 |
| 6508.026 | 3.363 |
| 6509.312000000001 | 3.353 |
| 6510.598 | 3.342 |
| 6511.883 | 3.327 |
| 6513.169000000001 | 3.313 |
| 6514.455 | 3.298 |
| 6515.741 | 3.277 |
| 6517.027 | 3.256 |
| 6518.313 | 3.236 |
| 6519.599 | 3.21 |
| 6520.885 | 3.184 |
| 6522.171 | 3.158 |
| 6523.456999999999 | 3.136 |
| 6524.743 | 3.116 |
| 6526.029 | 3.096 |
| 6527.313999999999 | 3.079 |
| 6528.6 | 3.065 |
| 6529.886 | 3.052 |
| 6531.172 | 3.039 |
| 6532.4580000000005 | 3.028 |
| 6533.744000000001 | 3.016 |
| 6535.03 | 3.005 |
| 6536.316 | 2.993 |
| 6537.602 | 2.98 |
| 6538.888 | 2.968 |
| 6540.174 | 2.953 |
| 6541.46 | 2.938 |
| 6542.745 | 2.922 |
| 6544.031 | 2.905 |
| 6545.317 | 2.886 |
| 6546.603 | 2.868 |
| 6547.888999999999 | 2.849 |
| 6549.175 | 2.831 |
| 6550.461 | 2.813 |
| 6551.746999999999 | 2.794 |
| 6553.033 | 2.776 |
| 6554.3189999999995 | 2.757 |
| 6555.605 | 2.739 |
| 6556.8910000000005 | 2.723 |
| 6558.1759999999995 | 2.707 |
| 6559.4619999999995 | 2.691 |
| 6560.7480000000005 | 2.678 |
| 6562.034 | 2.666 |
| 6563.32 | 2.654 |
| 6564.606000000001 | 2.642 |
| 6565.892 | 2.629 |
| 6567.178 | 2.616 |
| 6568.464 | 2.601 |
| 6569.75 | 2.579 |
| 6571.036 | 2.558 |
| 6572.322 | 2.536 |
| 6573.607 | 2.51 |
| 6574.893 | 2.484 |
| 6576.179 | 2.459 |
| 6577.465 | 2.444 |
| 6578.750999999999 | 2.431 |
| 6580.037 | 2.418 |
| 6581.323 | 2.409 |
| 6582.6089999999995 | 2.401 |
| 6583.895 | 2.394 |
| 6585.1810000000005 | 2.384 |
| 6586.467 | 2.372 |
| 6587.753000000001 | 2.36 |
| 6589.0380000000005 | 2.347 |
| 6590.324 | 2.327 |
| 6591.610000000001 | 2.306 |
| 6592.896 | 2.285 |
| 6594.182 | 2.267 |
| 6595.468000000001 | 2.249 |
| 6596.754 | 2.232 |
| 6598.04 | 2.219 |
| 6599.326 | 2.209 |
| 6600.612 | 2.199 |
| 6601.898 | 2.19 |
| 6603.183999999999 | 2.181 |
| 6604.469 | 2.173 |
| 6605.755 | 2.164 |
| 6607.041 | 2.153 |
| 6608.327 | 2.142 |
| 6609.613 | 2.131 |
| 6610.898999999999 | 2.117 |
| 6612.185 | 2.103 |
| 6613.471 | 2.089 |
| 6614.757 | 2.075 |
| 6616.043000000001 | 2.062 |
| 6617.329 | 2.05 |
| 6618.615 | 2.037 |
| 6619.900000000001 | 2.027 |
| 6621.186 | 2.017 |
| 6622.472 | 2.006 |
| 6623.758 | 1.996 |
| 6625.044 | 1.985 |
| 6626.33 | 1.974 |
| 6627.616 | 1.961 |
| 6628.902 | 1.946 |
| 6630.188 | 1.931 |
| 6631.474 | 1.913 |
| 6632.76 | 1.889 |
| 6634.045999999999 | 1.865 |
| 6635.331 | 1.841 |
| 6636.617 | 1.817 |
| 6637.902999999999 | 1.793 |
| 6639.189 | 1.769 |
| 6640.475 | 1.758 |
| 6641.7609999999995 | 1.752 |
| 6643.0470000000005 | 1.746 |
| 6644.333 | 1.741 |
| 6645.619 | 1.739 |
| 6646.905000000001 | 1.736 |
| 6648.191 | 1.733 |
| 6649.477 | 1.729 |
| 6650.762000000001 | 1.724 |
| 6652.048 | 1.719 |
| 6653.334 | 1.711 |
| 6654.620000000001 | 1.703 |
| 6655.906 | 1.695 |
| 6657.192 | 1.685 |
| 6658.478 | 1.674 |
| 6659.764 | 1.663 |
| 6661.05 | 1.652 |
| 6662.336 | 1.641 |
| 6663.622 | 1.63 |
| 6664.907999999999 | 1.619 |
| 6666.193 | 1.609 |
| 6667.479 | 1.598 |
| 6668.764999999999 | 1.587 |
| 6670.051 | 1.576 |
| 6671.337 | 1.563 |
| 6672.623 | 1.551 |
| 6673.909 | 1.539 |
| 6675.195000000001 | 1.528 |
| 6676.481 | 1.517 |
| 6677.767 | 1.506 |
| 6679.053 | 1.495 |
| 6680.339 | 1.485 |
| 6681.624 | 1.475 |
| 6682.91 | 1.465 |
| 6684.196 | 1.454 |
| 6685.482 | 1.444 |
| 6686.768 | 1.434 |
| 6688.054 | 1.426 |
| 6689.339999999999 | 1.418 |
| 6690.626 | 1.41 |
| 6691.912 | 1.403 |
| 6693.197999999999 | 1.397 |
| 6694.484 | 1.39 |
| 6695.77 | 1.383 |
| 6697.054999999999 | 1.377 |
| 6698.341 | 1.37 |
| 6699.627 | 1.363 |
| 6700.913 | 1.356 |
| 6702.1990000000005 | 1.349 |
| 6703.485 | 1.341 |
| 6704.771 | 1.332 |
| 6706.057000000001 | 1.322 |
| 6707.343 | 1.311 |
| 6708.629 | 1.3 |
| 6709.915 | 1.286 |
| 6711.201 | 1.273 |
| 6712.486 | 1.259 |
| 6713.772 | 1.249 |
| 6715.058 | 1.239 |
| 6716.344 | 1.228 |
| 6717.63 | 1.219 |
| 6718.916 | 1.211 |
| 6720.201999999999 | 1.203 |
| 6721.488 | 1.195 |
| 6722.774 | 1.186 |
| 6724.0599999999995 | 1.176 |
| 6725.3460000000005 | 1.167 |
| 6726.6320000000005 | 1.158 |
| 6727.9169999999995 | 1.149 |
| 6729.203 | 1.14 |
| 6730.4890000000005 | 1.132 |
| 6731.775 | 1.125 |
| 6733.061000000001 | 1.117 |
| 6734.347 | 1.11 |
| 6735.633 | 1.104 |
| 6736.919 | 1.098 |
| 6738.205 | 1.092 |
| 6739.491 | 1.087 |
| 6740.776999999999 | 1.082 |
| 6742.063 | 1.077 |
| 6743.348 | 1.072 |
| 6744.634 | 1.067 |
| 6745.92 | 1.061 |
| 6747.206 | 1.056 |
| 6748.491999999999 | 1.05 |
| 6749.778 | 1.044 |
| 6751.064 | 1.037 |
| 6752.349999999999 | 1.03 |
| 6753.636 | 1.023 |
| 6754.922 | 1.016 |
| 6756.208 | 1.008 |
| 6757.494000000001 | 1.001 |
| 6758.7789999999995 | 0.994 |
| 6760.065 | 0.987 |
| 6761.351000000001 | 0.98 |
| 6762.637 | 0.974 |
| 6763.923 | 0.967 |
| 6765.209 | 0.96 |
| 6766.495 | 0.953 |
| 6767.781 | 0.946 |
| 6769.067 | 0.939 |
| 6770.353 | 0.931 |
| 6771.639 | 0.923 |
| 6772.925 | 0.915 |
| 6774.21 | 0.907 |
| 6775.496 | 0.9 |
| 6776.782 | 0.893 |
| 6778.068 | 0.886 |
| 6779.353999999999 | 0.88 |
| 6780.64 | 0.875 |
| 6781.926 | 0.87 |
| 6783.2119999999995 | 0.864 |
| 6784.4980000000005 | 0.859 |
| 6785.784 | 0.853 |
| 6787.07 | 0.847 |
| 6788.356000000001 | 0.838 |
| 6789.641 | 0.829 |
| 6790.927 | 0.819 |
| 6792.213000000001 | 0.81 |
| 6793.499 | 0.801 |
| 6794.785 | 0.793 |
| 6796.071000000001 | 0.784 |
| 6797.357 | 0.779 |
| 6798.643 | 0.774 |
| 6799.929 | 0.769 |
| 6801.215 | 0.765 |
| 6802.501 | 0.761 |
| 6803.787 | 0.757 |
| 6805.072 | 0.753 |
| 6806.358 | 0.749 |
| 6807.644 | 0.744 |
| 6808.93 | 0.74 |
| 6810.215999999999 | 0.735 |
| 6811.5019999999995 | 0.73 |
| 6812.7880000000005 | 0.725 |
| 6814.074 | 0.72 |
| 6815.36 | 0.716 |
| 6816.646000000001 | 0.711 |
| 6817.932 | 0.706 |
| 6819.218 | 0.701 |
| 6820.503000000001 | 0.696 |
| 6821.789 | 0.69 |
| 6823.075 | 0.685 |
| 6824.361 | 0.678 |
| 6825.647 | 0.671 |
| 6826.933 | 0.665 |
| 6828.219 | 0.658 |
| 6829.505 | 0.653 |
| 6830.790999999999 | 0.647 |
| 6832.077 | 0.641 |
| 6833.363 | 0.637 |
| 6834.648999999999 | 0.633 |
| 6835.934 | 0.629 |
| 6837.22 | 0.625 |
| 6838.505999999999 | 0.62 |
| 6839.792 | 0.616 |
| 6841.078 | 0.612 |
| 6842.364 | 0.608 |
| 6843.650000000001 | 0.603 |
| 6844.936 | 0.599 |
| 6846.222 | 0.595 |
| 6847.508000000001 | 0.591 |
| 6848.794 | 0.587 |
| 6850.08 | 0.583 |
| 6851.365000000001 | 0.579 |
| 6852.651 | 0.575 |
| 6853.937 | 0.571 |
| 6855.223 | 0.567 |
| 6856.509 | 0.561 |
| 6857.795 | 0.555 |
| 6859.081 | 0.549 |
| 6860.367 | 0.539 |
| 6861.652999999999 | 0.529 |
| 6862.939 | 0.518 |
| 6864.225 | 0.509 |
| 6865.5109999999995 | 0.501 |
| 6866.796 | 0.493 |
| 6868.082 | 0.484 |
| 6869.3679999999995 | 0.481 |
| 6870.654 | 0.479 |
| 6871.9400000000005 | 0.476 |
| 6873.226 | 0.474 |
| 6874.512000000001 | 0.473 |
| 6875.798 | 0.471 |
| 6877.084 | 0.47 |
| 6878.37 | 0.468 |
| 6879.656 | 0.465 |
| 6880.942 | 0.463 |
| 6882.227999999999 | 0.461 |
| 6883.513 | 0.457 |
| 6884.799 | 0.454 |
| 6886.084999999999 | 0.451 |
| 6887.371 | 0.448 |
| 6888.657 | 0.445 |
| 6889.942999999999 | 0.441 |
| 6891.229 | 0.438 |
| 6892.515 | 0.435 |
| 6893.8009999999995 | 0.432 |
| 6895.087 | 0.429 |
| 6896.373 | 0.426 |
| 6897.659 | 0.422 |
| 6898.944 | 0.419 |
| 6900.23 | 0.416 |
| 6901.516 | 0.412 |
| 6902.802000000001 | 0.408 |
| 6904.088 | 0.404 |
| 6905.374 | 0.4 |
| 6906.66 | 0.396 |
| 6907.946 | 0.392 |
| 6909.232 | 0.388 |
| 6910.518 | 0.384 |
| 6911.804 | 0.381 |
| 6913.09 | 0.378 |
| 6914.375 | 0.376 |
| 6915.661 | 0.373 |
| 6916.947 | 0.371 |
| 6918.233 | 0.368 |
| 6919.519 | 0.365 |
| 6920.804999999999 | 0.363 |
| 6922.091 | 0.36 |
| 6923.377 | 0.357 |
| 6924.663 | 0.354 |
| 6925.9490000000005 | 0.352 |
| 6927.235 | 0.349 |
| 6928.521 | 0.346 |
| 6929.8060000000005 | 0.343 |
| 6931.092 | 0.34 |
| 6932.378 | 0.337 |
| 6933.664000000001 | 0.334 |
| 6934.95 | 0.331 |
| 6936.236 | 0.329 |
| 6937.522000000001 | 0.326 |
| 6938.808 | 0.323 |
| 6940.094 | 0.32 |
| 6941.38 | 0.317 |
| 6942.666 | 0.314 |
| 6943.952 | 0.311 |
| 6945.237 | 0.308 |
| 6946.523 | 0.305 |
| 6947.809 | 0.302 |
| 6949.094999999999 | 0.299 |
| 6950.381 | 0.296 |
| 6951.6669999999995 | 0.292 |
| 6952.9529999999995 | 0.288 |
| 6954.2390000000005 | 0.284 |
| 6955.525 | 0.28 |
| 6956.811 | 0.275 |
| 6958.097000000001 | 0.27 |
| 6959.383 | 0.265 |
| 6960.668 | 0.26 |
| 6961.954000000001 | 0.257 |
| 6963.24 | 0.253 |
| 6964.526 | 0.25 |
| 6965.812 | 0.248 |
| 6967.098 | 0.247 |
| 6968.384 | 0.247 |
| 6969.67 | 0.246 |
| 6970.956 | 0.245 |
| 6972.241999999999 | 0.244 |
| 6973.528 | 0.243 |
| 6974.814 | 0.241 |
| 6976.098999999999 | 0.24 |
| 6977.385 | 0.238 |
| 6978.671 | 0.236 |
| 6979.956999999999 | 0.234 |
| 6981.243 | 0.232 |
| 6982.529 | 0.23 |
| 6983.815 | 0.228 |
| 6985.101000000001 | 0.226 |
| 6986.387 | 0.223 |
| 6987.673 | 0.221 |
| 6988.959000000001 | 0.219 |
| 6990.245 | 0.216 |
| 6991.53 | 0.213 |
| 6992.816000000001 | 0.21 |
| 6994.102 | 0.207 |
| 6995.388 | 0.204 |
| 6996.674 | 0.201 |
| 6997.96 | 0.198 |
| 6999.246 | 0.195 |
| 7000.532 | 0.193 |
| 7001.818 | 0.191 |
| 7003.104 | 0.189 |
| 7004.39 | 0.188 |
| 7005.676 | 0.186 |
| 7006.961 | 0.185 |
| 7008.247 | 0.183 |
| 7009.533 | 0.182 |
| 7010.8189999999995 | 0.181 |
| 7012.1050000000005 | 0.18 |
| 7013.3910000000005 | 0.179 |
| 7014.677 | 0.178 |
| 7015.963 | 0.177 |
| 7017.249 | 0.176 |
| 7018.535 | 0.174 |
| 7019.821 | 0.172 |
| 7021.107 | 0.17 |
| 7022.392 | 0.168 |
| 7023.678 | 0.165 |
| 7024.964 | 0.162 |
| 7026.25 | 0.159 |
| 7027.535999999999 | 0.157 |
| 7028.822 | 0.155 |
| 7030.108 | 0.153 |
| 7031.393999999999 | 0.151 |
| 7032.68 | 0.15 |
| 7033.966 | 0.149 |
| 7035.2519999999995 | 0.148 |
| 7036.5380000000005 | 0.147 |
| 7037.823 | 0.146 |
| 7039.1089999999995 | 0.144 |
| 7040.395 | 0.143 |
| 7041.681 | 0.142 |
| 7042.967 | 0.14 |
| 7044.253000000001 | 0.138 |
| 7045.539 | 0.136 |
| 7046.825 | 0.135 |
| 7048.111 | 0.133 |
| 7049.397 | 0.132 |
| 7050.683 | 0.131 |
| 7051.969 | 0.131 |
| 7053.254 | 0.131 |
| 7054.54 | 0.131 |
| 7055.826 | 0.132 |
| 7057.112 | 0.133 |
| 7058.398 | 0.135 |
| 7059.684 | 0.136 |
| 7060.97 | 0.137 |
| 7062.255999999999 | 0.137 |
| 7063.542 | 0.137 |
| 7064.828 | 0.138 |
| 7066.114 | 0.136 |
| 7067.400000000001 | 0.134 |
| 7068.685 | 0.132 |
| 7069.971 | 0.13 |
| 7071.2570000000005 | 0.127 |
| 7072.543 | 0.124 |
| 7073.829 | 0.121 |
| 7075.115000000001 | 0.118 |
| 7076.401 | 0.116 |
| 7077.687 | 0.114 |
| 7078.973 | 0.111 |
| 7080.259 | 0.109 |
| 7081.545 | 0.108 |
| 7082.830999999999 | 0.106 |
| 7084.116 | 0.105 |
| 7085.402 | 0.103 |
| 7086.688 | 0.101 |
| 7087.974 | 0.1 |
| 7089.26 | 0.098 |
| 7090.545999999999 | 0.096 |
| 7091.832 | 0.094 |
| 7093.1179999999995 | 0.091 |
| 7094.4039999999995 | 0.089 |
| 7095.6900000000005 | 0.086 |
| 7096.976 | 0.084 |
| 7098.262 | 0.081 |
| 7099.5470000000005 | 0.079 |
| 7100.833 | 0.076 |
| 7102.119 | 0.074 |
| 7103.405000000001 | 0.072 |
| 7104.691 | 0.071 |
| 7105.977 | 0.069 |
| 7107.263 | 0.068 |
| 7108.549 | 0.067 |
| 7109.835 | 0.066 |
| 7111.121 | 0.066 |
| 7112.407 | 0.065 |
| 7113.692999999999 | 0.064 |
| 7114.978 | 0.064 |
| 7116.264 | 0.064 |
| 7117.549999999999 | 0.063 |
| 7118.836 | 0.063 |
| 7120.122 | 0.063 |
| 7121.407999999999 | 0.063 |
| 7122.694 | 0.064 |
| 7123.9800000000005 | 0.064 |
| 7125.266 | 0.064 |
| 7126.552000000001 | 0.064 |
| 7127.838 | 0.065 |
| 7129.124 | 0.065 |
| 7130.409000000001 | 0.064 |
| 7131.695 | 0.064 |
| 7132.981 | 0.064 |
| 7134.267000000001 | 0.063 |
| 7135.553 | 0.063 |
| 7136.839 | 0.062 |
| 7138.125 | 0.061 |
| 7139.411 | 0.06 |
| 7140.697 | 0.059 |
| 7141.983 | 0.057 |
| 7143.269 | 0.056 |
| 7144.555 | 0.053 |
| 7145.84 | 0.051 |
| 7147.126 | 0.049 |
| 7148.412 | 0.047 |
| 7149.698 | 0.045 |
| 7150.984 | 0.043 |
| 7152.2699999999995 | 0.041 |
| 7153.556 | 0.04 |
| 7154.842000000001 | 0.039 |
| 7156.128 | 0.039 |
| 7157.414 | 0.038 |
| 7158.7 | 0.038 |
| 7159.986 | 0.038 |
| 7161.271 | 0.038 |
| 7162.557 | 0.038 |
| 7163.843 | 0.038 |
| 7165.129 | 0.037 |
| 7166.415 | 0.037 |
| 7167.701 | 0.037 |
| 7168.987 | 0.036 |
| 7170.273 | 0.036 |
| 7171.559 | 0.035 |
| 7172.844999999999 | 0.035 |
| 7174.131 | 0.034 |
| 7175.417 | 0.034 |
| 7176.701999999999 | 0.033 |
| 7177.988 | 0.032 |
| 7179.274 | 0.032 |
| 7180.5599999999995 | 0.032 |
| 7181.8460000000005 | 0.031 |
| 7183.132 | 0.031 |
| 7184.418 | 0.032 |
| 7185.704000000001 | 0.032 |
| 7186.99 | 0.032 |
| 7188.276 | 0.032 |
| 7189.562 | 0.033 |
| 7190.848 | 0.034 |
| 7192.133 | 0.034 |
| 7193.419 | 0.034 |
| 7194.705 | 0.034 |
| 7195.991 | 0.035 |
| 7197.277 | 0.034 |
| 7198.563 | 0.034 |
| 7199.849 | 0.033 |
| 7201.135 | 0.032 |
| 7202.421 | 0.031 |
| 7203.706999999999 | 0.029 |
| 7204.993 | 0.028 |
| 7206.279 | 0.026 |
| 7207.563999999999 | 0.025 |
| 7208.85 | 0.024 |
| 7210.136 | 0.023 |
| 7211.422 | 0.022 |
| 7212.7080000000005 | 0.021 |
| 7213.994 | 0.021 |
| 7215.28 | 0.02 |
| 7216.566000000001 | 0.02 |
| 7217.852 | 0.02 |
| 7219.138 | 0.02 |
| 7220.424 | 0.02 |
| 7221.71 | 0.02 |
| 7222.995 | 0.02 |
| 7224.281 | 0.021 |
| 7225.567 | 0.021 |
| 7226.853 | 0.021 |
| 7228.138999999999 | 0.021 |
| 7229.425 | 0.021 |
| 7230.711 | 0.022 |
| 7231.996999999999 | 0.022 |
| 7233.283 | 0.021 |
| 7234.5689999999995 | 0.021 |
| 7235.855 | 0.02 |
| 7237.1410000000005 | 0.02 |
| 7238.4259999999995 | 0.019 |
| 7239.7119999999995 | 0.018 |
| 7240.9980000000005 | 0.017 |
| 7242.284 | 0.016 |
| 7243.57 | 0.016 |
| 7244.856000000001 | 0.015 |
| 7246.142 | 0.014 |
| 7247.428 | 0.014 |
| 7248.714 | 0.014 |
| 7250.0 | 0.014 |
| 7251.286 | 0.015 |
| 7252.572 | 0.015 |
| 7253.857 | 0.015 |
| 7255.143 | 0.016 |
| 7256.429 | 0.017 |
| 7257.715 | 0.017 |
| 7259.000999999999 | 0.018 |
| 7260.287 | 0.018 |
| 7261.573 | 0.018 |
| 7262.8589999999995 | 0.018 |
| 7264.145 | 0.018 |
| 7265.4310000000005 | 0.018 |
| 7266.717 | 0.017 |
| 7268.003000000001 | 0.017 |
| 7269.289 | 0.016 |
| 7270.574 | 0.016 |
| 7271.860000000001 | 0.015 |
| 7273.146 | 0.015 |
| 7274.432 | 0.014 |
| 7275.718000000001 | 0.013 |
| 7277.004 | 0.013 |
| 7278.29 | 0.012 |
| 7279.576 | 0.011 |
| 7280.862 | 0.011 |
| 7282.148 | 0.01 |
| 7283.433999999999 | 0.01 |
| 7284.72 | 0.009 |
| 7286.005 | 0.009 |
| 7287.291 | 0.009 |
| 7288.577 | 0.008 |
| 7289.863 | 0.008 |
| 7291.148999999999 | 0.008 |
| 7292.435 | 0.008 |
| 7293.721 | 0.008 |
| 7295.007 | 0.008 |
| 7296.293000000001 | 0.008 |
| 7297.579 | 0.007 |
| 7298.865 | 0.007 |
| 7300.151 | 0.006 |
| 7301.436 | 0.005 |
| 7302.722 | 0.004 |
| 7304.008 | 0.003 |
| 7305.294 | 0.002 |
| 7306.58 | 0.001 |
| 7307.866 | 0.001 |
| 7309.152 | 0 |
| 7310.438 | 0 |
| 7311.724 | 0 |
| 7313.01 | 0 |
| 7314.295999999999 | 0 |
| 7315.582 | 0 |
| 7316.867 | 0 |
| 7318.152999999999 | 0 |
| 7319.439 | 0 |
| 7320.725 | 0 |
| 7322.0109999999995 | 0 |
| 7323.2970000000005 | 0 |
| 7324.583 | 0 |
| 7325.869 | 0 |
| 7327.155000000001 | 0 |
| 7328.441 | 0 |
| 7329.727 | 0 |
| 7331.013 | 0 |
| 7332.298 | 0 |
| 7333.584 | 0 |
| 7334.87 | 0 |
| 7336.156 | 0 |
| 7337.442 | 0 |
| 7338.728 | 0 |
| 7340.014 | 0 |
| 7341.3 | 0 |
| 7342.586 | 0 |
| 7343.872 | 0 |
| 7345.157999999999 | 0 |
| 7346.444 | 0 |
| 7347.729 | 0 |
| 7349.014999999999 | 0 |
| 7350.301 | 0 |
| 7351.587 | 0 |
| 7352.873 | 0 |
| 7354.159000000001 | 0 |
| 7355.445 | 0 |
| 7356.731 | 0 |
| 7358.017 | 0.001 |
| 7359.303 | 0.001 |
| 7360.589 | 0.001 |
| 7361.875 | 0.001 |
| 7363.16 | 0.001 |
| 7364.446 | 0 |
| 7365.732 | 0 |
| 7367.018 | 0 |
| 7368.304 | 0 |
| 7369.589999999999 | 0 |
| 7370.876 | 0 |
| 7372.162 | 0 |
| 7373.447999999999 | 0 |
| 7374.734 | 0 |
| 7376.0199999999995 | 0 |
| 7377.306 | 0 |
| 7378.591 | 0 |
| 7379.8769999999995 | 0 |
| 7381.163 | 0 |
| 7382.4490000000005 | 0 |
| 7383.735 | 0 |
| 7385.021 | 0 |
| 7386.307000000001 | 0 |
| 7387.593 | 0 |
| 7388.879 | 0 |
| 7390.165 | 0 |
| 7391.451 | 0 |
| 7392.737 | 0 |
| 7394.022 | 0 |
| 7395.308 | 0 |
| 7396.594 | 0 |
| 7397.88 | 0 |
| 7399.166 | 0 |
| 7400.451999999999 | 0 |
| 7401.738 | 0 |
| 7403.024 | 0 |
| 7404.3099999999995 | 0 |
| 7405.5960000000005 | 0 |
| 7406.8820000000005 | 0 |
| 7408.168 | 0 |
| 7409.453 | 0 |
| 7410.7390000000005 | 0 |
| 7412.025 | 0 |
| 7413.311000000001 | 0 |
| 7414.597 | 0 |
| 7415.883 | 0 |
| 7417.169000000001 | 0 |
| 7418.455 | 0 |
| 7419.741 | 0 |
| 7421.027 | 0 |
| 7422.313 | 0 |
| 7423.599 | 0 |
| 7424.884 | 0 |
| 7426.17 | 0 |
| 7427.456 | 0 |
| 7428.742 | 0 |
| 7430.028 | 0 |
| 7431.314 | 0 |
| 7432.599999999999 | 0 |
| 7433.886 | 0 |
| 7435.172 | 0 |
| 7436.458 | 0 |
| 7437.744000000001 | 0 |
| 7439.03 | 0 |
| 7440.315 | 0 |
| 7441.601000000001 | 0 |
| 7442.887 | 0 |
| 7444.173 | 0 |
| 7445.459 | 0 |
| 7446.745 | 0 |
| 7448.031 | 0 |
| 7449.317 | 0 |
| 7450.603 | 0 |
| 7451.889 | 0 |
| 7453.175 | 0 |
| 7454.461 | 0 |
| 7455.746 | 0 |
| 7457.032 | 0 |
| 7458.318 | 0 |
| 7459.603999999999 | 0 |
| 7460.89 | 0 |
| 7462.176 | 0 |
| 7463.4619999999995 | 0 |
| 7464.7480000000005 | 0 |
| 7466.034 | 0 |
| 7467.32 | 0 |
| 7468.606000000001 | 0 |
| 7469.892 | 0 |
| 7471.177 | 0 |
| 7472.463000000001 | 0 |
| 7473.749 | 0 |
| 7475.035 | 0 |
| 7476.321000000001 | 0 |
| 7477.607 | 0 |
| 7478.893 | 0 |
| 7480.179 | 0 |
| 7481.465 | 0 |
| 7482.751 | 0 |
| 7484.037 | 0 |
| 7485.323 | 0 |
| 7486.608 | 0 |
| 7487.894 | 0 |
| 7489.18 | 0 |
| 7490.465999999999 | 0 |
| 7491.752 | 0 |
| 7493.0380000000005 | 0 |
| 7494.324 | 0 |
| 7495.61 | 0 |
| 7496.896 | 0 |
| 7498.182 | 0 |
| 7499.468 | 0 |
| 7500.754 | 0 |
| 7502.039 | 0 |
| 7503.325 | 0 |
| 7504.611 | 0 |
| 7505.897 | 0 |
| 7507.183 | 0 |
| 7508.469 | 0 |
| 7509.755 | 0 |
| 7511.040999999999 | 0 |
| 7512.327 | 0 |
| 7513.613 | 0 |
| 7514.898999999999 | 0 |
| 7516.185 | 0 |
| 7517.47 | 0 |
| 7518.755999999999 | 0 |
| 7520.042 | 0 |
| 7521.3279999999995 | 0 |
| 7522.614 | 0 |
| 7523.900000000001 | 0 |
| 7525.186 | 0 |
| 7526.472 | 0 |
| 7527.758000000001 | 0 |
| 7529.044 | 0 |
| 7530.33 | 0 |
| 7531.616 | 0 |
| 7532.901 | 0 |
| 7534.187 | 0 |
| 7535.473 | 0 |
| 7536.759 | 0 |
| 7538.045 | 0 |
| 7539.331 | 0 |
| 7540.617 | 0 |
| 7541.902999999999 | 0 |
| 7543.189 | 0 |
| 7544.475 | 0 |
| 7545.7609999999995 | 0 |
| 7547.0470000000005 | 0 |
| 7548.332 | 0 |
| 7549.6179999999995 | 0 |
| 7550.904 | 0 |
| 7552.1900000000005 | 0 |
| 7553.476 | 0 |
| 7554.762000000001 | 0 |
| 7556.048 | 0 |
| 7557.334 | 0 |
| 7558.62 | 0 |
| 7559.906 | 0 |
| 7561.192 | 0 |
| 7562.477999999999 | 0 |
| 7563.763 | 0 |
| 7565.049 | 0 |
| 7566.335 | 0 |
| 7567.621 | 0 |
| 7568.907 | 0 |
| 7570.192999999999 | 0 |
| 7571.479 | 0 |
| 7572.765 | 0 |
| 7574.0509999999995 | 0 |
| 7575.337 | 0 |
| 7576.623 | 0 |
| 7577.909 | 0 |
| 7579.194 | 0 |
| 7580.48 | 0 |
| 7581.766 | 0 |
| 7583.052000000001 | 0 |
| 7584.338 | 0 |
| 7585.624 | 0 |
| 7586.91 | 0 |
| 7588.196 | 0 |
| 7589.482 | 0 |
| 7590.768 | 0 |
| 7592.054 | 0 |
| 7593.34 | 0 |
| 7594.625 | 0 |
| 7595.911 | 0 |
| 7597.197 | 0 |
| 7598.483 | 0 |
| 7599.769 | 0 |
| 7601.054999999999 | 0 |
| 7602.341 | 0 |
| 7603.627 | 0 |
| 7604.913 | 0 |
| 7606.1990000000005 | 0 |
| 7607.485 | 0 |
| 7608.771 | 0 |
| 7610.0560000000005 | 0 |
| 7611.342 | 0 |
| 7612.628 | 0 |
| 7613.914000000001 | 0 |
| 7615.2 | 0 |
| 7616.486 | 0 |
| 7617.772000000001 | 0 |
| 7619.058 | 0 |
| 7620.344 | 0 |
| 7621.63 | 0 |
| 7622.916 | 0 |
| 7624.202 | 0 |
| 7625.487 | 0 |
| 7626.773 | 0 |
| 7628.059 | 0 |
| 7629.345 | 0 |
| 7630.631 | 0 |
| 7631.9169999999995 | 0 |
| 7633.2029999999995 | 0 |
| 7634.4890000000005 | 0 |
| 7635.775 | 0 |
| 7637.061 | 0 |
| 7638.347000000001 | 0 |
| 7639.633 | 0 |
| 7640.918 | 0 |
| 7642.204000000001 | 0 |
| 7643.49 | 0 |
| 7644.776 | 0 |
| 7646.062 | 0 |
| 7647.348 | 0 |
| 7648.634 | 0 |
| 7649.92 | 0 |
| 7651.206 | 0 |
| 7652.491999999999 | 0 |
| 7653.778 | 0 |
| 7655.064 | 0 |
| 7656.349999999999 | 0 |
| 7657.635 | 0 |
| 7658.921 | 0 |
| 7660.206999999999 | 0 |
| 7661.493 | 0 |
| 7662.7789999999995 | 0 |
| 7664.065 | 0 |
| 7665.351000000001 | 0 |
| 7666.637 | 0 |
| 7667.923 | 0 |
| 7669.209000000001 | 0 |
| 7670.495 | 0 |
| 7671.781 | 0 |
| 7673.066000000001 | 0 |
| 7674.352 | 0 |
| 7675.638 | 0 |
| 7676.924 | 0 |
| 7678.21 | 0 |
| 7679.496 | 0 |
| 7680.782 | 0 |
| 7682.068 | 0 |
| 7683.353999999999 | 0 |
| 7684.64 | 0 |
| 7685.926 | 0 |
| 7687.2119999999995 | 0 |
| 7688.497 | 0 |
| 7689.783 | 0 |
| 7691.0689999999995 | 0 |
| 7692.3550000000005 | 0 |
| 7693.6410000000005 | 0 |
| 7694.927 | 0 |
| 7696.213 | 0 |
| 7697.499 | 0 |
| 7698.785 | 0 |
| 7700.071 | 0 |
| 7701.357 | 0 |
| 7702.643 | 0 |
| 7703.928 | 0 |
| 7705.214 | 0 |
| 7706.5 | 0 |
| 7707.785999999999 | 0 |
| 7709.072 | 0 |
| 7710.358 | 0 |
| 7711.643999999999 | 0 |
| 7712.93 | 0 |
| 7714.216 | 0 |
| 7715.5019999999995 | 0 |
| 7716.7880000000005 | 0 |
| 7718.074 | 0 |
| 7719.3589999999995 | 0 |
| 7720.645 | 0 |
| 7721.931 | 0 |
| 7723.217 | 0 |
| 7724.503000000001 | 0 |
| 7725.789 | 0 |
| 7727.075 | 0 |
| 7728.361 | 0 |
| 7729.647 | 0 |
| 7730.933 | 0 |
| 7732.219 | 0 |
| 7733.505 | 0 |
| 7734.79 | 0 |
| 7736.076 | 0 |
| 7737.362 | 0 |
| 7738.648 | 0 |
| 7739.934 | 0 |
| 7741.22 | 0 |
| 7742.505999999999 | 0 |
| 7743.792 | 0 |
| 7745.078 | 0 |
| 7746.364 | 0 |
| 7747.650000000001 | 0 |
| 7748.936 | 0 |
| 7750.221 | 0 |
| 7751.5070000000005 | 0 |
| 7752.793 | 0 |
| 7754.079 | 0 |
| 7755.365000000001 | 0 |
| 7756.651 | 0 |
| 7757.937 | 0 |
| 7759.223000000001 | 0 |
| 7760.509 | 0 |
| 7761.795 | 0 |
| 7763.081 | 0 |
| 7764.367 | 0 |
| 7765.652 | 0 |
| 7766.938 | 0 |
| 7768.224 | 0 |
| 7769.51 | 0 |
| 7770.795999999999 | 0 |
| 7772.082 | 0 |
| 7773.3679999999995 | 0 |
| 7774.6539999999995 | 0 |
| 7775.9400000000005 | 0 |
| 7777.226 | 0 |
| 7778.512 | 0 |
| 7779.798000000001 | 0 |
| 7781.083 | 0 |
| 7782.369 | 0 |
| 7783.655000000001 | 0 |
| 7784.941 | 0 |
| 7786.227 | 0 |
| 7787.513 | 0 |
| 7788.799 | 0 |
| 7790.085 | 0 |
| 7791.371 | 0 |
| 7792.657 | 0 |
| 7793.942999999999 | 0 |
| 7795.229 | 0 |
| 7796.514 | 0 |
| 7797.799999999999 | 0 |
| 7799.086 | 0 |
| 7800.372 | 0 |
| 7801.657999999999 | 0 |
| 7802.944 | 0 |
| 7804.2300000000005 | 0 |
| 7805.516 | 0 |
| 7806.802000000001 | 0 |
| 7808.088 | 0 |
| 7809.374 | 0 |
| 7810.660000000001 | 0 |
| 7811.945 | 0 |
| 7813.231 | 0 |
| 7814.517000000001 | 0 |
| 7815.803 | 0 |
| 7817.089 | 0 |
| 7818.375 | 0 |
| 7819.661 | 0 |
| 7820.947 | 0 |
| 7822.233 | 0 |
| 7823.519 | 0 |
| 7824.804999999999 | 0 |
| 7826.091 | 0 |
| 7827.376 | 0 |
| 7828.661999999999 | 0 |
| 7829.948 | 0 |
| 7831.234 | 0 |
| 7832.5199999999995 | 0 |
| 7833.8060000000005 | 0 |
| 7835.092000000001 | 0 |
| 7836.378 | 0 |
| 7837.664 | 0 |
| 7838.95 | 0 |
| 7840.236 | 0 |
| 7841.522 | 0 |
| 7842.807 | 0 |
| 7844.093 | 0 |
| 7845.379 | 0 |
| 7846.665 | 0 |
| 7847.951 | 0 |
| 7849.236999999999 | 0 |
| 7850.523 | 0 |
| 7851.809 | 0 |
| 7853.094999999999 | 0 |
| 7854.381 | 0 |
| 7855.667 | 0 |
| 7856.9529999999995 | 0 |
| 7858.238 | 0 |
| 7859.524 | 0 |
| 7860.8099999999995 | 0 |
| 7862.0960000000005 | 0 |
| 7863.382 | 0 |
| 7864.668 | 0 |
| 7865.954000000001 | 0 |
| 7867.24 | 0 |
| 7868.526 | 0 |
| 7869.812 | 0 |
| 7871.098 | 0 |
| 7872.384 | 0 |
| 7873.669 | 0 |
| 7874.955 | 0 |
| 7876.241 | 0 |
| 7877.527 | 0 |
| 7878.813 | 0 |
| 7880.099 | 0 |
| 7881.385 | 0 |
| 7882.671 | 0 |
| 7883.956999999999 | 0 |
| 7885.243 | 0 |
| 7886.529 | 0 |
| 7887.815 | 0 |
| 7889.1 | 0 |
| 7890.386 | 0 |
| 7891.672 | 0 |
| 7892.9580000000005 | 0 |
| 7894.244 | 0 |
| 7895.53 | 0 |
| 7896.816000000001 | 0 |
| 7898.102 | 0 |
| 7899.388 | 0 |
| 7900.674 | 0 |
| 7901.96 | 0 |
| 7903.246 | 0 |
| 7904.531000000001 | 0 |
| 7905.817 | 0 |
| 7907.103 | 0 |
| 7908.388999999999 | 0 |
| 7909.675 | 0 |
| 7910.961 | 0 |
| 7912.246999999999 | 0 |
| 7913.533 | 0 |
| 7914.8189999999995 | 0 |
| 7916.105 | 0 |
| 7917.3910000000005 | 0 |
| 7918.677 | 0 |
| 7919.9619999999995 | 0 |
| 7921.2480000000005 | 0 |
| 7922.534 | 0 |
| 7923.82 | 0 |
| 7925.106000000001 | 0 |
| 7926.392 | 0 |
| 7927.678 | 0 |
| 7928.964 | 0 |
| 7930.25 | 0 |
| 7931.536 | 0 |
| 7932.822 | 0 |
| 7934.108 | 0 |
| 7935.393 | 0 |
| 7936.679 | 0 |
| 7937.965 | 0 |
| 7939.250999999999 | 0 |
| 7940.537 | 0 |
| 7941.823 | 0 |
| 7943.1089999999995 | 0 |
| 7944.395 | 0 |
| 7945.6810000000005 | 0 |
| 7946.967 | 0 |
| 7948.253000000001 | 0 |
| 7949.539 | 0 |
| 7950.824 | 0 |
| 7952.110000000001 | 0 |
| 7953.396 | 0 |
| 7954.682 | 0 |
| 7955.968000000001 | 0 |
| 7957.254 | 0 |
| 7958.54 | 0 |
| 7959.826 | 0 |
| 7961.112 | 0 |
| 7962.398 | 0 |
| 7963.684 | 0 |
| 7964.97 | 0 |
| 7966.255 | 0 |
| 7967.541 | 0 |
| 7968.827 | 0 |
| 7970.112999999999 | 0 |
| 7971.399 | 0 |
| 7972.685 | 0 |
| 7973.971 | 0 |
| 7975.257 | 0 |
| 7976.543000000001 | 0 |
| 7977.829 | 0 |
| 7979.115 | 0 |
| 7980.401 | 0 |
| 7981.686 | 0 |
| 7982.972 | 0 |
| 7984.258 | 0 |
| 7985.544 | 0 |
| 7986.83 | 0 |
| 7988.116 | 0 |
| 7989.402 | 0 |
| 7990.687999999999 | 0 |
| 7991.974 | 0 |
| 7993.26 | 0 |
| 7994.545999999999 | 0 |
| 7995.832 | 0 |
| 7997.117 | 0 |
| 7998.402999999999 | 0 |
| 7999.689 | 0 |
| 8000.975 | 0 |
| 8002.261 | 0 |